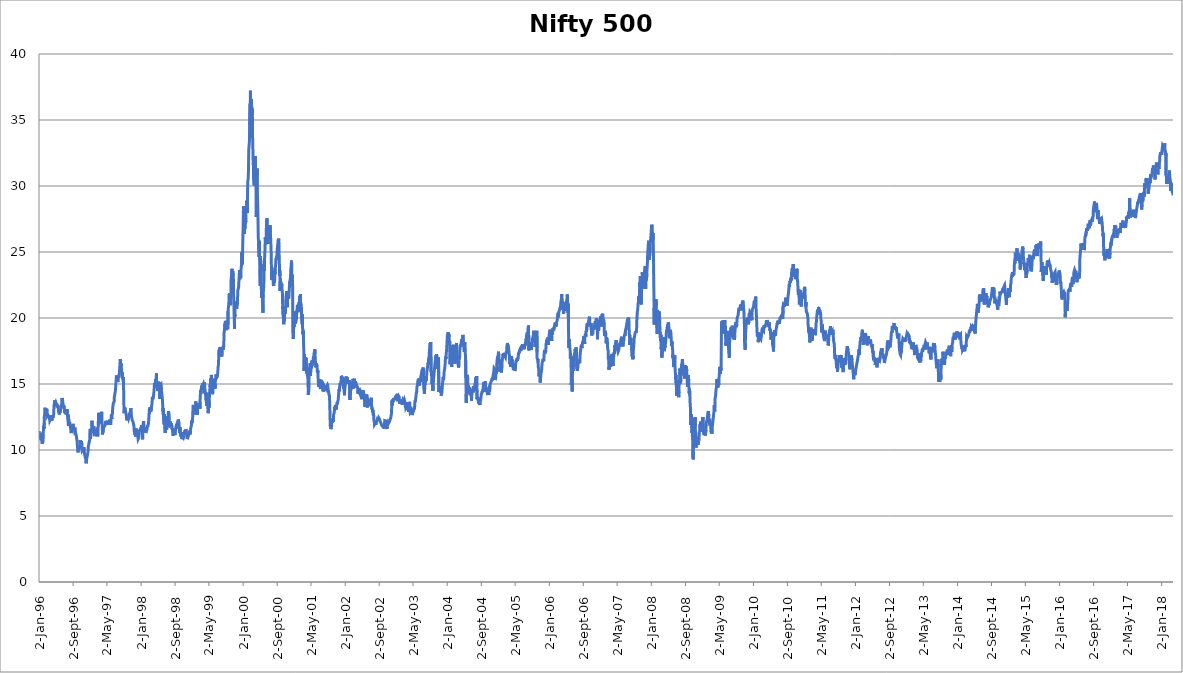
| Category | Nifty 500 P/E |
|---|---|
| 1996-01-02 | 11.43 |
| 1996-01-03 | 11.37 |
| 1996-01-04 | 11.3 |
| 1996-01-05 | 11.23 |
| 1996-01-08 | 11.07 |
| 1996-01-09 | 11.01 |
| 1996-01-10 | 10.98 |
| 1996-01-11 | 11.03 |
| 1996-01-12 | 11.05 |
| 1996-01-15 | 11.06 |
| 1996-01-16 | 11.03 |
| 1996-01-17 | 10.9 |
| 1996-01-18 | 10.81 |
| 1996-01-19 | 10.75 |
| 1996-01-22 | 10.74 |
| 1996-01-23 | 10.64 |
| 1996-01-24 | 10.47 |
| 1996-01-25 | 10.45 |
| 1996-01-29 | 10.54 |
| 1996-01-30 | 10.67 |
| 1996-01-31 | 10.7 |
| 1996-02-01 | 10.98 |
| 1996-02-02 | 11.52 |
| 1996-02-05 | 11.8 |
| 1996-02-06 | 11.61 |
| 1996-02-07 | 11.64 |
| 1996-02-08 | 12.07 |
| 1996-02-09 | 12.56 |
| 1996-02-12 | 12.76 |
| 1996-02-13 | 12.92 |
| 1996-02-14 | 13.2 |
| 1996-02-15 | 13.13 |
| 1996-02-16 | 12.93 |
| 1996-02-19 | 12.97 |
| 1996-02-20 | 12.84 |
| 1996-02-22 | 12.99 |
| 1996-02-23 | 12.97 |
| 1996-02-26 | 13.13 |
| 1996-02-27 | 13.08 |
| 1996-02-28 | 12.86 |
| 1996-02-29 | 12.61 |
| 1996-03-01 | 12.63 |
| 1996-03-04 | 12.69 |
| 1996-03-06 | 12.74 |
| 1996-03-07 | 12.68 |
| 1996-03-08 | 12.6 |
| 1996-03-11 | 12.41 |
| 1996-03-12 | 12.36 |
| 1996-03-13 | 12.53 |
| 1996-03-14 | 12.56 |
| 1996-03-15 | 12.47 |
| 1996-03-18 | 12.33 |
| 1996-03-19 | 12.22 |
| 1996-03-21 | 12.29 |
| 1996-03-22 | 12.22 |
| 1996-03-25 | 12.22 |
| 1996-03-26 | 12.22 |
| 1996-03-27 | 12.39 |
| 1996-03-29 | 12.64 |
| 1996-04-02 | 12.24 |
| 1996-04-03 | 12.3 |
| 1996-04-04 | 12.27 |
| 1996-04-05 | 12.39 |
| 1996-04-08 | 12.53 |
| 1996-04-09 | 12.51 |
| 1996-04-10 | 12.44 |
| 1996-04-11 | 12.4 |
| 1996-04-12 | 12.47 |
| 1996-04-15 | 12.66 |
| 1996-04-16 | 12.77 |
| 1996-04-17 | 13.11 |
| 1996-04-18 | 13.34 |
| 1996-04-22 | 13.3 |
| 1996-04-23 | 13.3 |
| 1996-04-24 | 13.78 |
| 1996-04-25 | 13.75 |
| 1996-04-26 | 13.54 |
| 1996-04-30 | 13.63 |
| 1996-05-02 | 13.67 |
| 1996-05-03 | 13.54 |
| 1996-05-06 | 13.34 |
| 1996-05-08 | 13.51 |
| 1996-05-09 | 13.32 |
| 1996-05-10 | 13.23 |
| 1996-05-13 | 13.35 |
| 1996-05-14 | 13.26 |
| 1996-05-15 | 13.25 |
| 1996-05-16 | 13.37 |
| 1996-05-17 | 13.23 |
| 1996-05-20 | 12.98 |
| 1996-05-21 | 12.86 |
| 1996-05-22 | 12.87 |
| 1996-05-23 | 12.83 |
| 1996-05-24 | 12.88 |
| 1996-05-27 | 12.69 |
| 1996-05-28 | 12.62 |
| 1996-05-29 | 12.94 |
| 1996-05-30 | 12.83 |
| 1996-05-31 | 12.79 |
| 1996-06-03 | 12.99 |
| 1996-06-04 | 12.96 |
| 1996-06-05 | 13 |
| 1996-06-06 | 13.11 |
| 1996-06-07 | 13.24 |
| 1996-06-10 | 13.36 |
| 1996-06-11 | 13.39 |
| 1996-06-12 | 13.52 |
| 1996-06-13 | 13.68 |
| 1996-06-14 | 13.94 |
| 1996-06-17 | 14 |
| 1996-06-18 | 13.98 |
| 1996-06-19 | 13.73 |
| 1996-06-20 | 13.72 |
| 1996-06-21 | 13.5 |
| 1996-06-24 | 13.54 |
| 1996-06-25 | 13.36 |
| 1996-06-26 | 13.24 |
| 1996-06-27 | 13.36 |
| 1996-06-28 | 13.3 |
| 1996-07-01 | 13.12 |
| 1996-07-02 | 13.05 |
| 1996-07-03 | 12.82 |
| 1996-07-04 | 12.88 |
| 1996-07-05 | 12.93 |
| 1996-07-08 | 12.99 |
| 1996-07-09 | 12.73 |
| 1996-07-10 | 12.78 |
| 1996-07-11 | 12.87 |
| 1996-07-12 | 12.79 |
| 1996-07-15 | 12.82 |
| 1996-07-16 | 12.7 |
| 1996-07-17 | 12.87 |
| 1996-07-18 | 12.94 |
| 1996-07-19 | 12.92 |
| 1996-07-22 | 13.09 |
| 1996-07-23 | 12.69 |
| 1996-07-24 | 12.49 |
| 1996-07-25 | 12.43 |
| 1996-07-26 | 12.3 |
| 1996-07-29 | 12.03 |
| 1996-07-30 | 11.83 |
| 1996-07-31 | 12.67 |
| 1996-08-01 | 12.14 |
| 1996-08-02 | 12.07 |
| 1996-08-05 | 12.02 |
| 1996-08-06 | 11.99 |
| 1996-08-07 | 12.12 |
| 1996-08-08 | 12.05 |
| 1996-08-09 | 12.02 |
| 1996-08-12 | 11.9 |
| 1996-08-13 | 11.83 |
| 1996-08-14 | 11.72 |
| 1996-08-16 | 11.57 |
| 1996-08-19 | 11.28 |
| 1996-08-20 | 11.28 |
| 1996-08-21 | 11.5 |
| 1996-08-22 | 11.55 |
| 1996-08-23 | 11.67 |
| 1996-08-26 | 11.67 |
| 1996-08-27 | 11.69 |
| 1996-08-29 | 11.87 |
| 1996-08-30 | 11.87 |
| 1996-09-02 | 11.98 |
| 1996-09-03 | 11.82 |
| 1996-09-04 | 11.86 |
| 1996-09-06 | 11.87 |
| 1996-09-09 | 11.75 |
| 1996-09-10 | 11.63 |
| 1996-09-11 | 11.49 |
| 1996-09-12 | 11.48 |
| 1996-09-13 | 11.36 |
| 1996-09-18 | 11.44 |
| 1996-09-19 | 11.29 |
| 1996-09-20 | 11.26 |
| 1996-09-23 | 11.17 |
| 1996-09-24 | 11.15 |
| 1996-09-25 | 11.14 |
| 1996-09-26 | 11.01 |
| 1996-09-27 | 10.85 |
| 1996-09-30 | 10.73 |
| 1996-10-01 | 10.47 |
| 1996-10-03 | 10.41 |
| 1996-10-04 | 10.16 |
| 1996-10-07 | 9.82 |
| 1996-10-08 | 9.84 |
| 1996-10-09 | 9.89 |
| 1996-10-10 | 10.2 |
| 1996-10-11 | 10.34 |
| 1996-10-14 | 10.15 |
| 1996-10-15 | 10.15 |
| 1996-10-16 | 10.12 |
| 1996-10-17 | 10.12 |
| 1996-10-18 | 10.22 |
| 1996-10-22 | 10.22 |
| 1996-10-23 | 10.75 |
| 1996-10-24 | 10.53 |
| 1996-10-25 | 10.51 |
| 1996-10-28 | 10.53 |
| 1996-10-29 | 10.44 |
| 1996-10-30 | 10.28 |
| 1996-10-31 | 10.22 |
| 1996-11-01 | 10.68 |
| 1996-11-04 | 10.02 |
| 1996-11-05 | 9.93 |
| 1996-11-06 | 9.93 |
| 1996-11-07 | 9.98 |
| 1996-11-10 | 9.96 |
| 1996-11-13 | 10.04 |
| 1996-11-14 | 10.03 |
| 1996-11-15 | 10.08 |
| 1996-11-18 | 10.2 |
| 1996-11-19 | 10.14 |
| 1996-11-20 | 9.97 |
| 1996-11-21 | 9.9 |
| 1996-11-22 | 9.71 |
| 1996-11-25 | 9.74 |
| 1996-11-26 | 9.66 |
| 1996-11-27 | 9.47 |
| 1996-11-28 | 9.44 |
| 1996-11-29 | 9.4 |
| 1996-12-02 | 9.27 |
| 1996-12-03 | 9.12 |
| 1996-12-04 | 8.99 |
| 1996-12-05 | 9.16 |
| 1996-12-06 | 9.23 |
| 1996-12-09 | 9.21 |
| 1996-12-10 | 9.19 |
| 1996-12-11 | 9.11 |
| 1996-12-12 | 9.57 |
| 1996-12-13 | 9.59 |
| 1996-12-16 | 9.59 |
| 1996-12-17 | 9.85 |
| 1996-12-18 | 9.94 |
| 1996-12-19 | 10.03 |
| 1996-12-20 | 10.3 |
| 1996-12-23 | 10.31 |
| 1996-12-24 | 10.31 |
| 1997-01-01 | 10.91 |
| 1997-01-02 | 11.6 |
| 1997-01-03 | 10.87 |
| 1997-01-06 | 10.97 |
| 1997-01-07 | 10.98 |
| 1997-01-08 | 11.22 |
| 1997-01-09 | 11.25 |
| 1997-01-10 | 11.46 |
| 1997-01-13 | 11.61 |
| 1997-01-14 | 11.72 |
| 1997-01-15 | 12.22 |
| 1997-01-16 | 11.71 |
| 1997-01-17 | 11.49 |
| 1997-01-20 | 11.37 |
| 1997-01-21 | 11.29 |
| 1997-01-22 | 11.4 |
| 1997-01-24 | 11.39 |
| 1997-01-27 | 11.72 |
| 1997-01-28 | 11.8 |
| 1997-01-29 | 11.64 |
| 1997-01-30 | 11.56 |
| 1997-01-31 | 11.2 |
| 1997-02-03 | 11.05 |
| 1997-02-04 | 11.01 |
| 1997-02-05 | 11.12 |
| 1997-02-06 | 11.21 |
| 1997-02-07 | 11.22 |
| 1997-02-10 | 11.25 |
| 1997-02-11 | 11.48 |
| 1997-02-12 | 11.45 |
| 1997-02-13 | 11.49 |
| 1997-02-14 | 11.52 |
| 1997-02-17 | 11.56 |
| 1997-02-18 | 11.54 |
| 1997-02-19 | 11.51 |
| 1997-02-20 | 11.44 |
| 1997-02-21 | 11.26 |
| 1997-02-24 | 11.03 |
| 1997-02-25 | 11.01 |
| 1997-02-26 | 11.04 |
| 1997-02-27 | 11.24 |
| 1997-02-28 | 11.88 |
| 1997-03-01 | 12.03 |
| 1997-03-03 | 12.67 |
| 1997-03-04 | 12.82 |
| 1997-03-05 | 12.84 |
| 1997-03-06 | 12.65 |
| 1997-03-10 | 12.35 |
| 1997-03-11 | 12.19 |
| 1997-03-12 | 12.3 |
| 1997-03-13 | 12.27 |
| 1997-03-14 | 12.19 |
| 1997-03-17 | 12.27 |
| 1997-03-18 | 12.25 |
| 1997-03-19 | 12.08 |
| 1997-03-20 | 12.16 |
| 1997-03-21 | 12.18 |
| 1997-03-25 | 12.89 |
| 1997-03-26 | 12.22 |
| 1997-03-27 | 12.23 |
| 1997-03-28 | 12.07 |
| 1997-03-31 | 11.18 |
| 1997-04-01 | 11.35 |
| 1997-04-02 | 11.72 |
| 1997-04-03 | 11.79 |
| 1997-04-04 | 11.73 |
| 1997-04-07 | 11.62 |
| 1997-04-09 | 11.85 |
| 1997-04-10 | 11.73 |
| 1997-04-11 | 11.79 |
| 1997-04-12 | 11.67 |
| 1997-04-15 | 11.71 |
| 1997-04-17 | 11.84 |
| 1997-04-21 | 12.11 |
| 1997-04-22 | 12.11 |
| 1997-04-23 | 12.08 |
| 1997-04-24 | 12.01 |
| 1997-04-25 | 12.21 |
| 1997-04-28 | 12.09 |
| 1997-04-29 | 12.05 |
| 1997-04-30 | 12.15 |
| 1997-05-02 | 12.01 |
| 1997-05-05 | 11.9 |
| 1997-05-06 | 12.01 |
| 1997-05-07 | 11.97 |
| 1997-05-09 | 12.01 |
| 1997-05-12 | 12.04 |
| 1997-05-13 | 11.98 |
| 1997-05-14 | 12.11 |
| 1997-05-15 | 12.14 |
| 1997-05-16 | 12.04 |
| 1997-05-19 | 12.21 |
| 1997-05-20 | 12.19 |
| 1997-05-21 | 12.3 |
| 1997-05-22 | 12.11 |
| 1997-05-23 | 12.04 |
| 1997-05-26 | 11.99 |
| 1997-05-27 | 11.93 |
| 1997-05-28 | 11.91 |
| 1997-05-29 | 11.99 |
| 1997-05-30 | 12.11 |
| 1997-06-02 | 12.04 |
| 1997-06-03 | 12.71 |
| 1997-06-04 | 12.78 |
| 1997-06-05 | 12.35 |
| 1997-06-06 | 12.65 |
| 1997-06-09 | 12.66 |
| 1997-06-10 | 12.74 |
| 1997-06-11 | 12.94 |
| 1997-06-12 | 13.19 |
| 1997-06-13 | 13.27 |
| 1997-06-16 | 13.31 |
| 1997-06-17 | 13.55 |
| 1997-06-18 | 13.57 |
| 1997-06-19 | 13.57 |
| 1997-06-20 | 13.58 |
| 1997-06-23 | 13.67 |
| 1997-06-24 | 14.02 |
| 1997-06-25 | 13.98 |
| 1997-06-26 | 14.01 |
| 1997-06-27 | 14 |
| 1997-06-30 | 14.4 |
| 1997-07-01 | 14.48 |
| 1997-07-02 | 14.6 |
| 1997-07-03 | 14.55 |
| 1997-07-04 | 14.55 |
| 1997-07-07 | 14.59 |
| 1997-07-08 | 14.67 |
| 1997-07-09 | 15.65 |
| 1997-07-10 | 15.65 |
| 1997-07-11 | 15.72 |
| 1997-07-14 | 15.46 |
| 1997-07-15 | 15.45 |
| 1997-07-16 | 15.38 |
| 1997-07-17 | 15.4 |
| 1997-07-18 | 15.16 |
| 1997-07-21 | 15.26 |
| 1997-07-22 | 15.42 |
| 1997-07-23 | 15.67 |
| 1997-07-24 | 15.63 |
| 1997-07-25 | 15.48 |
| 1997-07-28 | 15.54 |
| 1997-07-29 | 15.71 |
| 1997-07-30 | 15.78 |
| 1997-07-31 | 16 |
| 1997-08-01 | 16.14 |
| 1997-08-04 | 16.6 |
| 1997-08-05 | 16.88 |
| 1997-08-06 | 16.77 |
| 1997-08-07 | 16.5 |
| 1997-08-08 | 16.29 |
| 1997-08-11 | 16.55 |
| 1997-08-12 | 16.47 |
| 1997-08-13 | 16.28 |
| 1997-08-14 | 16.1 |
| 1997-08-19 | 15.68 |
| 1997-08-20 | 15.88 |
| 1997-08-21 | 15.7 |
| 1997-08-22 | 15.37 |
| 1997-08-26 | 15.53 |
| 1997-08-27 | 15.53 |
| 1997-08-28 | 15.07 |
| 1997-08-29 | 14.71 |
| 1997-09-01 | 12.79 |
| 1997-09-02 | 12.8 |
| 1997-09-03 | 12.85 |
| 1997-09-04 | 12.95 |
| 1997-09-05 | 13 |
| 1997-09-08 | 13.21 |
| 1997-09-09 | 13.08 |
| 1997-09-10 | 13.1 |
| 1997-09-11 | 13 |
| 1997-09-12 | 12.92 |
| 1997-09-15 | 12.96 |
| 1997-09-16 | 12.92 |
| 1997-09-17 | 12.69 |
| 1997-09-18 | 12.56 |
| 1997-09-19 | 12.38 |
| 1997-09-22 | 12.25 |
| 1997-09-23 | 12.36 |
| 1997-09-24 | 12.5 |
| 1997-09-25 | 12.37 |
| 1997-09-26 | 12.59 |
| 1997-09-29 | 12.61 |
| 1997-09-30 | 12.52 |
| 1997-10-01 | 12.53 |
| 1997-10-03 | 12.36 |
| 1997-10-06 | 12.39 |
| 1997-10-07 | 12.51 |
| 1997-10-08 | 12.56 |
| 1997-10-09 | 12.69 |
| 1997-10-10 | 12.81 |
| 1997-10-13 | 12.86 |
| 1997-10-14 | 12.71 |
| 1997-10-15 | 12.77 |
| 1997-10-16 | 12.89 |
| 1997-10-17 | 12.99 |
| 1997-10-20 | 13.17 |
| 1997-10-21 | 13.05 |
| 1997-10-22 | 12.96 |
| 1997-10-23 | 12.77 |
| 1997-10-24 | 12.58 |
| 1997-10-27 | 12.54 |
| 1997-10-30 | 12.26 |
| 1997-11-03 | 12.18 |
| 1997-11-04 | 12.18 |
| 1997-11-05 | 12.1 |
| 1997-11-06 | 12.04 |
| 1997-11-07 | 11.98 |
| 1997-11-10 | 11.9 |
| 1997-11-11 | 11.88 |
| 1997-11-12 | 11.66 |
| 1997-11-13 | 11.4 |
| 1997-11-14 | 11.39 |
| 1997-11-17 | 11.43 |
| 1997-11-18 | 11.27 |
| 1997-11-19 | 11.12 |
| 1997-11-20 | 11.16 |
| 1997-11-21 | 11.31 |
| 1997-11-24 | 11.02 |
| 1997-11-25 | 11.2 |
| 1997-11-26 | 11.38 |
| 1997-11-27 | 11.63 |
| 1997-11-28 | 11.42 |
| 1997-12-01 | 11.55 |
| 1997-12-02 | 11.51 |
| 1997-12-03 | 11.53 |
| 1997-12-04 | 11.41 |
| 1997-12-05 | 11.23 |
| 1997-12-08 | 11.21 |
| 1997-12-09 | 11.02 |
| 1997-12-10 | 10.91 |
| 1997-12-11 | 10.82 |
| 1997-12-12 | 10.81 |
| 1997-12-15 | 10.91 |
| 1997-12-16 | 11.06 |
| 1997-12-17 | 11.24 |
| 1997-12-18 | 11.21 |
| 1997-12-19 | 11.36 |
| 1997-12-22 | 11.39 |
| 1997-12-23 | 11.44 |
| 1997-12-24 | 11.38 |
| 1997-12-26 | 11.44 |
| 1997-12-29 | 11.65 |
| 1997-12-30 | 11.49 |
| 1997-12-31 | 11.53 |
| 1998-01-01 | 11.68 |
| 1998-01-02 | 11.78 |
| 1998-01-05 | 11.88 |
| 1998-01-06 | 11.79 |
| 1998-01-07 | 11.7 |
| 1998-01-08 | 11.44 |
| 1998-01-09 | 11.15 |
| 1998-01-12 | 10.81 |
| 1998-01-13 | 10.91 |
| 1998-01-14 | 10.85 |
| 1998-01-15 | 11.89 |
| 1998-01-16 | 11.94 |
| 1998-01-19 | 12.18 |
| 1998-01-20 | 12.08 |
| 1998-01-21 | 11.98 |
| 1998-01-22 | 11.84 |
| 1998-01-23 | 11.73 |
| 1998-01-27 | 11.49 |
| 1998-01-28 | 11.31 |
| 1998-01-29 | 11.29 |
| 1998-02-02 | 11.72 |
| 1998-02-03 | 11.68 |
| 1998-02-04 | 11.57 |
| 1998-02-05 | 11.64 |
| 1998-02-06 | 11.62 |
| 1998-02-09 | 11.56 |
| 1998-02-10 | 11.47 |
| 1998-02-11 | 11.41 |
| 1998-02-12 | 11.42 |
| 1998-02-13 | 11.58 |
| 1998-02-16 | 11.87 |
| 1998-02-17 | 11.75 |
| 1998-02-18 | 11.73 |
| 1998-02-19 | 11.84 |
| 1998-02-20 | 11.8 |
| 1998-02-23 | 12.01 |
| 1998-02-24 | 12.03 |
| 1998-02-26 | 12.46 |
| 1998-02-27 | 12.66 |
| 1998-03-02 | 13.2 |
| 1998-03-03 | 12.75 |
| 1998-03-04 | 13.08 |
| 1998-03-05 | 12.97 |
| 1998-03-06 | 12.94 |
| 1998-03-09 | 13.25 |
| 1998-03-10 | 13.19 |
| 1998-03-11 | 13.03 |
| 1998-03-12 | 12.92 |
| 1998-03-16 | 13.2 |
| 1998-03-17 | 13.21 |
| 1998-03-18 | 13.37 |
| 1998-03-19 | 13.38 |
| 1998-03-20 | 13.46 |
| 1998-03-23 | 14 |
| 1998-03-24 | 13.93 |
| 1998-03-25 | 14.07 |
| 1998-03-26 | 13.85 |
| 1998-03-27 | 13.91 |
| 1998-03-30 | 13.91 |
| 1998-03-31 | 13.85 |
| 1998-04-01 | 14.18 |
| 1998-04-02 | 14.23 |
| 1998-04-03 | 14.4 |
| 1998-04-06 | 14.82 |
| 1998-04-07 | 14.98 |
| 1998-04-08 | 15.02 |
| 1998-04-10 | 15.08 |
| 1998-04-13 | 14.84 |
| 1998-04-15 | 15.38 |
| 1998-04-16 | 15.13 |
| 1998-04-17 | 15.27 |
| 1998-04-20 | 15.48 |
| 1998-04-21 | 15.81 |
| 1998-04-22 | 15.37 |
| 1998-04-23 | 15.02 |
| 1998-04-24 | 14.76 |
| 1998-04-27 | 14.87 |
| 1998-04-29 | 14.47 |
| 1998-04-30 | 14.65 |
| 1998-05-04 | 15.18 |
| 1998-05-05 | 15.25 |
| 1998-05-06 | 14.93 |
| 1998-05-08 | 14.75 |
| 1998-05-12 | 14.49 |
| 1998-05-13 | 13.87 |
| 1998-05-14 | 14.32 |
| 1998-05-15 | 14.15 |
| 1998-05-18 | 14.75 |
| 1998-05-19 | 14.87 |
| 1998-05-20 | 15.11 |
| 1998-05-21 | 14.83 |
| 1998-05-22 | 14.79 |
| 1998-05-25 | 14.91 |
| 1998-05-26 | 14.83 |
| 1998-05-27 | 14.62 |
| 1998-05-28 | 14.44 |
| 1998-05-29 | 14.32 |
| 1998-06-01 | 14.32 |
| 1998-06-02 | 13.94 |
| 1998-06-03 | 13.93 |
| 1998-06-04 | 13.76 |
| 1998-06-05 | 13.15 |
| 1998-06-08 | 12.93 |
| 1998-06-09 | 13.14 |
| 1998-06-10 | 12.56 |
| 1998-06-11 | 12.65 |
| 1998-06-12 | 12.71 |
| 1998-06-15 | 12.02 |
| 1998-06-16 | 11.93 |
| 1998-06-17 | 12.71 |
| 1998-06-18 | 12.37 |
| 1998-06-19 | 11.83 |
| 1998-06-22 | 11.42 |
| 1998-06-23 | 11.29 |
| 1998-06-24 | 11.74 |
| 1998-06-25 | 11.95 |
| 1998-06-26 | 11.87 |
| 1998-06-29 | 12.33 |
| 1998-06-30 | 12.2 |
| 1998-07-01 | 12.04 |
| 1998-07-02 | 11.89 |
| 1998-07-03 | 11.55 |
| 1998-07-06 | 11.88 |
| 1998-07-07 | 12.01 |
| 1998-07-08 | 12.16 |
| 1998-07-09 | 12.37 |
| 1998-07-10 | 12.56 |
| 1998-07-13 | 12.4 |
| 1998-07-14 | 12.55 |
| 1998-07-15 | 12.58 |
| 1998-07-16 | 12.95 |
| 1998-07-17 | 12.88 |
| 1998-07-20 | 12.64 |
| 1998-07-21 | 12.53 |
| 1998-07-22 | 12.49 |
| 1998-07-23 | 12.1 |
| 1998-07-24 | 11.92 |
| 1998-07-27 | 11.71 |
| 1998-07-28 | 11.99 |
| 1998-07-29 | 12.16 |
| 1998-07-30 | 12.16 |
| 1998-07-31 | 12.15 |
| 1998-08-03 | 11.92 |
| 1998-08-04 | 11.91 |
| 1998-08-05 | 12.02 |
| 1998-08-06 | 11.95 |
| 1998-08-07 | 11.93 |
| 1998-08-10 | 11.81 |
| 1998-08-11 | 11.66 |
| 1998-08-12 | 11.55 |
| 1998-08-13 | 11.66 |
| 1998-08-14 | 11.44 |
| 1998-08-17 | 11.31 |
| 1998-08-18 | 11.09 |
| 1998-08-19 | 11.21 |
| 1998-08-20 | 11.54 |
| 1998-08-21 | 11.4 |
| 1998-08-24 | 11.46 |
| 1998-08-25 | 11.62 |
| 1998-08-27 | 11.65 |
| 1998-08-28 | 11.38 |
| 1998-08-31 | 11.42 |
| 1998-09-01 | 11.13 |
| 1998-09-02 | 11.25 |
| 1998-09-03 | 11.3 |
| 1998-09-04 | 11.44 |
| 1998-09-07 | 11.68 |
| 1998-09-08 | 11.79 |
| 1998-09-09 | 11.85 |
| 1998-09-10 | 11.84 |
| 1998-09-11 | 11.72 |
| 1998-09-14 | 11.96 |
| 1998-09-15 | 11.99 |
| 1998-09-16 | 11.96 |
| 1998-09-17 | 11.94 |
| 1998-09-18 | 11.87 |
| 1998-09-21 | 11.86 |
| 1998-09-22 | 11.86 |
| 1998-09-23 | 12.06 |
| 1998-09-24 | 12.31 |
| 1998-09-25 | 12.32 |
| 1998-09-28 | 12.3 |
| 1998-09-29 | 12.05 |
| 1998-09-30 | 12.07 |
| 1998-10-05 | 11.28 |
| 1998-10-06 | 11.35 |
| 1998-10-07 | 11.73 |
| 1998-10-08 | 11.39 |
| 1998-10-09 | 11.44 |
| 1998-10-12 | 11.24 |
| 1998-10-13 | 11.01 |
| 1998-10-14 | 11.28 |
| 1998-10-15 | 11.21 |
| 1998-10-16 | 11.22 |
| 1998-10-19 | 11.11 |
| 1998-10-20 | 10.82 |
| 1998-10-22 | 10.9 |
| 1998-10-23 | 10.93 |
| 1998-10-26 | 11.36 |
| 1998-10-27 | 11.33 |
| 1998-10-28 | 11.19 |
| 1998-10-29 | 11.2 |
| 1998-10-30 | 11.07 |
| 1998-10-31 | 11.04 |
| 1998-11-02 | 10.99 |
| 1998-11-03 | 10.94 |
| 1998-11-05 | 11.04 |
| 1998-11-06 | 11.14 |
| 1998-11-09 | 11.4 |
| 1998-11-10 | 11.47 |
| 1998-11-11 | 11.44 |
| 1998-11-12 | 11.5 |
| 1998-11-13 | 11.42 |
| 1998-11-16 | 11.3 |
| 1998-11-17 | 11.38 |
| 1998-11-18 | 11.59 |
| 1998-11-19 | 11.48 |
| 1998-11-20 | 11.4 |
| 1998-11-21 | 11.4 |
| 1998-11-23 | 11.26 |
| 1998-11-24 | 11.19 |
| 1998-11-26 | 10.97 |
| 1998-11-27 | 10.83 |
| 1998-11-28 | 10.81 |
| 1998-11-30 | 10.9 |
| 1998-12-01 | 10.88 |
| 1998-12-02 | 10.95 |
| 1998-12-03 | 10.91 |
| 1998-12-04 | 11.02 |
| 1998-12-07 | 11.22 |
| 1998-12-08 | 11.29 |
| 1998-12-09 | 11.32 |
| 1998-12-10 | 11.38 |
| 1998-12-11 | 11.45 |
| 1998-12-14 | 11.36 |
| 1998-12-15 | 11.36 |
| 1998-12-16 | 11.44 |
| 1998-12-17 | 11.19 |
| 1998-12-18 | 11.26 |
| 1998-12-21 | 11.58 |
| 1998-12-22 | 11.53 |
| 1998-12-23 | 11.57 |
| 1998-12-24 | 11.6 |
| 1998-12-28 | 11.88 |
| 1998-12-29 | 11.84 |
| 1998-12-30 | 12.23 |
| 1998-12-31 | 12.04 |
| 1999-01-01 | 12.14 |
| 1999-01-04 | 12.26 |
| 1999-01-05 | 12.4 |
| 1999-01-06 | 12.69 |
| 1999-01-07 | 12.95 |
| 1999-01-08 | 13.33 |
| 1999-01-11 | 13.41 |
| 1999-01-12 | 13.15 |
| 1999-01-13 | 13.2 |
| 1999-01-14 | 13.14 |
| 1999-01-15 | 12.88 |
| 1999-01-18 | 12.97 |
| 1999-01-19 | 12.7 |
| 1999-01-21 | 13.4 |
| 1999-01-22 | 13.33 |
| 1999-01-25 | 13.27 |
| 1999-01-27 | 13.67 |
| 1999-01-28 | 13.4 |
| 1999-01-29 | 13.47 |
| 1999-02-01 | 13.1 |
| 1999-02-02 | 12.9 |
| 1999-02-03 | 13.13 |
| 1999-02-04 | 12.95 |
| 1999-02-05 | 12.89 |
| 1999-02-08 | 12.66 |
| 1999-02-09 | 12.74 |
| 1999-02-10 | 13.19 |
| 1999-02-11 | 13.24 |
| 1999-02-12 | 13.39 |
| 1999-02-15 | 13.2 |
| 1999-02-16 | 13.31 |
| 1999-02-17 | 13.53 |
| 1999-02-18 | 13.56 |
| 1999-02-19 | 13.57 |
| 1999-02-22 | 13.22 |
| 1999-02-23 | 13.12 |
| 1999-02-24 | 13.31 |
| 1999-02-25 | 13.29 |
| 1999-02-26 | 13.13 |
| 1999-02-27 | 13.66 |
| 1999-03-01 | 14.07 |
| 1999-03-03 | 14.51 |
| 1999-03-04 | 14.3 |
| 1999-03-05 | 14.47 |
| 1999-03-08 | 14.61 |
| 1999-03-09 | 14.68 |
| 1999-03-10 | 14.87 |
| 1999-03-11 | 14.56 |
| 1999-03-12 | 14.77 |
| 1999-03-15 | 14.85 |
| 1999-03-16 | 14.65 |
| 1999-03-17 | 14.77 |
| 1999-03-18 | 15.05 |
| 1999-03-19 | 14.88 |
| 1999-03-20 | 14.89 |
| 1999-03-22 | 14.94 |
| 1999-03-23 | 14.99 |
| 1999-03-24 | 14.95 |
| 1999-03-25 | 14.87 |
| 1999-03-26 | 14.6 |
| 1999-03-30 | 14.68 |
| 1999-03-31 | 15.11 |
| 1999-04-01 | 15 |
| 1999-04-05 | 14.25 |
| 1999-04-06 | 14.29 |
| 1999-04-07 | 14.4 |
| 1999-04-08 | 14.25 |
| 1999-04-09 | 13.84 |
| 1999-04-12 | 13.84 |
| 1999-04-13 | 13.73 |
| 1999-04-15 | 13.33 |
| 1999-04-16 | 14.34 |
| 1999-04-17 | 13.33 |
| 1999-04-19 | 13.67 |
| 1999-04-20 | 13.7 |
| 1999-04-21 | 13.81 |
| 1999-04-22 | 13.58 |
| 1999-04-23 | 13.55 |
| 1999-04-26 | 12.79 |
| 1999-04-28 | 12.95 |
| 1999-04-29 | 13.29 |
| 1999-04-30 | 13.55 |
| 1999-05-03 | 13.21 |
| 1999-05-04 | 13.74 |
| 1999-05-05 | 13.96 |
| 1999-05-06 | 14.22 |
| 1999-05-07 | 14.41 |
| 1999-05-10 | 14.77 |
| 1999-05-11 | 14.99 |
| 1999-05-12 | 14.79 |
| 1999-05-13 | 15.22 |
| 1999-05-14 | 15.41 |
| 1999-05-17 | 15.19 |
| 1999-05-18 | 15.31 |
| 1999-05-19 | 15.69 |
| 1999-05-20 | 15.59 |
| 1999-05-21 | 15.29 |
| 1999-05-24 | 15.31 |
| 1999-05-25 | 15.41 |
| 1999-05-26 | 14.92 |
| 1999-05-27 | 14.46 |
| 1999-05-28 | 14.23 |
| 1999-05-31 | 14.85 |
| 1999-06-01 | 14.71 |
| 1999-06-02 | 14.79 |
| 1999-06-03 | 14.95 |
| 1999-06-04 | 15.14 |
| 1999-06-07 | 15.15 |
| 1999-06-08 | 15.39 |
| 1999-06-09 | 15.27 |
| 1999-06-10 | 15.31 |
| 1999-06-11 | 15.06 |
| 1999-06-14 | 14.81 |
| 1999-06-15 | 14.65 |
| 1999-06-16 | 14.98 |
| 1999-06-17 | 15.25 |
| 1999-06-18 | 15.21 |
| 1999-06-21 | 15.55 |
| 1999-06-22 | 15.72 |
| 1999-06-23 | 15.51 |
| 1999-06-24 | 15.38 |
| 1999-06-25 | 15.37 |
| 1999-06-28 | 15.55 |
| 1999-06-29 | 15.55 |
| 1999-06-30 | 15.52 |
| 1999-07-01 | 15.48 |
| 1999-07-02 | 15.63 |
| 1999-07-05 | 16.04 |
| 1999-07-06 | 16.22 |
| 1999-07-07 | 16.28 |
| 1999-07-08 | 16.27 |
| 1999-07-09 | 16.48 |
| 1999-07-12 | 17.29 |
| 1999-07-13 | 17.32 |
| 1999-07-14 | 17.6 |
| 1999-07-15 | 17.26 |
| 1999-07-16 | 17.4 |
| 1999-07-19 | 17.74 |
| 1999-07-20 | 17.33 |
| 1999-07-21 | 17.67 |
| 1999-07-22 | 17.81 |
| 1999-07-23 | 17.66 |
| 1999-07-26 | 17.52 |
| 1999-07-27 | 17.37 |
| 1999-07-28 | 17.55 |
| 1999-07-29 | 17.53 |
| 1999-07-30 | 17.39 |
| 1999-08-02 | 17.08 |
| 1999-08-03 | 17.14 |
| 1999-08-04 | 17.66 |
| 1999-08-05 | 17.59 |
| 1999-08-06 | 17.59 |
| 1999-08-09 | 17.8 |
| 1999-08-10 | 17.63 |
| 1999-08-11 | 17.75 |
| 1999-08-12 | 17.78 |
| 1999-08-13 | 17.62 |
| 1999-08-16 | 17.93 |
| 1999-08-17 | 18.32 |
| 1999-08-18 | 18.87 |
| 1999-08-19 | 18.89 |
| 1999-08-20 | 19.01 |
| 1999-08-23 | 19.3 |
| 1999-08-24 | 19.5 |
| 1999-08-25 | 19.29 |
| 1999-08-26 | 19.66 |
| 1999-08-27 | 19.79 |
| 1999-08-30 | 19.76 |
| 1999-08-31 | 19.63 |
| 1999-09-01 | 19.52 |
| 1999-09-02 | 19.08 |
| 1999-09-03 | 19.09 |
| 1999-09-06 | 19.31 |
| 1999-09-07 | 19.21 |
| 1999-09-08 | 19.36 |
| 1999-09-09 | 19.32 |
| 1999-09-10 | 19.3 |
| 1999-09-14 | 19.15 |
| 1999-09-15 | 19.16 |
| 1999-09-16 | 20.51 |
| 1999-09-17 | 20.68 |
| 1999-09-20 | 20.69 |
| 1999-09-21 | 20.65 |
| 1999-09-22 | 21.22 |
| 1999-09-23 | 21.57 |
| 1999-09-24 | 21.81 |
| 1999-09-27 | 21.52 |
| 1999-09-28 | 21.35 |
| 1999-09-29 | 21.89 |
| 1999-09-30 | 21.76 |
| 1999-10-01 | 21.56 |
| 1999-10-04 | 20.97 |
| 1999-10-05 | 21.24 |
| 1999-10-06 | 21.54 |
| 1999-10-07 | 22.68 |
| 1999-10-08 | 22.98 |
| 1999-10-11 | 23 |
| 1999-10-12 | 23.23 |
| 1999-10-13 | 23.55 |
| 1999-10-14 | 23.73 |
| 1999-10-15 | 22.83 |
| 1999-10-18 | 22.99 |
| 1999-10-20 | 23.56 |
| 1999-10-21 | 23.02 |
| 1999-10-22 | 22.75 |
| 1999-10-23 | 22.97 |
| 1999-10-25 | 21.85 |
| 1999-10-26 | 21.92 |
| 1999-10-27 | 21.84 |
| 1999-10-28 | 21.03 |
| 1999-10-29 | 20.28 |
| 1999-11-01 | 19.18 |
| 1999-11-02 | 20.24 |
| 1999-11-03 | 20.14 |
| 1999-11-04 | 20.3 |
| 1999-11-05 | 20.74 |
| 1999-11-07 | 20.82 |
| 1999-11-09 | 20.94 |
| 1999-11-10 | 21.29 |
| 1999-11-11 | 21.04 |
| 1999-11-12 | 20.98 |
| 1999-11-15 | 20.8 |
| 1999-11-16 | 20.79 |
| 1999-11-17 | 20.71 |
| 1999-11-18 | 20.79 |
| 1999-11-19 | 20.85 |
| 1999-11-22 | 21.08 |
| 1999-11-24 | 21.96 |
| 1999-11-25 | 22.1 |
| 1999-11-26 | 22.1 |
| 1999-11-29 | 22.16 |
| 1999-11-30 | 22.14 |
| 1999-12-01 | 22.36 |
| 1999-12-02 | 22.71 |
| 1999-12-03 | 22.9 |
| 1999-12-06 | 23.43 |
| 1999-12-07 | 23.63 |
| 1999-12-08 | 22.93 |
| 1999-12-09 | 23.17 |
| 1999-12-10 | 23.28 |
| 1999-12-13 | 23.31 |
| 1999-12-14 | 23.13 |
| 1999-12-15 | 23.03 |
| 1999-12-16 | 23.52 |
| 1999-12-17 | 23.62 |
| 1999-12-20 | 23.88 |
| 1999-12-21 | 23.93 |
| 1999-12-22 | 24.91 |
| 1999-12-23 | 25.01 |
| 1999-12-24 | 24.6 |
| 1999-12-27 | 24.05 |
| 1999-12-28 | 24.37 |
| 1999-12-29 | 24.89 |
| 1999-12-30 | 25.68 |
| 2000-01-03 | 27.52 |
| 2000-01-04 | 28.46 |
| 2000-01-05 | 27.78 |
| 2000-01-06 | 27.84 |
| 2000-01-07 | 27.2 |
| 2000-01-10 | 27.35 |
| 2000-01-11 | 26.36 |
| 2000-01-12 | 27.07 |
| 2000-01-13 | 26.76 |
| 2000-01-14 | 26.75 |
| 2000-01-17 | 26.9 |
| 2000-01-18 | 26.85 |
| 2000-01-19 | 27.45 |
| 2000-01-20 | 27.26 |
| 2000-01-21 | 27.83 |
| 2000-01-24 | 27.86 |
| 2000-01-25 | 27.88 |
| 2000-01-27 | 28.41 |
| 2000-01-28 | 28.89 |
| 2000-01-31 | 27.96 |
| 2000-02-01 | 28.36 |
| 2000-02-02 | 29.24 |
| 2000-02-03 | 29.91 |
| 2000-02-04 | 30.35 |
| 2000-02-07 | 30.56 |
| 2000-02-08 | 30.55 |
| 2000-02-09 | 31.19 |
| 2000-02-10 | 32.05 |
| 2000-02-11 | 32.76 |
| 2000-02-14 | 32.8 |
| 2000-02-15 | 32.75 |
| 2000-02-16 | 33.45 |
| 2000-02-17 | 34.67 |
| 2000-02-18 | 35.11 |
| 2000-02-21 | 36.24 |
| 2000-02-22 | 34.66 |
| 2000-02-23 | 37.21 |
| 2000-02-24 | 37.26 |
| 2000-02-25 | 35.93 |
| 2000-02-28 | 35.97 |
| 2000-02-29 | 34.31 |
| 2000-03-01 | 36.12 |
| 2000-03-02 | 36.58 |
| 2000-03-03 | 35.38 |
| 2000-03-06 | 35.86 |
| 2000-03-07 | 35.35 |
| 2000-03-08 | 35.21 |
| 2000-03-09 | 34 |
| 2000-03-10 | 33.41 |
| 2000-03-13 | 32.08 |
| 2000-03-14 | 31.61 |
| 2000-03-15 | 31.69 |
| 2000-03-16 | 30.65 |
| 2000-03-21 | 30.04 |
| 2000-03-22 | 30.84 |
| 2000-03-23 | 30.79 |
| 2000-03-24 | 31.48 |
| 2000-03-27 | 31.7 |
| 2000-03-28 | 32.02 |
| 2000-03-29 | 32.26 |
| 2000-03-30 | 31.39 |
| 2000-03-31 | 30.57 |
| 2000-04-03 | 29.76 |
| 2000-04-04 | 27.66 |
| 2000-04-05 | 27.61 |
| 2000-04-06 | 27.85 |
| 2000-04-07 | 29.69 |
| 2000-04-10 | 31.06 |
| 2000-04-11 | 31.32 |
| 2000-04-12 | 30.84 |
| 2000-04-13 | 29.47 |
| 2000-04-17 | 27.65 |
| 2000-04-18 | 26.76 |
| 2000-04-19 | 26.06 |
| 2000-04-20 | 25.95 |
| 2000-04-24 | 24.98 |
| 2000-04-25 | 24.63 |
| 2000-04-26 | 25.86 |
| 2000-04-27 | 25.13 |
| 2000-04-28 | 24.71 |
| 2000-05-02 | 23.03 |
| 2000-05-03 | 22.44 |
| 2000-05-04 | 23.66 |
| 2000-05-05 | 24.67 |
| 2000-05-08 | 23.58 |
| 2000-05-09 | 24.08 |
| 2000-05-10 | 23.59 |
| 2000-05-11 | 22.39 |
| 2000-05-12 | 21.54 |
| 2000-05-15 | 21.76 |
| 2000-05-16 | 21.83 |
| 2000-05-17 | 21.98 |
| 2000-05-18 | 21.75 |
| 2000-05-19 | 21.26 |
| 2000-05-22 | 20.4 |
| 2000-05-23 | 20.44 |
| 2000-05-24 | 21.74 |
| 2000-05-25 | 21.95 |
| 2000-05-26 | 22.04 |
| 2000-05-29 | 22.54 |
| 2000-05-30 | 23.35 |
| 2000-05-31 | 24.03 |
| 2000-06-01 | 23.57 |
| 2000-06-02 | 24.31 |
| 2000-06-05 | 24.86 |
| 2000-06-06 | 25.34 |
| 2000-06-07 | 25.52 |
| 2000-06-08 | 26.11 |
| 2000-06-09 | 25.99 |
| 2000-06-12 | 25.57 |
| 2000-06-13 | 25.52 |
| 2000-06-14 | 25.82 |
| 2000-06-15 | 26.07 |
| 2000-06-16 | 26.81 |
| 2000-06-19 | 27.24 |
| 2000-06-20 | 27.55 |
| 2000-06-21 | 26.75 |
| 2000-06-22 | 26.35 |
| 2000-06-23 | 25.81 |
| 2000-06-26 | 25.7 |
| 2000-06-27 | 25.62 |
| 2000-06-28 | 25.98 |
| 2000-06-29 | 26.14 |
| 2000-06-30 | 25.99 |
| 2000-07-03 | 26.53 |
| 2000-07-04 | 26.74 |
| 2000-07-05 | 26.87 |
| 2000-07-06 | 26.67 |
| 2000-07-07 | 26.57 |
| 2000-07-10 | 26.42 |
| 2000-07-11 | 26.31 |
| 2000-07-12 | 27.03 |
| 2000-07-13 | 26.59 |
| 2000-07-14 | 26.44 |
| 2000-07-17 | 25.97 |
| 2000-07-18 | 25.7 |
| 2000-07-19 | 25.23 |
| 2000-07-20 | 25.02 |
| 2000-07-21 | 24.51 |
| 2000-07-24 | 22.89 |
| 2000-07-25 | 23.83 |
| 2000-07-26 | 23.1 |
| 2000-07-27 | 23.57 |
| 2000-07-28 | 23.5 |
| 2000-07-31 | 23.36 |
| 2000-08-01 | 23.17 |
| 2000-08-02 | 23.26 |
| 2000-08-03 | 22.95 |
| 2000-08-04 | 22.52 |
| 2000-08-07 | 22.43 |
| 2000-08-08 | 23.09 |
| 2000-08-09 | 23.3 |
| 2000-08-10 | 22.89 |
| 2000-08-11 | 22.67 |
| 2000-08-14 | 22.8 |
| 2000-08-16 | 23.48 |
| 2000-08-17 | 23.31 |
| 2000-08-18 | 23.67 |
| 2000-08-21 | 23.99 |
| 2000-08-22 | 24.18 |
| 2000-08-23 | 24.16 |
| 2000-08-24 | 24.53 |
| 2000-08-25 | 24.57 |
| 2000-08-28 | 24.39 |
| 2000-08-29 | 24.44 |
| 2000-08-30 | 24.67 |
| 2000-08-31 | 24.99 |
| 2000-09-04 | 25.42 |
| 2000-09-05 | 25.43 |
| 2000-09-06 | 25.63 |
| 2000-09-07 | 25.71 |
| 2000-09-08 | 25.9 |
| 2000-09-11 | 25.87 |
| 2000-09-12 | 26.01 |
| 2000-09-13 | 25.83 |
| 2000-09-14 | 25.66 |
| 2000-09-15 | 24.88 |
| 2000-09-18 | 23.75 |
| 2000-09-19 | 23.2 |
| 2000-09-20 | 23.62 |
| 2000-09-21 | 23.2 |
| 2000-09-22 | 22.07 |
| 2000-09-25 | 22.97 |
| 2000-09-26 | 22.43 |
| 2000-09-27 | 22.75 |
| 2000-09-28 | 22.28 |
| 2000-09-29 | 22.34 |
| 2000-10-03 | 22.38 |
| 2000-10-04 | 22.6 |
| 2000-10-05 | 22.32 |
| 2000-10-06 | 22.27 |
| 2000-10-09 | 21.85 |
| 2000-10-10 | 21.25 |
| 2000-10-11 | 20.7 |
| 2000-10-12 | 20.87 |
| 2000-10-13 | 20.28 |
| 2000-10-16 | 20.34 |
| 2000-10-17 | 19.91 |
| 2000-10-18 | 19.52 |
| 2000-10-19 | 20.3 |
| 2000-10-20 | 20.38 |
| 2000-10-23 | 19.76 |
| 2000-10-24 | 19.92 |
| 2000-10-25 | 20.54 |
| 2000-10-26 | 20.63 |
| 2000-10-27 | 20.61 |
| 2000-10-30 | 20.33 |
| 2000-10-31 | 20.54 |
| 2000-11-01 | 20.91 |
| 2000-11-02 | 21.22 |
| 2000-11-03 | 21.53 |
| 2000-11-06 | 21.48 |
| 2000-11-07 | 21.6 |
| 2000-11-08 | 22.04 |
| 2000-11-09 | 22 |
| 2000-11-10 | 21.53 |
| 2000-11-13 | 20.82 |
| 2000-11-14 | 21.49 |
| 2000-11-15 | 21.63 |
| 2000-11-16 | 21.52 |
| 2000-11-17 | 21.56 |
| 2000-11-20 | 21.71 |
| 2000-11-21 | 21.73 |
| 2000-11-22 | 21.45 |
| 2000-11-23 | 21.46 |
| 2000-11-24 | 21.61 |
| 2000-11-27 | 22.19 |
| 2000-11-28 | 22.35 |
| 2000-11-29 | 22.5 |
| 2000-11-30 | 22.4 |
| 2000-12-01 | 22.78 |
| 2000-12-04 | 22.72 |
| 2000-12-05 | 23.04 |
| 2000-12-06 | 23.23 |
| 2000-12-07 | 23.35 |
| 2000-12-08 | 23.69 |
| 2000-12-11 | 24.02 |
| 2000-12-12 | 24.03 |
| 2000-12-13 | 24.35 |
| 2000-12-14 | 24.07 |
| 2000-12-15 | 23.22 |
| 2000-12-18 | 23.3 |
| 2000-12-19 | 23 |
| 2000-12-20 | 22.75 |
| 2000-12-21 | 22.44 |
| 2000-12-22 | 18.96 |
| 2000-12-26 | 18.42 |
| 2000-12-27 | 18.87 |
| 2000-12-28 | 19.14 |
| 2000-12-29 | 19.43 |
| 2001-01-01 | 19.32 |
| 2001-01-02 | 19.63 |
| 2001-01-03 | 19.78 |
| 2001-01-04 | 20.16 |
| 2001-01-05 | 20.5 |
| 2001-01-08 | 20.02 |
| 2001-01-09 | 20.11 |
| 2001-01-10 | 19.85 |
| 2001-01-11 | 19.58 |
| 2001-01-12 | 19.69 |
| 2001-01-15 | 19.66 |
| 2001-01-16 | 19.7 |
| 2001-01-17 | 19.76 |
| 2001-01-18 | 19.97 |
| 2001-01-19 | 20.51 |
| 2001-01-22 | 20.68 |
| 2001-01-23 | 20.73 |
| 2001-01-24 | 20.97 |
| 2001-01-25 | 20.98 |
| 2001-01-29 | 20.44 |
| 2001-01-30 | 21.02 |
| 2001-01-31 | 20.89 |
| 2001-02-01 | 20.57 |
| 2001-02-02 | 20.97 |
| 2001-02-05 | 21.1 |
| 2001-02-06 | 21.22 |
| 2001-02-07 | 21.08 |
| 2001-02-08 | 21.49 |
| 2001-02-09 | 21.66 |
| 2001-02-12 | 21.72 |
| 2001-02-13 | 21.48 |
| 2001-02-14 | 21.54 |
| 2001-02-15 | 21.82 |
| 2001-02-16 | 21.2 |
| 2001-02-19 | 21.27 |
| 2001-02-20 | 21.21 |
| 2001-02-21 | 20.97 |
| 2001-02-22 | 20.67 |
| 2001-02-23 | 20 |
| 2001-02-26 | 19.94 |
| 2001-02-27 | 19.52 |
| 2001-02-28 | 20.3 |
| 2001-03-01 | 20.29 |
| 2001-03-02 | 19.33 |
| 2001-03-05 | 18.77 |
| 2001-03-07 | 19.05 |
| 2001-03-08 | 18.98 |
| 2001-03-09 | 18.22 |
| 2001-03-12 | 17.15 |
| 2001-03-13 | 16 |
| 2001-03-14 | 16.72 |
| 2001-03-15 | 17.26 |
| 2001-03-16 | 16.91 |
| 2001-03-19 | 16.85 |
| 2001-03-20 | 16.61 |
| 2001-03-21 | 17.04 |
| 2001-03-22 | 16.66 |
| 2001-03-23 | 16.29 |
| 2001-03-26 | 16.29 |
| 2001-03-27 | 16.54 |
| 2001-03-28 | 16.98 |
| 2001-03-29 | 16.74 |
| 2001-03-30 | 16.12 |
| 2001-04-02 | 15.8 |
| 2001-04-03 | 15.97 |
| 2001-04-04 | 15.8 |
| 2001-04-06 | 15.71 |
| 2001-04-09 | 15.67 |
| 2001-04-10 | 15.31 |
| 2001-04-11 | 14.69 |
| 2001-04-12 | 14.18 |
| 2001-04-16 | 14.58 |
| 2001-04-17 | 14.95 |
| 2001-04-18 | 15.64 |
| 2001-04-19 | 16 |
| 2001-04-20 | 16.13 |
| 2001-04-23 | 16.14 |
| 2001-04-24 | 16.34 |
| 2001-04-25 | 16.55 |
| 2001-04-26 | 16.34 |
| 2001-04-27 | 15.61 |
| 2001-04-30 | 16.08 |
| 2001-05-02 | 16.23 |
| 2001-05-03 | 16.17 |
| 2001-05-04 | 16.34 |
| 2001-05-07 | 16.53 |
| 2001-05-08 | 16.78 |
| 2001-05-09 | 16.52 |
| 2001-05-10 | 16.5 |
| 2001-05-11 | 16.44 |
| 2001-05-14 | 16.43 |
| 2001-05-15 | 16.47 |
| 2001-05-16 | 16.58 |
| 2001-05-17 | 16.97 |
| 2001-05-18 | 16.95 |
| 2001-05-21 | 16.99 |
| 2001-05-22 | 17.11 |
| 2001-05-23 | 17.3 |
| 2001-05-24 | 17.3 |
| 2001-05-25 | 17.27 |
| 2001-05-28 | 17.53 |
| 2001-05-29 | 17.63 |
| 2001-05-30 | 17.23 |
| 2001-05-31 | 17.11 |
| 2001-06-01 | 16.87 |
| 2001-06-04 | 16.44 |
| 2001-06-05 | 16.26 |
| 2001-06-06 | 16.37 |
| 2001-06-07 | 16.34 |
| 2001-06-08 | 16.56 |
| 2001-06-11 | 16.56 |
| 2001-06-12 | 16.55 |
| 2001-06-13 | 16.6 |
| 2001-06-14 | 16.33 |
| 2001-06-15 | 15.97 |
| 2001-06-18 | 15.85 |
| 2001-06-19 | 16.03 |
| 2001-06-20 | 15.93 |
| 2001-06-21 | 15.53 |
| 2001-06-22 | 15.31 |
| 2001-06-25 | 14.8 |
| 2001-06-26 | 15.18 |
| 2001-06-27 | 15.23 |
| 2001-06-28 | 15.19 |
| 2001-06-29 | 15.36 |
| 2001-07-02 | 15.23 |
| 2001-07-03 | 14.84 |
| 2001-07-04 | 14.86 |
| 2001-07-05 | 14.8 |
| 2001-07-06 | 14.74 |
| 2001-07-09 | 14.63 |
| 2001-07-10 | 14.78 |
| 2001-07-11 | 14.96 |
| 2001-07-12 | 15.32 |
| 2001-07-13 | 15.22 |
| 2001-07-16 | 15.23 |
| 2001-07-17 | 15.19 |
| 2001-07-18 | 15.17 |
| 2001-07-19 | 15.05 |
| 2001-07-20 | 14.93 |
| 2001-07-23 | 14.84 |
| 2001-07-24 | 14.73 |
| 2001-07-25 | 14.56 |
| 2001-07-26 | 14.43 |
| 2001-07-27 | 14.43 |
| 2001-07-30 | 14.55 |
| 2001-07-31 | 14.76 |
| 2001-08-01 | 14.68 |
| 2001-08-02 | 14.77 |
| 2001-08-03 | 14.86 |
| 2001-08-06 | 14.87 |
| 2001-08-07 | 14.79 |
| 2001-08-08 | 14.74 |
| 2001-08-09 | 14.71 |
| 2001-08-10 | 14.75 |
| 2001-08-13 | 14.66 |
| 2001-08-14 | 14.84 |
| 2001-08-16 | 14.9 |
| 2001-08-17 | 14.76 |
| 2001-08-20 | 14.73 |
| 2001-08-21 | 14.73 |
| 2001-08-23 | 14.76 |
| 2001-08-24 | 14.82 |
| 2001-08-27 | 14.95 |
| 2001-08-28 | 14.92 |
| 2001-08-29 | 14.88 |
| 2001-08-30 | 14.87 |
| 2001-08-31 | 14.53 |
| 2001-09-03 | 14.43 |
| 2001-09-04 | 14.51 |
| 2001-09-05 | 14.35 |
| 2001-09-06 | 14.23 |
| 2001-09-07 | 14.25 |
| 2001-09-10 | 14.18 |
| 2001-09-11 | 14.14 |
| 2001-09-12 | 13.64 |
| 2001-09-13 | 13.46 |
| 2001-09-14 | 12.68 |
| 2001-09-17 | 11.8 |
| 2001-09-18 | 12.18 |
| 2001-09-19 | 12.23 |
| 2001-09-20 | 12.1 |
| 2001-09-21 | 11.58 |
| 2001-09-24 | 11.9 |
| 2001-09-25 | 11.75 |
| 2001-09-26 | 12 |
| 2001-09-27 | 12.06 |
| 2001-09-28 | 12.39 |
| 2001-10-01 | 12.3 |
| 2001-10-03 | 12.07 |
| 2001-10-04 | 12.28 |
| 2001-10-05 | 12.32 |
| 2001-10-08 | 12.13 |
| 2001-10-09 | 12.26 |
| 2001-10-10 | 12.6 |
| 2001-10-11 | 12.74 |
| 2001-10-12 | 12.81 |
| 2001-10-15 | 12.83 |
| 2001-10-16 | 13 |
| 2001-10-17 | 13.25 |
| 2001-10-18 | 13.02 |
| 2001-10-19 | 13.13 |
| 2001-10-22 | 13.2 |
| 2001-10-23 | 13.41 |
| 2001-10-24 | 13.39 |
| 2001-10-25 | 13.31 |
| 2001-10-29 | 13.29 |
| 2001-10-30 | 13.08 |
| 2001-10-31 | 13.18 |
| 2001-11-01 | 13.41 |
| 2001-11-02 | 13.41 |
| 2001-11-05 | 13.42 |
| 2001-11-06 | 13.63 |
| 2001-11-07 | 13.47 |
| 2001-11-08 | 13.61 |
| 2001-11-09 | 13.69 |
| 2001-11-12 | 13.79 |
| 2001-11-13 | 13.73 |
| 2001-11-14 | 13.86 |
| 2001-11-15 | 14.19 |
| 2001-11-19 | 14.62 |
| 2001-11-20 | 14.45 |
| 2001-11-21 | 14.61 |
| 2001-11-22 | 14.73 |
| 2001-11-23 | 14.67 |
| 2001-11-26 | 15.07 |
| 2001-11-27 | 15.04 |
| 2001-11-28 | 14.92 |
| 2001-11-29 | 14.9 |
| 2001-12-03 | 14.94 |
| 2001-12-04 | 15.23 |
| 2001-12-05 | 15.63 |
| 2001-12-06 | 15.62 |
| 2001-12-07 | 15.7 |
| 2001-12-10 | 15.69 |
| 2001-12-11 | 15.59 |
| 2001-12-12 | 15.63 |
| 2001-12-13 | 15.42 |
| 2001-12-14 | 15.3 |
| 2001-12-18 | 15.12 |
| 2001-12-19 | 14.82 |
| 2001-12-20 | 14.88 |
| 2001-12-21 | 14.65 |
| 2001-12-24 | 14.74 |
| 2001-12-26 | 14.42 |
| 2001-12-27 | 14.15 |
| 2001-12-28 | 14.44 |
| 2001-12-31 | 14.82 |
| 2002-01-01 | 14.78 |
| 2002-01-02 | 14.9 |
| 2002-01-03 | 15.08 |
| 2002-01-04 | 15.39 |
| 2002-01-07 | 15.47 |
| 2002-01-08 | 15.57 |
| 2002-01-09 | 15.34 |
| 2002-01-10 | 15.19 |
| 2002-01-11 | 15.02 |
| 2002-01-14 | 15.38 |
| 2002-01-15 | 15.25 |
| 2002-01-16 | 15.29 |
| 2002-01-17 | 15.49 |
| 2002-01-18 | 15.28 |
| 2002-01-21 | 15.33 |
| 2002-01-22 | 15.31 |
| 2002-01-23 | 15.28 |
| 2002-01-24 | 15.21 |
| 2002-01-25 | 15.16 |
| 2002-01-28 | 15.05 |
| 2002-01-29 | 15.11 |
| 2002-01-30 | 15.03 |
| 2002-01-31 | 15.18 |
| 2002-02-01 | 15.28 |
| 2002-02-04 | 13.79 |
| 2002-02-05 | 13.75 |
| 2002-02-06 | 14.31 |
| 2002-02-07 | 14.18 |
| 2002-02-08 | 14.41 |
| 2002-02-11 | 14.54 |
| 2002-02-12 | 14.56 |
| 2002-02-13 | 14.62 |
| 2002-02-14 | 14.84 |
| 2002-02-15 | 14.98 |
| 2002-02-18 | 15.15 |
| 2002-02-19 | 14.95 |
| 2002-02-20 | 14.79 |
| 2002-02-21 | 14.88 |
| 2002-02-22 | 15.04 |
| 2002-02-25 | 15.08 |
| 2002-02-26 | 15.39 |
| 2002-02-27 | 15.3 |
| 2002-02-28 | 14.65 |
| 2002-03-01 | 15.08 |
| 2002-03-04 | 15.21 |
| 2002-03-05 | 15.23 |
| 2002-03-06 | 15.17 |
| 2002-03-07 | 15.4 |
| 2002-03-08 | 15.34 |
| 2002-03-11 | 15.12 |
| 2002-03-12 | 14.89 |
| 2002-03-13 | 14.99 |
| 2002-03-14 | 15.04 |
| 2002-03-15 | 15.2 |
| 2002-03-18 | 15.25 |
| 2002-03-19 | 15.01 |
| 2002-03-20 | 15.04 |
| 2002-03-21 | 14.93 |
| 2002-03-22 | 14.86 |
| 2002-03-26 | 14.71 |
| 2002-03-27 | 14.72 |
| 2002-03-28 | 14.82 |
| 2002-04-01 | 14.73 |
| 2002-04-02 | 14.69 |
| 2002-04-03 | 14.27 |
| 2002-04-04 | 14.52 |
| 2002-04-05 | 14.55 |
| 2002-04-08 | 14.49 |
| 2002-04-09 | 14.42 |
| 2002-04-10 | 14.58 |
| 2002-04-11 | 14.69 |
| 2002-04-12 | 14.74 |
| 2002-04-15 | 14.57 |
| 2002-04-16 | 14.43 |
| 2002-04-17 | 14.5 |
| 2002-04-18 | 14.56 |
| 2002-04-19 | 14.22 |
| 2002-04-22 | 14.24 |
| 2002-04-23 | 14.14 |
| 2002-04-24 | 14.21 |
| 2002-04-25 | 14.04 |
| 2002-04-26 | 14.04 |
| 2002-04-29 | 13.85 |
| 2002-04-30 | 14.03 |
| 2002-05-02 | 14.15 |
| 2002-05-03 | 14.16 |
| 2002-05-06 | 14.26 |
| 2002-05-07 | 14.35 |
| 2002-05-08 | 14.42 |
| 2002-05-09 | 14.54 |
| 2002-05-10 | 14.39 |
| 2002-05-13 | 14.44 |
| 2002-05-14 | 14.43 |
| 2002-05-15 | 14.27 |
| 2002-05-16 | 14.11 |
| 2002-05-17 | 14.03 |
| 2002-05-20 | 13.79 |
| 2002-05-21 | 13.39 |
| 2002-05-22 | 13.43 |
| 2002-05-23 | 13.28 |
| 2002-05-24 | 13.87 |
| 2002-05-27 | 13.9 |
| 2002-05-28 | 13.52 |
| 2002-05-29 | 13.62 |
| 2002-05-30 | 13.51 |
| 2002-05-31 | 13.62 |
| 2002-06-03 | 13.83 |
| 2002-06-04 | 13.97 |
| 2002-06-05 | 14.2 |
| 2002-06-06 | 13.46 |
| 2002-06-07 | 13.22 |
| 2002-06-10 | 13.5 |
| 2002-06-11 | 13.89 |
| 2002-06-12 | 13.89 |
| 2002-06-13 | 13.82 |
| 2002-06-14 | 13.86 |
| 2002-06-17 | 13.93 |
| 2002-06-18 | 13.77 |
| 2002-06-19 | 13.59 |
| 2002-06-20 | 13.66 |
| 2002-06-21 | 13.57 |
| 2002-06-24 | 13.55 |
| 2002-06-25 | 13.5 |
| 2002-06-26 | 13.32 |
| 2002-06-27 | 13.43 |
| 2002-06-28 | 13.54 |
| 2002-07-01 | 13.73 |
| 2002-07-02 | 13.71 |
| 2002-07-03 | 13.75 |
| 2002-07-04 | 13.82 |
| 2002-07-05 | 13.86 |
| 2002-07-08 | 13.96 |
| 2002-07-09 | 13.42 |
| 2002-07-10 | 13.29 |
| 2002-07-11 | 13.13 |
| 2002-07-12 | 13.21 |
| 2002-07-15 | 13.17 |
| 2002-07-16 | 12.98 |
| 2002-07-17 | 12.85 |
| 2002-07-18 | 13.04 |
| 2002-07-19 | 12.97 |
| 2002-07-22 | 12.63 |
| 2002-07-23 | 12.79 |
| 2002-07-24 | 12.57 |
| 2002-07-25 | 12.55 |
| 2002-07-26 | 12.22 |
| 2002-07-29 | 12.1 |
| 2002-07-30 | 11.93 |
| 2002-07-31 | 11.92 |
| 2002-08-01 | 11.92 |
| 2002-08-02 | 11.94 |
| 2002-08-05 | 12.04 |
| 2002-08-06 | 12.09 |
| 2002-08-07 | 12.12 |
| 2002-08-08 | 11.91 |
| 2002-08-09 | 12 |
| 2002-08-12 | 12.1 |
| 2002-08-13 | 12.17 |
| 2002-08-14 | 12.15 |
| 2002-08-16 | 12.25 |
| 2002-08-19 | 12.28 |
| 2002-08-20 | 12.38 |
| 2002-08-21 | 12.4 |
| 2002-08-22 | 12.32 |
| 2002-08-23 | 12.39 |
| 2002-08-26 | 12.45 |
| 2002-08-27 | 12.32 |
| 2002-08-28 | 12.31 |
| 2002-08-29 | 12.24 |
| 2002-08-30 | 12.43 |
| 2002-09-02 | 12.47 |
| 2002-09-03 | 12.4 |
| 2002-09-04 | 12.45 |
| 2002-09-05 | 12.46 |
| 2002-09-06 | 12.31 |
| 2002-09-09 | 12.15 |
| 2002-09-11 | 12.12 |
| 2002-09-12 | 12.17 |
| 2002-09-13 | 12.07 |
| 2002-09-16 | 11.96 |
| 2002-09-17 | 12.02 |
| 2002-09-18 | 11.91 |
| 2002-09-19 | 11.89 |
| 2002-09-20 | 11.86 |
| 2002-09-23 | 11.85 |
| 2002-09-24 | 11.79 |
| 2002-09-25 | 11.84 |
| 2002-09-26 | 11.85 |
| 2002-09-27 | 11.91 |
| 2002-09-30 | 11.73 |
| 2002-10-01 | 11.63 |
| 2002-10-03 | 11.6 |
| 2002-10-04 | 11.6 |
| 2002-10-07 | 11.78 |
| 2002-10-08 | 11.84 |
| 2002-10-09 | 11.77 |
| 2002-10-10 | 12.02 |
| 2002-10-11 | 12.23 |
| 2002-10-14 | 12.21 |
| 2002-10-16 | 12.18 |
| 2002-10-17 | 12.18 |
| 2002-10-18 | 12.24 |
| 2002-10-21 | 12.19 |
| 2002-10-22 | 12 |
| 2002-10-23 | 11.94 |
| 2002-10-24 | 11.84 |
| 2002-10-25 | 11.68 |
| 2002-10-28 | 11.6 |
| 2002-10-29 | 11.77 |
| 2002-10-30 | 11.82 |
| 2002-10-31 | 11.96 |
| 2002-11-01 | 12.01 |
| 2002-11-04 | 12.11 |
| 2002-11-05 | 12.07 |
| 2002-11-07 | 12.05 |
| 2002-11-08 | 12.03 |
| 2002-11-11 | 11.97 |
| 2002-11-12 | 12.02 |
| 2002-11-13 | 12.05 |
| 2002-11-14 | 12.04 |
| 2002-11-15 | 12.18 |
| 2002-11-18 | 12.28 |
| 2002-11-20 | 12.26 |
| 2002-11-21 | 12.29 |
| 2002-11-22 | 12.41 |
| 2002-11-25 | 12.52 |
| 2002-11-26 | 12.62 |
| 2002-11-27 | 12.58 |
| 2002-11-28 | 12.73 |
| 2002-11-29 | 12.8 |
| 2002-12-02 | 13.75 |
| 2002-12-03 | 13.56 |
| 2002-12-04 | 13.37 |
| 2002-12-05 | 13.49 |
| 2002-12-06 | 13.83 |
| 2002-12-09 | 13.64 |
| 2002-12-10 | 13.68 |
| 2002-12-11 | 13.74 |
| 2002-12-12 | 13.81 |
| 2002-12-13 | 13.94 |
| 2002-12-16 | 13.86 |
| 2002-12-17 | 13.78 |
| 2002-12-18 | 13.84 |
| 2002-12-19 | 13.81 |
| 2002-12-20 | 13.86 |
| 2002-12-23 | 13.83 |
| 2002-12-24 | 13.91 |
| 2002-12-26 | 14.01 |
| 2002-12-27 | 14.05 |
| 2002-12-30 | 13.99 |
| 2002-12-31 | 14.02 |
| 2003-01-01 | 14.1 |
| 2003-01-02 | 14.08 |
| 2003-01-03 | 14.04 |
| 2003-01-06 | 13.99 |
| 2003-01-07 | 13.99 |
| 2003-01-08 | 14.06 |
| 2003-01-09 | 14.22 |
| 2003-01-10 | 14.02 |
| 2003-01-13 | 13.96 |
| 2003-01-14 | 14.01 |
| 2003-01-15 | 14.08 |
| 2003-01-16 | 14.14 |
| 2003-01-17 | 14.16 |
| 2003-01-20 | 14.07 |
| 2003-01-21 | 14.1 |
| 2003-01-22 | 14.12 |
| 2003-01-23 | 14.01 |
| 2003-01-24 | 13.79 |
| 2003-01-27 | 13.51 |
| 2003-01-28 | 13.63 |
| 2003-01-29 | 13.6 |
| 2003-01-30 | 13.56 |
| 2003-01-31 | 13.58 |
| 2003-02-03 | 13.72 |
| 2003-02-04 | 13.73 |
| 2003-02-05 | 13.66 |
| 2003-02-06 | 13.83 |
| 2003-02-07 | 13.77 |
| 2003-02-10 | 13.63 |
| 2003-02-11 | 13.61 |
| 2003-02-12 | 13.55 |
| 2003-02-14 | 13.43 |
| 2003-02-17 | 13.72 |
| 2003-02-18 | 13.75 |
| 2003-02-19 | 13.82 |
| 2003-02-20 | 13.83 |
| 2003-02-21 | 13.84 |
| 2003-02-24 | 13.89 |
| 2003-02-25 | 13.73 |
| 2003-02-26 | 13.66 |
| 2003-02-27 | 13.75 |
| 2003-02-28 | 13.82 |
| 2003-03-03 | 13.82 |
| 2003-03-04 | 13.66 |
| 2003-03-05 | 13.67 |
| 2003-03-06 | 13.55 |
| 2003-03-07 | 13.34 |
| 2003-03-10 | 13.2 |
| 2003-03-11 | 13.28 |
| 2003-03-12 | 13.16 |
| 2003-03-13 | 13.13 |
| 2003-03-17 | 13.25 |
| 2003-03-19 | 13.33 |
| 2003-03-20 | 13.53 |
| 2003-03-21 | 13.62 |
| 2003-03-22 | 13.68 |
| 2003-03-24 | 13.43 |
| 2003-03-25 | 13.4 |
| 2003-03-26 | 13.41 |
| 2003-03-27 | 13.19 |
| 2003-03-28 | 13.16 |
| 2003-03-31 | 12.89 |
| 2003-04-01 | 12.91 |
| 2003-04-02 | 13.11 |
| 2003-04-03 | 13.26 |
| 2003-04-04 | 13.38 |
| 2003-04-07 | 13.65 |
| 2003-04-08 | 13.54 |
| 2003-04-09 | 13.4 |
| 2003-04-10 | 12.95 |
| 2003-04-11 | 12.86 |
| 2003-04-15 | 12.88 |
| 2003-04-16 | 12.95 |
| 2003-04-17 | 12.77 |
| 2003-04-21 | 12.88 |
| 2003-04-22 | 12.85 |
| 2003-04-23 | 12.75 |
| 2003-04-24 | 12.71 |
| 2003-04-25 | 12.65 |
| 2003-04-28 | 12.75 |
| 2003-04-29 | 12.75 |
| 2003-04-30 | 12.8 |
| 2003-05-02 | 12.9 |
| 2003-05-05 | 13.07 |
| 2003-05-06 | 13.16 |
| 2003-05-07 | 13.16 |
| 2003-05-08 | 13.05 |
| 2003-05-09 | 13.04 |
| 2003-05-12 | 13.14 |
| 2003-05-13 | 13.26 |
| 2003-05-14 | 13.4 |
| 2003-05-15 | 13.58 |
| 2003-05-16 | 13.77 |
| 2003-05-19 | 13.68 |
| 2003-05-20 | 13.84 |
| 2003-05-21 | 13.91 |
| 2003-05-22 | 13.97 |
| 2003-05-23 | 14.12 |
| 2003-05-26 | 14.4 |
| 2003-05-27 | 14.3 |
| 2003-05-28 | 14.44 |
| 2003-05-29 | 14.6 |
| 2003-05-30 | 14.82 |
| 2003-06-02 | 14.89 |
| 2003-06-03 | 14.91 |
| 2003-06-04 | 15.13 |
| 2003-06-05 | 15.16 |
| 2003-06-06 | 15.26 |
| 2003-06-09 | 15.34 |
| 2003-06-10 | 15.07 |
| 2003-06-11 | 15.2 |
| 2003-06-12 | 15.35 |
| 2003-06-13 | 15.43 |
| 2003-06-16 | 14.89 |
| 2003-06-17 | 15.04 |
| 2003-06-18 | 15.14 |
| 2003-06-19 | 15.23 |
| 2003-06-20 | 15.33 |
| 2003-06-23 | 15.14 |
| 2003-06-24 | 15.16 |
| 2003-06-25 | 15.4 |
| 2003-06-26 | 15.46 |
| 2003-06-27 | 15.6 |
| 2003-06-30 | 15.71 |
| 2003-07-01 | 15.7 |
| 2003-07-02 | 15.78 |
| 2003-07-03 | 15.94 |
| 2003-07-04 | 15.97 |
| 2003-07-07 | 16.09 |
| 2003-07-08 | 16.04 |
| 2003-07-09 | 15.9 |
| 2003-07-10 | 16.08 |
| 2003-07-11 | 16.09 |
| 2003-07-14 | 16.25 |
| 2003-07-15 | 16.08 |
| 2003-07-16 | 15.02 |
| 2003-07-17 | 14.82 |
| 2003-07-18 | 14.66 |
| 2003-07-21 | 14.39 |
| 2003-07-22 | 14.27 |
| 2003-07-23 | 14.37 |
| 2003-07-24 | 14.62 |
| 2003-07-25 | 14.9 |
| 2003-07-28 | 14.99 |
| 2003-07-29 | 15.03 |
| 2003-07-30 | 15.22 |
| 2003-07-31 | 15.23 |
| 2003-08-01 | 15.34 |
| 2003-08-04 | 15.53 |
| 2003-08-05 | 15.31 |
| 2003-08-06 | 15.22 |
| 2003-08-07 | 15.59 |
| 2003-08-08 | 15.93 |
| 2003-08-11 | 16.1 |
| 2003-08-12 | 16.06 |
| 2003-08-13 | 16.26 |
| 2003-08-14 | 16.24 |
| 2003-08-18 | 16.61 |
| 2003-08-19 | 16.5 |
| 2003-08-20 | 16.61 |
| 2003-08-21 | 16.8 |
| 2003-08-22 | 16.98 |
| 2003-08-25 | 16.45 |
| 2003-08-26 | 17.12 |
| 2003-08-27 | 17.5 |
| 2003-08-28 | 17.51 |
| 2003-08-29 | 17.74 |
| 2003-09-01 | 18.09 |
| 2003-09-02 | 18.13 |
| 2003-09-03 | 17.77 |
| 2003-09-04 | 17.9 |
| 2003-09-05 | 18.18 |
| 2003-09-08 | 15.97 |
| 2003-09-09 | 15.88 |
| 2003-09-10 | 15.97 |
| 2003-09-11 | 15.95 |
| 2003-09-12 | 15.6 |
| 2003-09-15 | 15.01 |
| 2003-09-16 | 15.33 |
| 2003-09-17 | 15.05 |
| 2003-09-18 | 14.55 |
| 2003-09-19 | 14.67 |
| 2003-09-22 | 14.49 |
| 2003-09-23 | 14.81 |
| 2003-09-24 | 15.26 |
| 2003-09-25 | 15.17 |
| 2003-09-26 | 15.46 |
| 2003-09-29 | 15.73 |
| 2003-09-30 | 15.9 |
| 2003-10-01 | 15.95 |
| 2003-10-03 | 16.21 |
| 2003-10-06 | 16.59 |
| 2003-10-07 | 16.53 |
| 2003-10-08 | 16.57 |
| 2003-10-09 | 16.81 |
| 2003-10-10 | 16.87 |
| 2003-10-13 | 17.19 |
| 2003-10-14 | 16.84 |
| 2003-10-15 | 16.97 |
| 2003-10-16 | 17.14 |
| 2003-10-17 | 17.26 |
| 2003-10-20 | 16.92 |
| 2003-10-21 | 16.53 |
| 2003-10-22 | 16.34 |
| 2003-10-23 | 16.15 |
| 2003-10-24 | 16.5 |
| 2003-10-25 | 16.75 |
| 2003-10-27 | 16.4 |
| 2003-10-28 | 16.31 |
| 2003-10-29 | 16.42 |
| 2003-10-30 | 16.57 |
| 2003-10-31 | 17.03 |
| 2003-11-03 | 14.4 |
| 2003-11-04 | 14.57 |
| 2003-11-05 | 14.59 |
| 2003-11-06 | 14.69 |
| 2003-11-07 | 14.6 |
| 2003-11-10 | 14.72 |
| 2003-11-11 | 14.85 |
| 2003-11-12 | 14.91 |
| 2003-11-13 | 14.63 |
| 2003-11-14 | 14.33 |
| 2003-11-15 | 14.46 |
| 2003-11-17 | 14.63 |
| 2003-11-18 | 14.52 |
| 2003-11-19 | 14.32 |
| 2003-11-20 | 14.12 |
| 2003-11-21 | 14.2 |
| 2003-11-24 | 14.29 |
| 2003-11-25 | 14.52 |
| 2003-11-27 | 14.74 |
| 2003-11-28 | 14.92 |
| 2003-12-01 | 15.24 |
| 2003-12-02 | 15.27 |
| 2003-12-03 | 15.43 |
| 2003-12-04 | 15.53 |
| 2003-12-05 | 15.32 |
| 2003-12-08 | 15.42 |
| 2003-12-09 | 15.76 |
| 2003-12-10 | 15.87 |
| 2003-12-11 | 15.98 |
| 2003-12-12 | 16.03 |
| 2003-12-15 | 16.21 |
| 2003-12-16 | 16.24 |
| 2003-12-17 | 16.25 |
| 2003-12-18 | 16.57 |
| 2003-12-19 | 16.83 |
| 2003-12-22 | 17.02 |
| 2003-12-23 | 16.91 |
| 2003-12-24 | 17.12 |
| 2003-12-26 | 17.37 |
| 2003-12-29 | 17.71 |
| 2003-12-30 | 17.7 |
| 2003-12-31 | 17.78 |
| 2004-01-02 | 18.63 |
| 2004-01-05 | 18.71 |
| 2004-01-06 | 18.38 |
| 2004-01-07 | 18.29 |
| 2004-01-08 | 18.91 |
| 2004-01-09 | 18.88 |
| 2004-01-12 | 18.59 |
| 2004-01-13 | 18.63 |
| 2004-01-14 | 18.77 |
| 2004-01-15 | 18.5 |
| 2004-01-16 | 18.01 |
| 2004-01-19 | 18.26 |
| 2004-01-20 | 17.91 |
| 2004-01-21 | 16.98 |
| 2004-01-22 | 16.49 |
| 2004-01-23 | 17.31 |
| 2004-01-27 | 17.93 |
| 2004-01-28 | 17.52 |
| 2004-01-29 | 17.37 |
| 2004-01-30 | 16.95 |
| 2004-02-03 | 16.31 |
| 2004-02-04 | 16.79 |
| 2004-02-05 | 16.7 |
| 2004-02-06 | 17.04 |
| 2004-02-09 | 17.45 |
| 2004-02-10 | 17.45 |
| 2004-02-11 | 17.58 |
| 2004-02-12 | 17.57 |
| 2004-02-13 | 17.82 |
| 2004-02-16 | 17.87 |
| 2004-02-17 | 17.89 |
| 2004-02-18 | 17.97 |
| 2004-02-19 | 17.48 |
| 2004-02-20 | 17.4 |
| 2004-02-23 | 16.96 |
| 2004-02-24 | 17.01 |
| 2004-02-25 | 16.66 |
| 2004-02-26 | 16.53 |
| 2004-02-27 | 16.8 |
| 2004-03-01 | 17.5 |
| 2004-03-03 | 17.54 |
| 2004-03-04 | 17.45 |
| 2004-03-05 | 17.77 |
| 2004-03-08 | 18.11 |
| 2004-03-09 | 17.91 |
| 2004-03-10 | 17.74 |
| 2004-03-11 | 17.41 |
| 2004-03-12 | 17.4 |
| 2004-03-15 | 16.86 |
| 2004-03-16 | 16.79 |
| 2004-03-17 | 16.88 |
| 2004-03-18 | 16.62 |
| 2004-03-19 | 16.67 |
| 2004-03-22 | 16.25 |
| 2004-03-23 | 16.25 |
| 2004-03-24 | 16.26 |
| 2004-03-25 | 16.4 |
| 2004-03-26 | 16.78 |
| 2004-03-29 | 16.95 |
| 2004-03-30 | 16.93 |
| 2004-03-31 | 17.12 |
| 2004-04-01 | 17.53 |
| 2004-04-02 | 17.79 |
| 2004-04-05 | 17.91 |
| 2004-04-06 | 17.83 |
| 2004-04-07 | 17.82 |
| 2004-04-08 | 18 |
| 2004-04-12 | 17.93 |
| 2004-04-13 | 18.29 |
| 2004-04-15 | 18.26 |
| 2004-04-16 | 18.36 |
| 2004-04-17 | 18.41 |
| 2004-04-19 | 18.13 |
| 2004-04-20 | 18.11 |
| 2004-04-21 | 18.41 |
| 2004-04-22 | 18.63 |
| 2004-04-23 | 18.72 |
| 2004-04-27 | 17.92 |
| 2004-04-28 | 17.89 |
| 2004-04-29 | 17.88 |
| 2004-04-30 | 17.75 |
| 2004-05-03 | 17.43 |
| 2004-05-04 | 17.75 |
| 2004-05-05 | 17.91 |
| 2004-05-06 | 18.18 |
| 2004-05-07 | 17.93 |
| 2004-05-10 | 17.59 |
| 2004-05-11 | 16.81 |
| 2004-05-12 | 16.94 |
| 2004-05-13 | 16.92 |
| 2004-05-14 | 15.43 |
| 2004-05-17 | 13.57 |
| 2004-05-18 | 14.65 |
| 2004-05-19 | 15.4 |
| 2004-05-21 | 15.34 |
| 2004-05-24 | 15.69 |
| 2004-05-25 | 15.67 |
| 2004-05-26 | 15.67 |
| 2004-05-27 | 15.52 |
| 2004-05-28 | 14.76 |
| 2004-05-31 | 14.4 |
| 2004-06-01 | 14.65 |
| 2004-06-02 | 14.91 |
| 2004-06-03 | 14.28 |
| 2004-06-04 | 14.48 |
| 2004-06-07 | 14.67 |
| 2004-06-08 | 14.75 |
| 2004-06-09 | 14.79 |
| 2004-06-10 | 14.78 |
| 2004-06-11 | 14.46 |
| 2004-06-14 | 14.15 |
| 2004-06-15 | 14.33 |
| 2004-06-16 | 14.28 |
| 2004-06-17 | 14.4 |
| 2004-06-18 | 14.24 |
| 2004-06-21 | 14.13 |
| 2004-06-22 | 14.04 |
| 2004-06-23 | 13.73 |
| 2004-06-24 | 13.9 |
| 2004-06-25 | 14.11 |
| 2004-06-28 | 14.4 |
| 2004-06-29 | 14.46 |
| 2004-06-30 | 14.37 |
| 2004-07-01 | 14.64 |
| 2004-07-02 | 14.64 |
| 2004-07-05 | 14.52 |
| 2004-07-06 | 14.76 |
| 2004-07-07 | 14.84 |
| 2004-07-08 | 14.37 |
| 2004-07-09 | 14.67 |
| 2004-07-12 | 14.74 |
| 2004-07-13 | 14.6 |
| 2004-07-14 | 14.49 |
| 2004-07-15 | 14.67 |
| 2004-07-16 | 14.9 |
| 2004-07-19 | 15.03 |
| 2004-07-20 | 14.97 |
| 2004-07-21 | 15.12 |
| 2004-07-22 | 15.28 |
| 2004-07-23 | 15.32 |
| 2004-07-26 | 15.5 |
| 2004-07-27 | 15.32 |
| 2004-07-28 | 15.25 |
| 2004-07-29 | 15.48 |
| 2004-07-30 | 15.6 |
| 2004-08-02 | 13.85 |
| 2004-08-03 | 13.79 |
| 2004-08-04 | 13.78 |
| 2004-08-05 | 14.02 |
| 2004-08-06 | 13.85 |
| 2004-08-09 | 13.91 |
| 2004-08-10 | 13.98 |
| 2004-08-11 | 13.73 |
| 2004-08-12 | 13.61 |
| 2004-08-13 | 13.58 |
| 2004-08-16 | 13.57 |
| 2004-08-17 | 13.63 |
| 2004-08-18 | 13.48 |
| 2004-08-19 | 13.67 |
| 2004-08-20 | 13.54 |
| 2004-08-23 | 13.41 |
| 2004-08-24 | 13.53 |
| 2004-08-25 | 13.58 |
| 2004-08-26 | 13.74 |
| 2004-08-27 | 13.7 |
| 2004-08-30 | 13.93 |
| 2004-08-31 | 13.97 |
| 2004-09-01 | 14.21 |
| 2004-09-02 | 14.16 |
| 2004-09-03 | 14.22 |
| 2004-09-06 | 14.33 |
| 2004-09-07 | 14.39 |
| 2004-09-08 | 14.46 |
| 2004-09-09 | 14.37 |
| 2004-09-10 | 14.51 |
| 2004-09-13 | 14.57 |
| 2004-09-14 | 14.63 |
| 2004-09-15 | 14.6 |
| 2004-09-16 | 14.8 |
| 2004-09-17 | 15 |
| 2004-09-20 | 14.97 |
| 2004-09-21 | 15.14 |
| 2004-09-22 | 15.21 |
| 2004-09-23 | 15 |
| 2004-09-24 | 15.01 |
| 2004-09-27 | 15 |
| 2004-09-28 | 14.86 |
| 2004-09-29 | 15.07 |
| 2004-09-30 | 15.2 |
| 2004-10-01 | 14.42 |
| 2004-10-04 | 14.59 |
| 2004-10-05 | 14.68 |
| 2004-10-06 | 14.57 |
| 2004-10-07 | 14.69 |
| 2004-10-08 | 14.73 |
| 2004-10-09 | 14.76 |
| 2004-10-11 | 14.65 |
| 2004-10-12 | 14.43 |
| 2004-10-14 | 14.48 |
| 2004-10-15 | 14.48 |
| 2004-10-18 | 14.42 |
| 2004-10-19 | 14.58 |
| 2004-10-20 | 14.45 |
| 2004-10-21 | 14.38 |
| 2004-10-25 | 14.16 |
| 2004-10-26 | 14.32 |
| 2004-10-27 | 14.39 |
| 2004-10-28 | 14.51 |
| 2004-10-29 | 14.42 |
| 2004-11-01 | 14.51 |
| 2004-11-02 | 14.66 |
| 2004-11-03 | 14.86 |
| 2004-11-04 | 14.87 |
| 2004-11-05 | 15.01 |
| 2004-11-08 | 15.07 |
| 2004-11-09 | 15.02 |
| 2004-11-10 | 15.17 |
| 2004-11-11 | 15.12 |
| 2004-11-12 | 15.17 |
| 2004-11-16 | 15.22 |
| 2004-11-17 | 15.34 |
| 2004-11-18 | 15.43 |
| 2004-11-19 | 15.27 |
| 2004-11-22 | 15.3 |
| 2004-11-23 | 15.49 |
| 2004-11-24 | 15.59 |
| 2004-11-25 | 15.58 |
| 2004-11-29 | 15.87 |
| 2004-11-30 | 15.93 |
| 2004-12-01 | 15.87 |
| 2004-12-02 | 16.2 |
| 2004-12-03 | 16.19 |
| 2004-12-06 | 16.18 |
| 2004-12-07 | 16.19 |
| 2004-12-08 | 16.11 |
| 2004-12-09 | 16.21 |
| 2004-12-10 | 15.3 |
| 2004-12-13 | 15.42 |
| 2004-12-14 | 15.61 |
| 2004-12-15 | 15.74 |
| 2004-12-16 | 15.8 |
| 2004-12-17 | 15.7 |
| 2004-12-20 | 15.85 |
| 2004-12-21 | 16 |
| 2004-12-22 | 16.63 |
| 2004-12-23 | 16.74 |
| 2004-12-24 | 16.88 |
| 2004-12-27 | 16.92 |
| 2004-12-28 | 17.07 |
| 2004-12-29 | 17.03 |
| 2004-12-30 | 16.94 |
| 2004-12-31 | 17.17 |
| 2005-01-03 | 17.45 |
| 2005-01-04 | 17.42 |
| 2005-01-05 | 16.88 |
| 2005-01-06 | 16.61 |
| 2005-01-07 | 16.86 |
| 2005-01-10 | 16.67 |
| 2005-01-11 | 16.37 |
| 2005-01-12 | 15.95 |
| 2005-01-13 | 16.32 |
| 2005-01-14 | 16.16 |
| 2005-01-17 | 16.12 |
| 2005-01-18 | 16.16 |
| 2005-01-19 | 16.09 |
| 2005-01-20 | 16.01 |
| 2005-01-24 | 15.87 |
| 2005-01-25 | 16.05 |
| 2005-01-27 | 16.25 |
| 2005-01-28 | 16.63 |
| 2005-01-31 | 16.97 |
| 2005-02-01 | 17.04 |
| 2005-02-02 | 17.05 |
| 2005-02-03 | 17.28 |
| 2005-02-04 | 17.27 |
| 2005-02-07 | 17.16 |
| 2005-02-08 | 17.18 |
| 2005-02-09 | 17.34 |
| 2005-02-10 | 17.12 |
| 2005-02-11 | 17.26 |
| 2005-02-14 | 17.36 |
| 2005-02-15 | 17.27 |
| 2005-02-16 | 17.13 |
| 2005-02-17 | 17.07 |
| 2005-02-18 | 17.08 |
| 2005-02-21 | 17.03 |
| 2005-02-22 | 17.14 |
| 2005-02-23 | 17.16 |
| 2005-02-24 | 17.16 |
| 2005-02-25 | 17.18 |
| 2005-02-28 | 17.47 |
| 2005-03-01 | 17.33 |
| 2005-03-02 | 17.46 |
| 2005-03-03 | 17.74 |
| 2005-03-04 | 17.91 |
| 2005-03-07 | 18.02 |
| 2005-03-08 | 18.11 |
| 2005-03-09 | 18 |
| 2005-03-10 | 18.07 |
| 2005-03-11 | 17.99 |
| 2005-03-14 | 17.91 |
| 2005-03-15 | 17.79 |
| 2005-03-16 | 17.78 |
| 2005-03-17 | 17.56 |
| 2005-03-18 | 17.58 |
| 2005-03-21 | 17.49 |
| 2005-03-22 | 17.15 |
| 2005-03-23 | 16.82 |
| 2005-03-24 | 16.51 |
| 2005-03-28 | 16.68 |
| 2005-03-29 | 16.32 |
| 2005-03-30 | 16.45 |
| 2005-03-31 | 16.79 |
| 2005-04-01 | 17.1 |
| 2005-04-04 | 17.09 |
| 2005-04-05 | 16.97 |
| 2005-04-06 | 17.11 |
| 2005-04-07 | 17.02 |
| 2005-04-08 | 16.89 |
| 2005-04-11 | 16.71 |
| 2005-04-12 | 16.84 |
| 2005-04-13 | 16.86 |
| 2005-04-15 | 16.36 |
| 2005-04-18 | 16.17 |
| 2005-04-19 | 16.05 |
| 2005-04-20 | 16.19 |
| 2005-04-21 | 16.38 |
| 2005-04-22 | 16.52 |
| 2005-04-25 | 16.56 |
| 2005-04-26 | 16.49 |
| 2005-04-27 | 16.32 |
| 2005-04-28 | 16.28 |
| 2005-04-29 | 16 |
| 2005-05-02 | 16.07 |
| 2005-05-03 | 16.1 |
| 2005-05-04 | 16.28 |
| 2005-05-05 | 16.47 |
| 2005-05-06 | 16.58 |
| 2005-05-09 | 16.79 |
| 2005-05-10 | 16.76 |
| 2005-05-11 | 16.71 |
| 2005-05-12 | 16.79 |
| 2005-05-13 | 16.78 |
| 2005-05-16 | 16.96 |
| 2005-05-17 | 16.78 |
| 2005-05-18 | 16.73 |
| 2005-05-19 | 16.82 |
| 2005-05-20 | 16.84 |
| 2005-05-23 | 17 |
| 2005-05-24 | 17.09 |
| 2005-05-25 | 17.19 |
| 2005-05-26 | 17.32 |
| 2005-05-27 | 17.34 |
| 2005-05-30 | 17.3 |
| 2005-05-31 | 17.45 |
| 2005-06-01 | 17.48 |
| 2005-06-02 | 17.34 |
| 2005-06-03 | 17.54 |
| 2005-06-04 | 17.56 |
| 2005-06-06 | 17.48 |
| 2005-06-07 | 17.55 |
| 2005-06-08 | 17.65 |
| 2005-06-09 | 17.6 |
| 2005-06-10 | 17.51 |
| 2005-06-13 | 17.58 |
| 2005-06-14 | 17.63 |
| 2005-06-15 | 17.74 |
| 2005-06-16 | 17.62 |
| 2005-06-17 | 17.55 |
| 2005-06-20 | 17.61 |
| 2005-06-21 | 17.79 |
| 2005-06-22 | 17.89 |
| 2005-06-23 | 17.91 |
| 2005-06-24 | 18.01 |
| 2005-06-27 | 18.03 |
| 2005-06-28 | 17.77 |
| 2005-06-29 | 17.9 |
| 2005-06-30 | 18.02 |
| 2005-07-01 | 17.72 |
| 2005-07-04 | 17.92 |
| 2005-07-05 | 17.78 |
| 2005-07-06 | 17.97 |
| 2005-07-07 | 17.64 |
| 2005-07-08 | 17.84 |
| 2005-07-11 | 18.03 |
| 2005-07-12 | 18.06 |
| 2005-07-13 | 18.01 |
| 2005-07-14 | 17.92 |
| 2005-07-15 | 18.12 |
| 2005-07-18 | 18.32 |
| 2005-07-19 | 18.38 |
| 2005-07-20 | 18.45 |
| 2005-07-21 | 18.35 |
| 2005-07-22 | 18.61 |
| 2005-07-25 | 18.81 |
| 2005-07-26 | 18.82 |
| 2005-07-27 | 18.91 |
| 2005-07-29 | 18.81 |
| 2005-08-01 | 18.92 |
| 2005-08-02 | 19.24 |
| 2005-08-03 | 19.23 |
| 2005-08-04 | 19.33 |
| 2005-08-05 | 19.43 |
| 2005-08-08 | 17.55 |
| 2005-08-09 | 17.51 |
| 2005-08-10 | 17.81 |
| 2005-08-11 | 17.95 |
| 2005-08-12 | 17.87 |
| 2005-08-16 | 17.96 |
| 2005-08-17 | 18.18 |
| 2005-08-18 | 18.09 |
| 2005-08-19 | 18.07 |
| 2005-08-22 | 17.97 |
| 2005-08-23 | 17.65 |
| 2005-08-24 | 17.57 |
| 2005-08-25 | 17.77 |
| 2005-08-26 | 17.9 |
| 2005-08-29 | 17.8 |
| 2005-08-30 | 18.03 |
| 2005-08-31 | 18.17 |
| 2005-09-01 | 18.32 |
| 2005-09-02 | 18.42 |
| 2005-09-05 | 18.48 |
| 2005-09-06 | 18.52 |
| 2005-09-08 | 18.68 |
| 2005-09-09 | 18.68 |
| 2005-09-12 | 18.91 |
| 2005-09-13 | 19.04 |
| 2005-09-14 | 18.17 |
| 2005-09-15 | 18.38 |
| 2005-09-16 | 18.55 |
| 2005-09-19 | 18.69 |
| 2005-09-20 | 18.73 |
| 2005-09-21 | 18.58 |
| 2005-09-22 | 17.81 |
| 2005-09-23 | 17.87 |
| 2005-09-26 | 18.36 |
| 2005-09-27 | 18.47 |
| 2005-09-28 | 18.65 |
| 2005-09-29 | 18.66 |
| 2005-09-30 | 18.6 |
| 2005-10-03 | 18.81 |
| 2005-10-04 | 19.04 |
| 2005-10-05 | 17.38 |
| 2005-10-06 | 16.95 |
| 2005-10-07 | 16.91 |
| 2005-10-10 | 16.83 |
| 2005-10-11 | 16.91 |
| 2005-10-13 | 16.63 |
| 2005-10-14 | 16.29 |
| 2005-10-17 | 16.23 |
| 2005-10-18 | 16.12 |
| 2005-10-19 | 15.73 |
| 2005-10-20 | 15.58 |
| 2005-10-21 | 15.84 |
| 2005-10-24 | 15.63 |
| 2005-10-25 | 15.76 |
| 2005-10-26 | 15.68 |
| 2005-10-27 | 15.33 |
| 2005-10-28 | 15.11 |
| 2005-10-31 | 15.45 |
| 2005-11-01 | 15.58 |
| 2005-11-02 | 15.75 |
| 2005-11-07 | 16.01 |
| 2005-11-08 | 16.25 |
| 2005-11-09 | 16.2 |
| 2005-11-10 | 16.28 |
| 2005-11-11 | 16.6 |
| 2005-11-14 | 16.66 |
| 2005-11-16 | 16.79 |
| 2005-11-17 | 16.9 |
| 2005-11-18 | 16.97 |
| 2005-11-21 | 16.89 |
| 2005-11-22 | 16.73 |
| 2005-11-23 | 16.89 |
| 2005-11-24 | 17.04 |
| 2005-11-25 | 17.24 |
| 2005-11-26 | 17.4 |
| 2005-11-28 | 17.58 |
| 2005-11-29 | 17.51 |
| 2005-11-30 | 17.28 |
| 2005-12-01 | 17.55 |
| 2005-12-02 | 17.57 |
| 2005-12-05 | 17.38 |
| 2005-12-06 | 17.38 |
| 2005-12-07 | 17.54 |
| 2005-12-08 | 17.76 |
| 2005-12-09 | 18.03 |
| 2005-12-12 | 18.15 |
| 2005-12-13 | 18.35 |
| 2005-12-14 | 18.25 |
| 2005-12-15 | 18.07 |
| 2005-12-16 | 18.25 |
| 2005-12-19 | 18.52 |
| 2005-12-20 | 18.48 |
| 2005-12-21 | 18.47 |
| 2005-12-22 | 18.54 |
| 2005-12-23 | 18.33 |
| 2005-12-26 | 17.96 |
| 2005-12-27 | 18.32 |
| 2005-12-28 | 18.3 |
| 2005-12-29 | 18.44 |
| 2005-12-30 | 18.58 |
| 2006-01-02 | 18.62 |
| 2006-01-03 | 18.91 |
| 2006-01-04 | 18.99 |
| 2006-01-05 | 19.02 |
| 2006-01-06 | 19.12 |
| 2006-01-09 | 19.15 |
| 2006-01-10 | 18.93 |
| 2006-01-12 | 18.86 |
| 2006-01-13 | 18.87 |
| 2006-01-16 | 18.74 |
| 2006-01-17 | 18.65 |
| 2006-01-18 | 18.26 |
| 2006-01-19 | 18.64 |
| 2006-01-20 | 18.81 |
| 2006-01-23 | 18.73 |
| 2006-01-24 | 18.84 |
| 2006-01-25 | 18.96 |
| 2006-01-27 | 19.25 |
| 2006-01-30 | 19.13 |
| 2006-01-31 | 19.25 |
| 2006-02-01 | 19.06 |
| 2006-02-02 | 19.05 |
| 2006-02-03 | 19 |
| 2006-02-06 | 19.31 |
| 2006-02-07 | 19.43 |
| 2006-02-08 | 19.42 |
| 2006-02-10 | 19.55 |
| 2006-02-13 | 19.65 |
| 2006-02-14 | 19.53 |
| 2006-02-15 | 19.58 |
| 2006-02-16 | 19.62 |
| 2006-02-17 | 19.35 |
| 2006-02-20 | 19.39 |
| 2006-02-21 | 19.56 |
| 2006-02-22 | 19.67 |
| 2006-02-23 | 19.7 |
| 2006-02-24 | 19.73 |
| 2006-02-27 | 19.85 |
| 2006-02-28 | 19.84 |
| 2006-03-01 | 20.14 |
| 2006-03-02 | 20.11 |
| 2006-03-03 | 20.13 |
| 2006-03-06 | 20.4 |
| 2006-03-07 | 20.45 |
| 2006-03-08 | 20.06 |
| 2006-03-09 | 20.16 |
| 2006-03-10 | 20.45 |
| 2006-03-13 | 20.55 |
| 2006-03-14 | 20.48 |
| 2006-03-16 | 20.62 |
| 2006-03-17 | 20.64 |
| 2006-03-20 | 20.81 |
| 2006-03-21 | 20.78 |
| 2006-03-22 | 20.64 |
| 2006-03-23 | 20.94 |
| 2006-03-24 | 21.13 |
| 2006-03-27 | 21.35 |
| 2006-03-28 | 21.3 |
| 2006-03-29 | 21.45 |
| 2006-03-30 | 21.73 |
| 2006-03-31 | 21.81 |
| 2006-04-03 | 20.91 |
| 2006-04-04 | 21.04 |
| 2006-04-05 | 21.25 |
| 2006-04-07 | 20.93 |
| 2006-04-10 | 21.08 |
| 2006-04-12 | 20.58 |
| 2006-04-13 | 20.31 |
| 2006-04-17 | 20.67 |
| 2006-04-18 | 21.05 |
| 2006-04-19 | 21.1 |
| 2006-04-20 | 21.22 |
| 2006-04-21 | 21.2 |
| 2006-04-24 | 21.01 |
| 2006-04-25 | 20.56 |
| 2006-04-26 | 21.18 |
| 2006-04-27 | 20.89 |
| 2006-04-28 | 20.56 |
| 2006-04-29 | 20.83 |
| 2006-05-02 | 20.99 |
| 2006-05-03 | 21.15 |
| 2006-05-04 | 21.23 |
| 2006-05-05 | 21.3 |
| 2006-05-08 | 21.47 |
| 2006-05-09 | 21.58 |
| 2006-05-10 | 21.78 |
| 2006-05-11 | 21.51 |
| 2006-05-12 | 21.27 |
| 2006-05-15 | 20.41 |
| 2006-05-16 | 20.47 |
| 2006-05-17 | 21.08 |
| 2006-05-18 | 19.62 |
| 2006-05-19 | 18.82 |
| 2006-05-22 | 17.72 |
| 2006-05-23 | 18.39 |
| 2006-05-24 | 18.06 |
| 2006-05-25 | 18.39 |
| 2006-05-26 | 18.07 |
| 2006-05-29 | 18.11 |
| 2006-05-30 | 18.01 |
| 2006-05-31 | 17.44 |
| 2006-06-01 | 16.91 |
| 2006-06-02 | 17.32 |
| 2006-06-05 | 17 |
| 2006-06-06 | 16.51 |
| 2006-06-07 | 15.83 |
| 2006-06-08 | 14.92 |
| 2006-06-09 | 15.77 |
| 2006-06-12 | 15.41 |
| 2006-06-13 | 14.67 |
| 2006-06-14 | 14.43 |
| 2006-06-15 | 15.37 |
| 2006-06-16 | 15.95 |
| 2006-06-19 | 16.16 |
| 2006-06-20 | 15.98 |
| 2006-06-21 | 16.35 |
| 2006-06-22 | 16.73 |
| 2006-06-23 | 16.91 |
| 2006-06-25 | 17.08 |
| 2006-06-26 | 16.32 |
| 2006-06-27 | 16.42 |
| 2006-06-28 | 16.51 |
| 2006-06-29 | 16.58 |
| 2006-06-30 | 17.25 |
| 2006-07-03 | 17.37 |
| 2006-07-04 | 17.35 |
| 2006-07-05 | 17.64 |
| 2006-07-06 | 17.48 |
| 2006-07-07 | 17.08 |
| 2006-07-10 | 17.57 |
| 2006-07-11 | 17.48 |
| 2006-07-12 | 17.76 |
| 2006-07-13 | 17.65 |
| 2006-07-14 | 17.42 |
| 2006-07-17 | 16.79 |
| 2006-07-18 | 16.63 |
| 2006-07-19 | 16.13 |
| 2006-07-20 | 16.47 |
| 2006-07-21 | 16 |
| 2006-07-24 | 16.05 |
| 2006-07-25 | 16.42 |
| 2006-07-26 | 16.6 |
| 2006-07-27 | 16.81 |
| 2006-07-28 | 16.73 |
| 2006-07-31 | 16.54 |
| 2006-08-01 | 16.5 |
| 2006-08-02 | 16.72 |
| 2006-08-03 | 16.76 |
| 2006-08-04 | 16.68 |
| 2006-08-07 | 16.59 |
| 2006-08-08 | 16.88 |
| 2006-08-09 | 17.11 |
| 2006-08-10 | 17.23 |
| 2006-08-11 | 17.36 |
| 2006-08-14 | 17.6 |
| 2006-08-16 | 17.84 |
| 2006-08-17 | 17.79 |
| 2006-08-18 | 17.84 |
| 2006-08-21 | 17.92 |
| 2006-08-22 | 17.89 |
| 2006-08-23 | 17.72 |
| 2006-08-24 | 17.89 |
| 2006-08-25 | 18 |
| 2006-08-28 | 18.09 |
| 2006-08-29 | 18.22 |
| 2006-08-30 | 18.21 |
| 2006-08-31 | 18.11 |
| 2006-09-01 | 18.25 |
| 2006-09-04 | 18.49 |
| 2006-09-05 | 18.53 |
| 2006-09-06 | 18.6 |
| 2006-09-07 | 18.49 |
| 2006-09-08 | 18.61 |
| 2006-09-11 | 18.03 |
| 2006-09-12 | 18.2 |
| 2006-09-13 | 18.59 |
| 2006-09-14 | 18.69 |
| 2006-09-15 | 18.73 |
| 2006-09-18 | 18.8 |
| 2006-09-19 | 18.59 |
| 2006-09-20 | 18.8 |
| 2006-09-21 | 19.03 |
| 2006-09-22 | 19.03 |
| 2006-09-25 | 18.94 |
| 2006-09-26 | 19.33 |
| 2006-09-27 | 19.42 |
| 2006-09-28 | 19.44 |
| 2006-09-29 | 19.59 |
| 2006-10-03 | 19.56 |
| 2006-10-04 | 19.32 |
| 2006-10-05 | 19.6 |
| 2006-10-06 | 19.66 |
| 2006-10-09 | 19.67 |
| 2006-10-10 | 19.7 |
| 2006-10-11 | 19.52 |
| 2006-10-12 | 19.81 |
| 2006-10-13 | 20.01 |
| 2006-10-16 | 20.1 |
| 2006-10-17 | 19.89 |
| 2006-10-18 | 19.78 |
| 2006-10-19 | 19.53 |
| 2006-10-20 | 19.46 |
| 2006-10-21 | 19.53 |
| 2006-10-23 | 19.38 |
| 2006-10-26 | 19.38 |
| 2006-10-27 | 19.62 |
| 2006-10-30 | 18.98 |
| 2006-10-31 | 18.84 |
| 2006-11-01 | 18.67 |
| 2006-11-02 | 18.79 |
| 2006-11-03 | 18.85 |
| 2006-11-06 | 18.9 |
| 2006-11-07 | 18.86 |
| 2006-11-08 | 18.78 |
| 2006-11-09 | 18.87 |
| 2006-11-10 | 19.05 |
| 2006-11-13 | 19.22 |
| 2006-11-14 | 19.23 |
| 2006-11-15 | 19.3 |
| 2006-11-16 | 19.3 |
| 2006-11-17 | 19.14 |
| 2006-11-20 | 19.08 |
| 2006-11-21 | 19.4 |
| 2006-11-22 | 19.57 |
| 2006-11-23 | 19.59 |
| 2006-11-24 | 19.67 |
| 2006-11-27 | 19.76 |
| 2006-11-28 | 19.52 |
| 2006-11-29 | 19.56 |
| 2006-11-30 | 19.6 |
| 2006-12-01 | 19.89 |
| 2006-12-04 | 19.99 |
| 2006-12-05 | 20.03 |
| 2006-12-06 | 19.96 |
| 2006-12-07 | 19.98 |
| 2006-12-08 | 19.79 |
| 2006-12-11 | 19.13 |
| 2006-12-12 | 18.39 |
| 2006-12-13 | 18.73 |
| 2006-12-14 | 19.18 |
| 2006-12-15 | 19.46 |
| 2006-12-18 | 19.56 |
| 2006-12-19 | 19.12 |
| 2006-12-20 | 19.04 |
| 2006-12-21 | 19.11 |
| 2006-12-22 | 19.3 |
| 2006-12-26 | 19.64 |
| 2006-12-27 | 19.8 |
| 2006-12-28 | 19.8 |
| 2006-12-29 | 19.84 |
| 2007-01-02 | 20.01 |
| 2007-01-03 | 20.13 |
| 2007-01-04 | 20.05 |
| 2007-01-05 | 20.03 |
| 2007-01-08 | 19.8 |
| 2007-01-09 | 19.65 |
| 2007-01-10 | 19.36 |
| 2007-01-11 | 19.73 |
| 2007-01-12 | 20.18 |
| 2007-01-15 | 20.3 |
| 2007-01-16 | 20.22 |
| 2007-01-17 | 20.25 |
| 2007-01-18 | 20.32 |
| 2007-01-19 | 20.08 |
| 2007-01-22 | 20 |
| 2007-01-23 | 19.6 |
| 2007-01-24 | 19.68 |
| 2007-01-25 | 19.87 |
| 2007-01-29 | 19.48 |
| 2007-01-31 | 18.63 |
| 2007-02-01 | 18.71 |
| 2007-02-02 | 18.85 |
| 2007-02-05 | 18.94 |
| 2007-02-06 | 18.92 |
| 2007-02-07 | 19.02 |
| 2007-02-08 | 19.01 |
| 2007-02-09 | 18.78 |
| 2007-02-12 | 18.16 |
| 2007-02-13 | 18.08 |
| 2007-02-14 | 18.07 |
| 2007-02-15 | 18.51 |
| 2007-02-19 | 18.56 |
| 2007-02-20 | 18.33 |
| 2007-02-21 | 18.29 |
| 2007-02-22 | 18.06 |
| 2007-02-23 | 17.62 |
| 2007-02-26 | 17.64 |
| 2007-02-27 | 17.52 |
| 2007-02-28 | 16.9 |
| 2007-03-01 | 17.11 |
| 2007-03-02 | 16.81 |
| 2007-03-05 | 16.08 |
| 2007-03-06 | 16.33 |
| 2007-03-07 | 16.14 |
| 2007-03-08 | 16.71 |
| 2007-03-09 | 16.58 |
| 2007-03-12 | 16.68 |
| 2007-03-13 | 16.88 |
| 2007-03-14 | 16.37 |
| 2007-03-15 | 16.43 |
| 2007-03-16 | 16.29 |
| 2007-03-19 | 16.56 |
| 2007-03-20 | 16.67 |
| 2007-03-21 | 16.89 |
| 2007-03-22 | 17.28 |
| 2007-03-23 | 17.25 |
| 2007-03-26 | 17.1 |
| 2007-03-28 | 16.85 |
| 2007-03-29 | 16.96 |
| 2007-03-30 | 17.11 |
| 2007-04-02 | 16.37 |
| 2007-04-03 | 16.58 |
| 2007-04-04 | 16.79 |
| 2007-04-05 | 16.89 |
| 2007-04-09 | 17.29 |
| 2007-04-10 | 17.34 |
| 2007-04-11 | 17.41 |
| 2007-04-12 | 17.28 |
| 2007-04-13 | 17.56 |
| 2007-04-16 | 17.93 |
| 2007-04-17 | 17.78 |
| 2007-04-18 | 17.89 |
| 2007-04-19 | 17.82 |
| 2007-04-20 | 18.06 |
| 2007-04-23 | 18 |
| 2007-04-24 | 18.22 |
| 2007-04-25 | 18.33 |
| 2007-04-26 | 18.33 |
| 2007-04-27 | 17.59 |
| 2007-04-30 | 17.6 |
| 2007-05-03 | 17.72 |
| 2007-05-04 | 17.61 |
| 2007-05-07 | 17.55 |
| 2007-05-08 | 17.44 |
| 2007-05-09 | 17.47 |
| 2007-05-10 | 17.43 |
| 2007-05-11 | 17.48 |
| 2007-05-14 | 17.62 |
| 2007-05-15 | 17.6 |
| 2007-05-16 | 17.82 |
| 2007-05-17 | 18.05 |
| 2007-05-18 | 17.97 |
| 2007-05-21 | 18.02 |
| 2007-05-22 | 18.09 |
| 2007-05-23 | 17.96 |
| 2007-05-24 | 17.83 |
| 2007-05-25 | 18.04 |
| 2007-05-28 | 18.35 |
| 2007-05-29 | 18.42 |
| 2007-05-30 | 18.35 |
| 2007-05-31 | 18.47 |
| 2007-06-01 | 18.53 |
| 2007-06-04 | 18.5 |
| 2007-06-05 | 18.58 |
| 2007-06-06 | 18.22 |
| 2007-06-07 | 18.14 |
| 2007-06-08 | 17.99 |
| 2007-06-11 | 17.99 |
| 2007-06-12 | 17.97 |
| 2007-06-13 | 17.85 |
| 2007-06-14 | 18.12 |
| 2007-06-15 | 18.15 |
| 2007-06-18 | 18.05 |
| 2007-06-19 | 18.32 |
| 2007-06-20 | 18.49 |
| 2007-06-21 | 18.61 |
| 2007-06-22 | 18.59 |
| 2007-06-25 | 18.64 |
| 2007-06-26 | 18.76 |
| 2007-06-27 | 18.67 |
| 2007-06-28 | 18.72 |
| 2007-06-29 | 18.93 |
| 2007-07-02 | 18.99 |
| 2007-07-03 | 19.18 |
| 2007-07-04 | 19.19 |
| 2007-07-05 | 19.1 |
| 2007-07-06 | 19.29 |
| 2007-07-09 | 19.46 |
| 2007-07-10 | 19.39 |
| 2007-07-11 | 19.36 |
| 2007-07-12 | 19.63 |
| 2007-07-13 | 19.82 |
| 2007-07-16 | 19.91 |
| 2007-07-17 | 19.8 |
| 2007-07-18 | 19.78 |
| 2007-07-19 | 19.94 |
| 2007-07-20 | 19.86 |
| 2007-07-23 | 20.03 |
| 2007-07-24 | 19.95 |
| 2007-07-25 | 19.73 |
| 2007-07-26 | 19.7 |
| 2007-07-27 | 18.96 |
| 2007-07-30 | 18.58 |
| 2007-07-31 | 18.72 |
| 2007-08-01 | 17.95 |
| 2007-08-02 | 18.03 |
| 2007-08-03 | 18.25 |
| 2007-08-06 | 18.02 |
| 2007-08-07 | 18.11 |
| 2007-08-08 | 18.5 |
| 2007-08-09 | 18.23 |
| 2007-08-10 | 17.97 |
| 2007-08-13 | 18.12 |
| 2007-08-14 | 18.12 |
| 2007-08-16 | 17.35 |
| 2007-08-17 | 17.08 |
| 2007-08-20 | 17.44 |
| 2007-08-21 | 16.87 |
| 2007-08-22 | 17.1 |
| 2007-08-23 | 16.95 |
| 2007-08-24 | 17.24 |
| 2007-08-27 | 17.72 |
| 2007-08-28 | 17.84 |
| 2007-08-29 | 17.97 |
| 2007-08-30 | 18.13 |
| 2007-08-31 | 18.4 |
| 2007-09-03 | 18.57 |
| 2007-09-04 | 18.61 |
| 2007-09-05 | 18.61 |
| 2007-09-06 | 18.79 |
| 2007-09-07 | 18.75 |
| 2007-09-10 | 18.84 |
| 2007-09-11 | 18.84 |
| 2007-09-12 | 18.84 |
| 2007-09-13 | 19.01 |
| 2007-09-14 | 18.9 |
| 2007-09-17 | 18.86 |
| 2007-09-18 | 19.07 |
| 2007-09-19 | 19.71 |
| 2007-09-20 | 19.83 |
| 2007-09-21 | 20.07 |
| 2007-09-24 | 20.56 |
| 2007-09-25 | 20.59 |
| 2007-09-26 | 20.65 |
| 2007-09-27 | 20.79 |
| 2007-09-28 | 20.99 |
| 2007-10-01 | 21.23 |
| 2007-10-03 | 21.69 |
| 2007-10-04 | 21.73 |
| 2007-10-05 | 21.61 |
| 2007-10-08 | 21.07 |
| 2007-10-09 | 21.95 |
| 2007-10-10 | 22.38 |
| 2007-10-11 | 22.71 |
| 2007-10-12 | 22.33 |
| 2007-10-15 | 23.15 |
| 2007-10-16 | 23.19 |
| 2007-10-17 | 22.66 |
| 2007-10-18 | 21.91 |
| 2007-10-19 | 21.16 |
| 2007-10-22 | 21.03 |
| 2007-10-23 | 22.11 |
| 2007-10-24 | 22.24 |
| 2007-10-25 | 22.44 |
| 2007-10-26 | 22.9 |
| 2007-10-29 | 23.46 |
| 2007-10-30 | 23.15 |
| 2007-10-31 | 23.04 |
| 2007-11-01 | 22.78 |
| 2007-11-02 | 23.04 |
| 2007-11-05 | 22.87 |
| 2007-11-06 | 22.77 |
| 2007-11-07 | 22.74 |
| 2007-11-08 | 22.46 |
| 2007-11-09 | 22.39 |
| 2007-11-12 | 22.23 |
| 2007-11-13 | 22.61 |
| 2007-11-14 | 23.5 |
| 2007-11-15 | 23.61 |
| 2007-11-16 | 23.7 |
| 2007-11-19 | 23.94 |
| 2007-11-20 | 23.46 |
| 2007-11-21 | 22.43 |
| 2007-11-22 | 22.22 |
| 2007-11-23 | 22.61 |
| 2007-11-26 | 23.14 |
| 2007-11-27 | 23.09 |
| 2007-11-28 | 22.85 |
| 2007-11-29 | 22.8 |
| 2007-11-30 | 23.42 |
| 2007-12-03 | 23.9 |
| 2007-12-04 | 24.07 |
| 2007-12-05 | 24.45 |
| 2007-12-06 | 24.45 |
| 2007-12-07 | 25.02 |
| 2007-12-10 | 25.08 |
| 2007-12-11 | 25.5 |
| 2007-12-12 | 25.85 |
| 2007-12-13 | 25.62 |
| 2007-12-14 | 25.68 |
| 2007-12-17 | 24.49 |
| 2007-12-18 | 24.41 |
| 2007-12-19 | 24.43 |
| 2007-12-20 | 24.44 |
| 2007-12-24 | 25.21 |
| 2007-12-26 | 25.76 |
| 2007-12-27 | 25.81 |
| 2007-12-28 | 26.05 |
| 2007-12-31 | 26.4 |
| 2008-01-02 | 26.75 |
| 2008-01-03 | 26.77 |
| 2008-01-04 | 27.07 |
| 2008-01-07 | 27.06 |
| 2008-01-08 | 26.87 |
| 2008-01-09 | 26.81 |
| 2008-01-10 | 26.16 |
| 2008-01-11 | 26.28 |
| 2008-01-14 | 26.44 |
| 2008-01-15 | 25.93 |
| 2008-01-16 | 25.32 |
| 2008-01-17 | 24.59 |
| 2008-01-18 | 23.41 |
| 2008-01-21 | 20.99 |
| 2008-01-22 | 19.51 |
| 2008-01-23 | 20.76 |
| 2008-01-24 | 20.09 |
| 2008-01-25 | 21.43 |
| 2008-01-28 | 21.2 |
| 2008-01-29 | 21.13 |
| 2008-01-30 | 20.44 |
| 2008-01-31 | 20.19 |
| 2008-02-01 | 20.62 |
| 2008-02-04 | 21.26 |
| 2008-02-05 | 21.4 |
| 2008-02-06 | 20.87 |
| 2008-02-07 | 20.18 |
| 2008-02-08 | 19.99 |
| 2008-02-11 | 18.94 |
| 2008-02-12 | 18.8 |
| 2008-02-13 | 19.06 |
| 2008-02-14 | 20.14 |
| 2008-02-15 | 20.61 |
| 2008-02-18 | 20.55 |
| 2008-02-19 | 20.58 |
| 2008-02-20 | 20.11 |
| 2008-02-21 | 20.27 |
| 2008-02-22 | 19.97 |
| 2008-02-25 | 20.21 |
| 2008-02-26 | 20.49 |
| 2008-02-27 | 20.49 |
| 2008-02-28 | 20.48 |
| 2008-02-29 | 20.29 |
| 2008-03-03 | 19.26 |
| 2008-03-04 | 18.82 |
| 2008-03-05 | 18.92 |
| 2008-03-07 | 18.25 |
| 2008-03-10 | 18.28 |
| 2008-03-11 | 18.73 |
| 2008-03-12 | 18.68 |
| 2008-03-13 | 17.63 |
| 2008-03-14 | 18.06 |
| 2008-03-17 | 17.01 |
| 2008-03-18 | 17.01 |
| 2008-03-19 | 17.08 |
| 2008-03-24 | 17.08 |
| 2008-03-25 | 18.12 |
| 2008-03-26 | 18.06 |
| 2008-03-27 | 18.04 |
| 2008-03-28 | 18.55 |
| 2008-03-31 | 17.86 |
| 2008-04-01 | 17.82 |
| 2008-04-02 | 17.9 |
| 2008-04-03 | 17.93 |
| 2008-04-04 | 17.49 |
| 2008-04-07 | 17.88 |
| 2008-04-08 | 17.77 |
| 2008-04-09 | 17.94 |
| 2008-04-10 | 17.88 |
| 2008-04-11 | 18.03 |
| 2008-04-15 | 18.38 |
| 2008-04-16 | 18.48 |
| 2008-04-17 | 18.8 |
| 2008-04-21 | 19.11 |
| 2008-04-22 | 19.11 |
| 2008-04-23 | 19.01 |
| 2008-04-24 | 19.03 |
| 2008-04-25 | 19.3 |
| 2008-04-28 | 19.23 |
| 2008-04-29 | 19.51 |
| 2008-04-30 | 19.41 |
| 2008-05-02 | 19.66 |
| 2008-05-05 | 19.56 |
| 2008-05-06 | 19.33 |
| 2008-05-07 | 19.21 |
| 2008-05-08 | 19 |
| 2008-05-09 | 18.59 |
| 2008-05-12 | 18.6 |
| 2008-05-13 | 18.47 |
| 2008-05-14 | 18.66 |
| 2008-05-15 | 18.98 |
| 2008-05-16 | 19.1 |
| 2008-05-20 | 18.93 |
| 2008-05-21 | 18.94 |
| 2008-05-22 | 18.6 |
| 2008-05-23 | 18.31 |
| 2008-05-26 | 17.97 |
| 2008-05-27 | 17.89 |
| 2008-05-28 | 18.22 |
| 2008-05-29 | 18.02 |
| 2008-05-30 | 18.09 |
| 2008-06-02 | 17.58 |
| 2008-06-03 | 17.48 |
| 2008-06-04 | 16.96 |
| 2008-06-05 | 17.22 |
| 2008-06-06 | 17.02 |
| 2008-06-09 | 16.47 |
| 2008-06-10 | 16.28 |
| 2008-06-11 | 16.57 |
| 2008-06-12 | 16.64 |
| 2008-06-13 | 16.58 |
| 2008-06-16 | 16.79 |
| 2008-06-17 | 17.17 |
| 2008-06-18 | 16.93 |
| 2008-06-19 | 16.62 |
| 2008-06-20 | 16.06 |
| 2008-06-23 | 15.64 |
| 2008-06-24 | 15.36 |
| 2008-06-25 | 15.54 |
| 2008-06-26 | 15.68 |
| 2008-06-27 | 15.05 |
| 2008-06-30 | 14.65 |
| 2008-07-01 | 14.1 |
| 2008-07-02 | 14.79 |
| 2008-07-03 | 14.22 |
| 2008-07-04 | 14.61 |
| 2008-07-07 | 14.75 |
| 2008-07-08 | 14.65 |
| 2008-07-09 | 15.26 |
| 2008-07-10 | 15.27 |
| 2008-07-11 | 14.84 |
| 2008-07-14 | 14.79 |
| 2008-07-15 | 14.15 |
| 2008-07-16 | 14 |
| 2008-07-17 | 14.44 |
| 2008-07-18 | 14.88 |
| 2008-07-21 | 15.04 |
| 2008-07-22 | 15.32 |
| 2008-07-23 | 16.17 |
| 2008-07-24 | 16.04 |
| 2008-07-25 | 15.62 |
| 2008-07-28 | 15.63 |
| 2008-07-29 | 15.03 |
| 2008-07-30 | 15.63 |
| 2008-07-31 | 15.69 |
| 2008-08-01 | 16.02 |
| 2008-08-04 | 16.08 |
| 2008-08-05 | 16.47 |
| 2008-08-06 | 16.49 |
| 2008-08-07 | 16.52 |
| 2008-08-08 | 16.56 |
| 2008-08-11 | 16.89 |
| 2008-08-12 | 16.66 |
| 2008-08-13 | 16.57 |
| 2008-08-14 | 16.18 |
| 2008-08-18 | 16.04 |
| 2008-08-19 | 15.95 |
| 2008-08-20 | 16.11 |
| 2008-08-21 | 15.65 |
| 2008-08-22 | 15.76 |
| 2008-08-25 | 15.8 |
| 2008-08-26 | 15.81 |
| 2008-08-27 | 15.65 |
| 2008-08-28 | 15.41 |
| 2008-08-29 | 15.92 |
| 2008-09-01 | 15.89 |
| 2008-09-02 | 16.43 |
| 2008-09-04 | 16.26 |
| 2008-09-05 | 15.92 |
| 2008-09-08 | 16.32 |
| 2008-09-09 | 16.26 |
| 2008-09-10 | 16.35 |
| 2008-09-11 | 16 |
| 2008-09-12 | 15.74 |
| 2008-09-15 | 15.13 |
| 2008-09-16 | 15.06 |
| 2008-09-17 | 14.79 |
| 2008-09-18 | 14.79 |
| 2008-09-19 | 15.46 |
| 2008-09-22 | 15.67 |
| 2008-09-23 | 15.35 |
| 2008-09-24 | 15.45 |
| 2008-09-25 | 15.29 |
| 2008-09-26 | 14.82 |
| 2008-09-29 | 14.27 |
| 2008-09-30 | 14.51 |
| 2008-10-01 | 14.63 |
| 2008-10-03 | 14.16 |
| 2008-10-06 | 13.33 |
| 2008-10-07 | 13.25 |
| 2008-10-08 | 12.79 |
| 2008-10-10 | 11.89 |
| 2008-10-13 | 12.57 |
| 2008-10-14 | 12.72 |
| 2008-10-15 | 12.1 |
| 2008-10-16 | 11.91 |
| 2008-10-17 | 11.29 |
| 2008-10-20 | 11.46 |
| 2008-10-21 | 11.85 |
| 2008-10-22 | 11.3 |
| 2008-10-23 | 10.85 |
| 2008-10-24 | 9.58 |
| 2008-10-27 | 9.29 |
| 2008-10-28 | 9.86 |
| 2008-10-29 | 9.89 |
| 2008-10-31 | 11.15 |
| 2008-11-03 | 12 |
| 2008-11-04 | 12.42 |
| 2008-11-05 | 11.94 |
| 2008-11-06 | 11.57 |
| 2008-11-07 | 11.85 |
| 2008-11-10 | 12.49 |
| 2008-11-11 | 11.8 |
| 2008-11-12 | 11.48 |
| 2008-11-14 | 11.29 |
| 2008-11-17 | 11.16 |
| 2008-11-18 | 10.74 |
| 2008-11-19 | 10.54 |
| 2008-11-20 | 10.19 |
| 2008-11-21 | 10.6 |
| 2008-11-24 | 10.64 |
| 2008-11-25 | 10.46 |
| 2008-11-26 | 10.72 |
| 2008-11-28 | 10.73 |
| 2008-12-01 | 10.49 |
| 2008-12-02 | 10.4 |
| 2008-12-03 | 10.46 |
| 2008-12-04 | 10.94 |
| 2008-12-05 | 10.68 |
| 2008-12-08 | 10.88 |
| 2008-12-10 | 11.36 |
| 2008-12-11 | 11.4 |
| 2008-12-12 | 11.44 |
| 2008-12-15 | 11.71 |
| 2008-12-16 | 11.98 |
| 2008-12-17 | 11.63 |
| 2008-12-18 | 12.04 |
| 2008-12-19 | 12.16 |
| 2008-12-22 | 12.03 |
| 2008-12-23 | 11.73 |
| 2008-12-24 | 11.57 |
| 2008-12-26 | 11.36 |
| 2008-12-29 | 11.6 |
| 2008-12-30 | 11.85 |
| 2008-12-31 | 11.8 |
| 2009-01-01 | 12.13 |
| 2009-01-02 | 12.23 |
| 2009-01-05 | 12.5 |
| 2009-01-06 | 12.49 |
| 2009-01-07 | 11.67 |
| 2009-01-09 | 11.42 |
| 2009-01-12 | 11.32 |
| 2009-01-13 | 11.18 |
| 2009-01-14 | 11.51 |
| 2009-01-15 | 11.15 |
| 2009-01-16 | 11.46 |
| 2009-01-19 | 11.55 |
| 2009-01-20 | 11.42 |
| 2009-01-21 | 11.09 |
| 2009-01-22 | 11.06 |
| 2009-01-23 | 11.11 |
| 2009-01-27 | 11.52 |
| 2009-01-28 | 11.89 |
| 2009-01-29 | 11.98 |
| 2009-01-30 | 12.15 |
| 2009-02-02 | 12.22 |
| 2009-02-03 | 12.25 |
| 2009-02-04 | 12.31 |
| 2009-02-05 | 12.22 |
| 2009-02-06 | 12.47 |
| 2009-02-09 | 12.8 |
| 2009-02-10 | 12.86 |
| 2009-02-11 | 12.84 |
| 2009-02-12 | 12.73 |
| 2009-02-13 | 12.95 |
| 2009-02-16 | 12.55 |
| 2009-02-17 | 12.22 |
| 2009-02-18 | 12.23 |
| 2009-02-19 | 12.27 |
| 2009-02-20 | 12.05 |
| 2009-02-24 | 12 |
| 2009-02-25 | 12.1 |
| 2009-02-26 | 12.13 |
| 2009-02-27 | 12.07 |
| 2009-03-02 | 11.73 |
| 2009-03-03 | 11.52 |
| 2009-03-04 | 11.58 |
| 2009-03-05 | 11.33 |
| 2009-03-06 | 11.45 |
| 2009-03-09 | 11.24 |
| 2009-03-12 | 11.4 |
| 2009-03-13 | 11.8 |
| 2009-03-16 | 12.1 |
| 2009-03-17 | 12.04 |
| 2009-03-18 | 12.22 |
| 2009-03-19 | 12.28 |
| 2009-03-20 | 12.25 |
| 2009-03-23 | 12.77 |
| 2009-03-24 | 12.73 |
| 2009-03-25 | 12.91 |
| 2009-03-26 | 13.25 |
| 2009-03-27 | 13.4 |
| 2009-03-30 | 12.93 |
| 2009-03-31 | 13.13 |
| 2009-04-01 | 13.3 |
| 2009-04-02 | 13.9 |
| 2009-04-06 | 14.15 |
| 2009-04-08 | 14.52 |
| 2009-04-09 | 14.57 |
| 2009-04-13 | 14.87 |
| 2009-04-15 | 15.38 |
| 2009-04-16 | 14.82 |
| 2009-04-17 | 14.92 |
| 2009-04-20 | 14.97 |
| 2009-04-21 | 14.9 |
| 2009-04-22 | 14.73 |
| 2009-04-23 | 15.12 |
| 2009-04-24 | 15.39 |
| 2009-04-27 | 15.4 |
| 2009-04-28 | 14.91 |
| 2009-04-29 | 15.28 |
| 2009-05-04 | 16.03 |
| 2009-05-05 | 16.14 |
| 2009-05-06 | 15.96 |
| 2009-05-07 | 16.3 |
| 2009-05-08 | 16.09 |
| 2009-05-11 | 15.76 |
| 2009-05-12 | 16.2 |
| 2009-05-13 | 16.05 |
| 2009-05-14 | 15.98 |
| 2009-05-15 | 16.25 |
| 2009-05-18 | 19.73 |
| 2009-05-19 | 18.92 |
| 2009-05-20 | 19.11 |
| 2009-05-21 | 18.98 |
| 2009-05-22 | 19.06 |
| 2009-05-25 | 19.37 |
| 2009-05-26 | 18.82 |
| 2009-05-27 | 19.53 |
| 2009-05-28 | 19.82 |
| 2009-05-29 | 19.73 |
| 2009-06-01 | 19.8 |
| 2009-06-02 | 19.33 |
| 2009-06-03 | 19.41 |
| 2009-06-04 | 19.7 |
| 2009-06-05 | 19.72 |
| 2009-06-08 | 18.95 |
| 2009-06-09 | 19.47 |
| 2009-06-10 | 19.85 |
| 2009-06-11 | 19.73 |
| 2009-06-12 | 19.5 |
| 2009-06-15 | 19.15 |
| 2009-06-16 | 19.38 |
| 2009-06-17 | 18.41 |
| 2009-06-18 | 17.92 |
| 2009-06-19 | 18.16 |
| 2009-06-22 | 17.92 |
| 2009-06-23 | 17.98 |
| 2009-06-24 | 18.24 |
| 2009-06-25 | 18.13 |
| 2009-06-26 | 18.54 |
| 2009-06-29 | 18.8 |
| 2009-06-30 | 18.45 |
| 2009-07-01 | 18.64 |
| 2009-07-02 | 18.76 |
| 2009-07-03 | 18.98 |
| 2009-07-06 | 17.95 |
| 2009-07-07 | 17.99 |
| 2009-07-08 | 17.52 |
| 2009-07-09 | 17.58 |
| 2009-07-10 | 17.23 |
| 2009-07-13 | 16.99 |
| 2009-07-14 | 17.59 |
| 2009-07-15 | 18.2 |
| 2009-07-16 | 18.14 |
| 2009-07-17 | 18.63 |
| 2009-07-20 | 19.06 |
| 2009-07-21 | 18.87 |
| 2009-07-22 | 18.57 |
| 2009-07-23 | 18.92 |
| 2009-07-24 | 19.3 |
| 2009-07-27 | 19.29 |
| 2009-07-28 | 19.17 |
| 2009-07-29 | 18.97 |
| 2009-07-30 | 18.75 |
| 2009-07-31 | 19 |
| 2009-08-03 | 19.42 |
| 2009-08-04 | 19.35 |
| 2009-08-05 | 19.46 |
| 2009-08-06 | 19.03 |
| 2009-08-07 | 18.64 |
| 2009-08-10 | 18.44 |
| 2009-08-11 | 18.56 |
| 2009-08-12 | 18.52 |
| 2009-08-13 | 19.12 |
| 2009-08-14 | 19.08 |
| 2009-08-17 | 18.36 |
| 2009-08-18 | 18.67 |
| 2009-08-19 | 18.37 |
| 2009-08-20 | 18.58 |
| 2009-08-21 | 18.83 |
| 2009-08-24 | 19.23 |
| 2009-08-25 | 19.3 |
| 2009-08-26 | 19.43 |
| 2009-08-27 | 19.49 |
| 2009-08-28 | 19.69 |
| 2009-08-31 | 19.56 |
| 2009-09-01 | 19.38 |
| 2009-09-02 | 19.3 |
| 2009-09-03 | 19.28 |
| 2009-09-04 | 19.55 |
| 2009-09-07 | 20 |
| 2009-09-08 | 20.03 |
| 2009-09-09 | 20.01 |
| 2009-09-10 | 19.99 |
| 2009-09-11 | 19.95 |
| 2009-09-14 | 19.94 |
| 2009-09-15 | 20.27 |
| 2009-09-16 | 20.51 |
| 2009-09-17 | 20.53 |
| 2009-09-18 | 20.64 |
| 2009-09-22 | 20.77 |
| 2009-09-23 | 20.56 |
| 2009-09-24 | 20.62 |
| 2009-09-25 | 20.63 |
| 2009-09-29 | 20.78 |
| 2009-09-30 | 21.02 |
| 2009-10-01 | 21.02 |
| 2009-10-05 | 20.65 |
| 2009-10-06 | 20.68 |
| 2009-10-07 | 20.65 |
| 2009-10-08 | 20.75 |
| 2009-10-09 | 20.59 |
| 2009-10-12 | 20.94 |
| 2009-10-14 | 21.2 |
| 2009-10-15 | 21.23 |
| 2009-10-16 | 21.32 |
| 2009-10-17 | 21.38 |
| 2009-10-20 | 21.31 |
| 2009-10-21 | 21.11 |
| 2009-10-22 | 20.84 |
| 2009-10-23 | 20.71 |
| 2009-10-26 | 20.37 |
| 2009-10-27 | 19.84 |
| 2009-10-28 | 19.78 |
| 2009-10-29 | 19.45 |
| 2009-10-30 | 18.19 |
| 2009-11-03 | 17.6 |
| 2009-11-04 | 18.12 |
| 2009-11-05 | 18.42 |
| 2009-11-06 | 18.88 |
| 2009-11-09 | 19.25 |
| 2009-11-10 | 19.29 |
| 2009-11-11 | 19.82 |
| 2009-11-12 | 19.59 |
| 2009-11-13 | 19.74 |
| 2009-11-16 | 19.97 |
| 2009-11-17 | 19.96 |
| 2009-11-18 | 19.98 |
| 2009-11-19 | 19.71 |
| 2009-11-20 | 19.89 |
| 2009-11-23 | 20.05 |
| 2009-11-24 | 20.05 |
| 2009-11-25 | 20.08 |
| 2009-11-26 | 19.77 |
| 2009-11-27 | 19.52 |
| 2009-11-30 | 19.88 |
| 2009-12-01 | 20.23 |
| 2009-12-02 | 20.26 |
| 2009-12-03 | 20.37 |
| 2009-12-04 | 20.34 |
| 2009-12-07 | 20.15 |
| 2009-12-08 | 20.43 |
| 2009-12-09 | 20.36 |
| 2009-12-10 | 20.45 |
| 2009-12-11 | 20.38 |
| 2009-12-14 | 20.32 |
| 2009-12-15 | 20.04 |
| 2009-12-16 | 20.06 |
| 2009-12-17 | 20.12 |
| 2009-12-18 | 19.93 |
| 2009-12-21 | 19.83 |
| 2009-12-22 | 20 |
| 2009-12-23 | 20.51 |
| 2009-12-24 | 20.64 |
| 2009-12-29 | 20.68 |
| 2009-12-30 | 20.67 |
| 2009-12-31 | 20.78 |
| 2010-01-04 | 20.96 |
| 2010-01-05 | 21.21 |
| 2010-01-06 | 21.24 |
| 2010-01-07 | 21.19 |
| 2010-01-08 | 21.16 |
| 2010-01-11 | 21.29 |
| 2010-01-12 | 21.09 |
| 2010-01-13 | 21.21 |
| 2010-01-14 | 21.38 |
| 2010-01-15 | 21.47 |
| 2010-01-18 | 21.62 |
| 2010-01-19 | 21.47 |
| 2010-01-20 | 20.99 |
| 2010-01-21 | 20.47 |
| 2010-01-22 | 20.32 |
| 2010-01-25 | 19.65 |
| 2010-01-27 | 18.95 |
| 2010-01-28 | 19.01 |
| 2010-01-29 | 18.67 |
| 2010-02-01 | 18.85 |
| 2010-02-02 | 18.59 |
| 2010-02-03 | 18.93 |
| 2010-02-04 | 18.6 |
| 2010-02-05 | 18.17 |
| 2010-02-06 | 18.36 |
| 2010-02-08 | 18.37 |
| 2010-02-09 | 18.54 |
| 2010-02-10 | 18.43 |
| 2010-02-11 | 18.62 |
| 2010-02-15 | 18.5 |
| 2010-02-16 | 18.67 |
| 2010-02-17 | 18.84 |
| 2010-02-18 | 18.73 |
| 2010-02-19 | 18.53 |
| 2010-02-22 | 18.49 |
| 2010-02-23 | 18.47 |
| 2010-02-24 | 18.42 |
| 2010-02-25 | 18.39 |
| 2010-02-26 | 18.54 |
| 2010-03-02 | 18.83 |
| 2010-03-03 | 19.09 |
| 2010-03-04 | 19.15 |
| 2010-03-05 | 19.18 |
| 2010-03-08 | 19.26 |
| 2010-03-09 | 19.11 |
| 2010-03-10 | 19.11 |
| 2010-03-11 | 19.11 |
| 2010-03-12 | 19.11 |
| 2010-03-15 | 19.03 |
| 2010-03-16 | 19.21 |
| 2010-03-17 | 19.36 |
| 2010-03-18 | 19.37 |
| 2010-03-19 | 19.45 |
| 2010-03-22 | 19.25 |
| 2010-03-23 | 19.29 |
| 2010-03-25 | 19.32 |
| 2010-03-26 | 19.41 |
| 2010-03-29 | 19.44 |
| 2010-03-30 | 19.41 |
| 2010-03-31 | 19.41 |
| 2010-04-01 | 19.56 |
| 2010-04-05 | 19.83 |
| 2010-04-06 | 19.83 |
| 2010-04-07 | 19.9 |
| 2010-04-08 | 19.71 |
| 2010-04-09 | 19.84 |
| 2010-04-12 | 19.77 |
| 2010-04-13 | 19.72 |
| 2010-04-15 | 19.59 |
| 2010-04-16 | 19.51 |
| 2010-04-19 | 19.32 |
| 2010-04-20 | 19.47 |
| 2010-04-21 | 19.58 |
| 2010-04-22 | 19.63 |
| 2010-04-23 | 19.69 |
| 2010-04-26 | 19.75 |
| 2010-04-27 | 19.33 |
| 2010-04-28 | 19.05 |
| 2010-04-29 | 19.16 |
| 2010-04-30 | 19.17 |
| 2010-05-03 | 19.06 |
| 2010-05-04 | 18.78 |
| 2010-05-05 | 18.76 |
| 2010-05-06 | 18.69 |
| 2010-05-07 | 18.36 |
| 2010-05-10 | 18.89 |
| 2010-05-11 | 18.67 |
| 2010-05-12 | 18.73 |
| 2010-05-13 | 18.85 |
| 2010-05-14 | 18.49 |
| 2010-05-17 | 18.39 |
| 2010-05-18 | 18.41 |
| 2010-05-19 | 17.93 |
| 2010-05-20 | 18.04 |
| 2010-05-21 | 17.91 |
| 2010-05-24 | 17.95 |
| 2010-05-25 | 17.47 |
| 2010-05-26 | 17.83 |
| 2010-05-27 | 18.07 |
| 2010-05-28 | 18.79 |
| 2010-05-31 | 18.97 |
| 2010-06-01 | 18.63 |
| 2010-06-02 | 18.81 |
| 2010-06-03 | 19.09 |
| 2010-06-04 | 19.14 |
| 2010-06-07 | 18.83 |
| 2010-06-08 | 18.66 |
| 2010-06-09 | 18.75 |
| 2010-06-10 | 19 |
| 2010-06-11 | 18.98 |
| 2010-06-14 | 19.21 |
| 2010-06-15 | 19.28 |
| 2010-06-16 | 19.31 |
| 2010-06-17 | 19.42 |
| 2010-06-18 | 19.35 |
| 2010-06-21 | 19.61 |
| 2010-06-22 | 19.52 |
| 2010-06-23 | 19.57 |
| 2010-06-24 | 19.54 |
| 2010-06-25 | 19.51 |
| 2010-06-28 | 19.8 |
| 2010-06-29 | 19.59 |
| 2010-06-30 | 19.76 |
| 2010-07-01 | 19.6 |
| 2010-07-02 | 19.59 |
| 2010-07-05 | 19.58 |
| 2010-07-06 | 19.73 |
| 2010-07-07 | 19.6 |
| 2010-07-08 | 19.76 |
| 2010-07-09 | 19.93 |
| 2010-07-12 | 20 |
| 2010-07-13 | 20.07 |
| 2010-07-14 | 20.02 |
| 2010-07-15 | 19.97 |
| 2010-07-16 | 20.07 |
| 2010-07-19 | 20.08 |
| 2010-07-20 | 20.01 |
| 2010-07-21 | 20.12 |
| 2010-07-22 | 20.19 |
| 2010-07-23 | 20.17 |
| 2010-07-26 | 20.02 |
| 2010-07-27 | 20.07 |
| 2010-07-28 | 20 |
| 2010-07-29 | 19.98 |
| 2010-07-30 | 19.92 |
| 2010-08-02 | 20.9 |
| 2010-08-03 | 20.95 |
| 2010-08-04 | 21.03 |
| 2010-08-05 | 20.99 |
| 2010-08-06 | 20.97 |
| 2010-08-09 | 21.05 |
| 2010-08-10 | 20.95 |
| 2010-08-11 | 20.85 |
| 2010-08-12 | 20.89 |
| 2010-08-13 | 21.03 |
| 2010-08-16 | 21.07 |
| 2010-08-17 | 21.09 |
| 2010-08-18 | 21.29 |
| 2010-08-19 | 21.43 |
| 2010-08-20 | 21.42 |
| 2010-08-23 | 21.54 |
| 2010-08-24 | 21.4 |
| 2010-08-25 | 21.23 |
| 2010-08-26 | 21.28 |
| 2010-08-27 | 21.08 |
| 2010-08-30 | 21.1 |
| 2010-08-31 | 20.93 |
| 2010-09-01 | 21.24 |
| 2010-09-02 | 21.27 |
| 2010-09-03 | 21.33 |
| 2010-09-06 | 21.66 |
| 2010-09-07 | 21.74 |
| 2010-09-08 | 21.78 |
| 2010-09-09 | 21.87 |
| 2010-09-13 | 22.32 |
| 2010-09-14 | 22.39 |
| 2010-09-15 | 22.54 |
| 2010-09-16 | 22.37 |
| 2010-09-17 | 22.58 |
| 2010-09-20 | 22.82 |
| 2010-09-21 | 22.81 |
| 2010-09-22 | 22.73 |
| 2010-09-23 | 22.65 |
| 2010-09-24 | 22.88 |
| 2010-09-27 | 23 |
| 2010-09-28 | 23.01 |
| 2010-09-29 | 22.85 |
| 2010-09-30 | 22.84 |
| 2010-10-01 | 23.42 |
| 2010-10-04 | 23.51 |
| 2010-10-05 | 23.55 |
| 2010-10-06 | 23.75 |
| 2010-10-07 | 23.59 |
| 2010-10-08 | 23.5 |
| 2010-10-11 | 23.81 |
| 2010-10-12 | 23.63 |
| 2010-10-13 | 24.07 |
| 2010-10-14 | 23.9 |
| 2010-10-15 | 23.49 |
| 2010-10-18 | 23.37 |
| 2010-10-19 | 23.24 |
| 2010-10-20 | 23.11 |
| 2010-10-21 | 23.53 |
| 2010-10-22 | 23.45 |
| 2010-10-25 | 23.58 |
| 2010-10-26 | 23.26 |
| 2010-10-27 | 23.05 |
| 2010-10-28 | 22.94 |
| 2010-10-29 | 22.99 |
| 2010-11-01 | 23.36 |
| 2010-11-02 | 23.4 |
| 2010-11-03 | 23.54 |
| 2010-11-04 | 23.6 |
| 2010-11-05 | 23.72 |
| 2010-11-08 | 23.61 |
| 2010-11-09 | 23.72 |
| 2010-11-10 | 23.67 |
| 2010-11-11 | 23.36 |
| 2010-11-12 | 22.87 |
| 2010-11-15 | 22.64 |
| 2010-11-16 | 22.16 |
| 2010-11-18 | 22.17 |
| 2010-11-19 | 21.77 |
| 2010-11-22 | 22.19 |
| 2010-11-23 | 21.91 |
| 2010-11-24 | 21.65 |
| 2010-11-25 | 21.33 |
| 2010-11-26 | 21.03 |
| 2010-11-29 | 21.29 |
| 2010-11-30 | 21.5 |
| 2010-12-01 | 21.92 |
| 2010-12-02 | 22.1 |
| 2010-12-03 | 21.92 |
| 2010-12-06 | 21.9 |
| 2010-12-07 | 21.79 |
| 2010-12-08 | 21.48 |
| 2010-12-09 | 20.87 |
| 2010-12-10 | 21.2 |
| 2010-12-13 | 21.46 |
| 2010-12-14 | 21.65 |
| 2010-12-15 | 21.44 |
| 2010-12-16 | 21.59 |
| 2010-12-20 | 21.58 |
| 2010-12-21 | 21.77 |
| 2010-12-22 | 21.74 |
| 2010-12-23 | 21.71 |
| 2010-12-24 | 21.79 |
| 2010-12-27 | 21.73 |
| 2010-12-28 | 21.73 |
| 2010-12-29 | 21.94 |
| 2010-12-30 | 22.08 |
| 2010-12-31 | 22.24 |
| 2011-01-03 | 22.36 |
| 2011-01-04 | 22.31 |
| 2011-01-05 | 22.07 |
| 2011-01-06 | 21.9 |
| 2011-01-07 | 21.38 |
| 2011-01-10 | 20.87 |
| 2011-01-11 | 20.82 |
| 2011-01-12 | 21.21 |
| 2011-01-13 | 20.86 |
| 2011-01-14 | 20.51 |
| 2011-01-17 | 20.45 |
| 2011-01-18 | 20.56 |
| 2011-01-19 | 20.47 |
| 2011-01-20 | 20.53 |
| 2011-01-21 | 20.36 |
| 2011-01-24 | 20.33 |
| 2011-01-25 | 20.11 |
| 2011-01-27 | 19.81 |
| 2011-01-28 | 19.4 |
| 2011-01-31 | 19.22 |
| 2011-02-01 | 18.92 |
| 2011-02-02 | 18.97 |
| 2011-02-03 | 19.26 |
| 2011-02-04 | 18.87 |
| 2011-02-07 | 18.84 |
| 2011-02-08 | 18.48 |
| 2011-02-09 | 18.15 |
| 2011-02-10 | 18.09 |
| 2011-02-11 | 18.42 |
| 2011-02-14 | 18.93 |
| 2011-02-15 | 19.01 |
| 2011-02-16 | 19.06 |
| 2011-02-17 | 19.27 |
| 2011-02-18 | 18.96 |
| 2011-02-21 | 19.12 |
| 2011-02-22 | 18.95 |
| 2011-02-23 | 18.87 |
| 2011-02-24 | 18.27 |
| 2011-02-25 | 18.38 |
| 2011-02-28 | 18.47 |
| 2011-03-01 | 19.1 |
| 2011-03-03 | 19.14 |
| 2011-03-04 | 19.15 |
| 2011-03-07 | 18.9 |
| 2011-03-08 | 19.1 |
| 2011-03-09 | 19.15 |
| 2011-03-10 | 19.06 |
| 2011-03-11 | 18.89 |
| 2011-03-14 | 19.14 |
| 2011-03-15 | 18.85 |
| 2011-03-16 | 19.08 |
| 2011-03-17 | 18.91 |
| 2011-03-18 | 18.7 |
| 2011-03-21 | 18.66 |
| 2011-03-22 | 18.82 |
| 2011-03-23 | 19.02 |
| 2011-03-24 | 19.16 |
| 2011-03-25 | 19.59 |
| 2011-03-28 | 19.7 |
| 2011-03-29 | 19.84 |
| 2011-03-30 | 20.05 |
| 2011-03-31 | 20.17 |
| 2011-04-01 | 20.23 |
| 2011-04-04 | 20.53 |
| 2011-04-05 | 20.59 |
| 2011-04-06 | 20.57 |
| 2011-04-07 | 20.61 |
| 2011-04-08 | 20.43 |
| 2011-04-11 | 20.43 |
| 2011-04-13 | 20.81 |
| 2011-04-15 | 20.54 |
| 2011-04-18 | 20.26 |
| 2011-04-19 | 20.26 |
| 2011-04-20 | 20.58 |
| 2011-04-21 | 20.63 |
| 2011-04-25 | 20.49 |
| 2011-04-26 | 20.46 |
| 2011-04-27 | 20.34 |
| 2011-04-28 | 20.16 |
| 2011-04-29 | 19.93 |
| 2011-05-02 | 19.73 |
| 2011-05-03 | 19.25 |
| 2011-05-04 | 19.14 |
| 2011-05-05 | 18.91 |
| 2011-05-06 | 19.18 |
| 2011-05-09 | 19.2 |
| 2011-05-10 | 19.16 |
| 2011-05-11 | 19.26 |
| 2011-05-12 | 19.01 |
| 2011-05-13 | 19.1 |
| 2011-05-16 | 18.95 |
| 2011-05-17 | 18.7 |
| 2011-05-18 | 18.63 |
| 2011-05-19 | 18.61 |
| 2011-05-20 | 18.72 |
| 2011-05-23 | 18.38 |
| 2011-05-24 | 18.39 |
| 2011-05-25 | 18.25 |
| 2011-05-26 | 18.38 |
| 2011-05-27 | 18.66 |
| 2011-05-30 | 18.71 |
| 2011-05-31 | 18.93 |
| 2011-06-01 | 19.04 |
| 2011-06-02 | 18.89 |
| 2011-06-03 | 18.8 |
| 2011-06-06 | 18.77 |
| 2011-06-07 | 18.87 |
| 2011-06-08 | 18.8 |
| 2011-06-09 | 18.78 |
| 2011-06-10 | 18.68 |
| 2011-06-13 | 18.68 |
| 2011-06-14 | 18.75 |
| 2011-06-15 | 18.59 |
| 2011-06-16 | 18.43 |
| 2011-06-17 | 18.32 |
| 2011-06-20 | 17.92 |
| 2011-06-21 | 17.96 |
| 2011-06-22 | 17.91 |
| 2011-06-23 | 18 |
| 2011-06-24 | 18.47 |
| 2011-06-27 | 18.68 |
| 2011-06-28 | 18.75 |
| 2011-06-29 | 18.91 |
| 2011-06-30 | 19.04 |
| 2011-07-01 | 19.03 |
| 2011-07-04 | 19.15 |
| 2011-07-05 | 19.1 |
| 2011-07-06 | 19.09 |
| 2011-07-07 | 19.39 |
| 2011-07-08 | 19.17 |
| 2011-07-11 | 19.02 |
| 2011-07-12 | 18.72 |
| 2011-07-13 | 18.92 |
| 2011-07-14 | 18.99 |
| 2011-07-15 | 18.93 |
| 2011-07-18 | 18.91 |
| 2011-07-19 | 19.02 |
| 2011-07-20 | 18.83 |
| 2011-07-21 | 18.73 |
| 2011-07-22 | 18.99 |
| 2011-07-25 | 19.11 |
| 2011-07-26 | 18.77 |
| 2011-07-27 | 18.67 |
| 2011-07-28 | 18.42 |
| 2011-07-29 | 18.29 |
| 2011-08-01 | 18.25 |
| 2011-08-02 | 18.06 |
| 2011-08-03 | 17.92 |
| 2011-08-04 | 17.74 |
| 2011-08-05 | 17.36 |
| 2011-08-08 | 17.07 |
| 2011-08-09 | 16.89 |
| 2011-08-10 | 17.19 |
| 2011-08-11 | 17.12 |
| 2011-08-12 | 16.94 |
| 2011-08-16 | 16.78 |
| 2011-08-17 | 16.83 |
| 2011-08-18 | 16.48 |
| 2011-08-19 | 16.2 |
| 2011-08-22 | 16.39 |
| 2011-08-23 | 16.55 |
| 2011-08-24 | 16.39 |
| 2011-08-25 | 16.22 |
| 2011-08-26 | 15.91 |
| 2011-08-29 | 16.46 |
| 2011-08-30 | 16.71 |
| 2011-09-02 | 16.89 |
| 2011-09-05 | 16.86 |
| 2011-09-06 | 16.98 |
| 2011-09-07 | 17.2 |
| 2011-09-08 | 17.27 |
| 2011-09-09 | 17 |
| 2011-09-12 | 16.64 |
| 2011-09-13 | 16.63 |
| 2011-09-14 | 16.81 |
| 2011-09-15 | 17 |
| 2011-09-16 | 17.03 |
| 2011-09-19 | 16.9 |
| 2011-09-20 | 17.19 |
| 2011-09-21 | 17.23 |
| 2011-09-22 | 16.58 |
| 2011-09-23 | 16.41 |
| 2011-09-26 | 16.25 |
| 2011-09-27 | 16.65 |
| 2011-09-28 | 16.55 |
| 2011-09-29 | 16.74 |
| 2011-09-30 | 16.55 |
| 2011-10-03 | 16.23 |
| 2011-10-04 | 15.99 |
| 2011-10-05 | 15.9 |
| 2011-10-07 | 16.28 |
| 2011-10-10 | 16.49 |
| 2011-10-11 | 16.51 |
| 2011-10-12 | 16.85 |
| 2011-10-13 | 16.81 |
| 2011-10-14 | 16.95 |
| 2011-10-17 | 16.92 |
| 2011-10-18 | 16.54 |
| 2011-10-19 | 16.82 |
| 2011-10-20 | 16.62 |
| 2011-10-21 | 16.48 |
| 2011-10-24 | 16.57 |
| 2011-10-25 | 16.78 |
| 2011-10-26 | 16.85 |
| 2011-10-28 | 17.32 |
| 2011-10-31 | 17.26 |
| 2011-11-01 | 17.65 |
| 2011-11-02 | 17.66 |
| 2011-11-03 | 17.69 |
| 2011-11-04 | 17.86 |
| 2011-11-08 | 17.8 |
| 2011-11-09 | 17.56 |
| 2011-11-11 | 17.57 |
| 2011-11-14 | 17.53 |
| 2011-11-15 | 17.26 |
| 2011-11-16 | 17.12 |
| 2011-11-17 | 16.81 |
| 2011-11-18 | 16.7 |
| 2011-11-21 | 16.33 |
| 2011-11-22 | 16.47 |
| 2011-11-23 | 16.12 |
| 2011-11-24 | 16.33 |
| 2011-11-25 | 16.24 |
| 2011-11-28 | 16.66 |
| 2011-11-29 | 16.51 |
| 2011-11-30 | 16.54 |
| 2011-12-01 | 16.82 |
| 2011-12-02 | 17.18 |
| 2011-12-05 | 17.17 |
| 2011-12-07 | 17.21 |
| 2011-12-08 | 16.83 |
| 2011-12-09 | 16.6 |
| 2011-12-12 | 16.26 |
| 2011-12-13 | 16.33 |
| 2011-12-14 | 16.2 |
| 2011-12-15 | 16.12 |
| 2011-12-16 | 15.81 |
| 2011-12-19 | 15.62 |
| 2011-12-20 | 15.36 |
| 2011-12-21 | 15.78 |
| 2011-12-22 | 15.93 |
| 2011-12-23 | 15.87 |
| 2011-12-26 | 16.05 |
| 2011-12-27 | 15.98 |
| 2011-12-28 | 15.83 |
| 2011-12-29 | 15.67 |
| 2011-12-30 | 15.62 |
| 2012-01-02 | 15.65 |
| 2012-01-03 | 16.07 |
| 2012-01-04 | 16.05 |
| 2012-01-05 | 16.05 |
| 2012-01-06 | 16.05 |
| 2012-01-07 | 16.06 |
| 2012-01-09 | 16.08 |
| 2012-01-10 | 16.44 |
| 2012-01-11 | 16.53 |
| 2012-01-12 | 16.5 |
| 2012-01-13 | 16.55 |
| 2012-01-16 | 16.57 |
| 2012-01-17 | 16.84 |
| 2012-01-18 | 16.77 |
| 2012-01-19 | 16.98 |
| 2012-01-20 | 17.07 |
| 2012-01-23 | 17.07 |
| 2012-01-24 | 17.3 |
| 2012-01-25 | 17.47 |
| 2012-01-27 | 17.62 |
| 2012-01-30 | 17.23 |
| 2012-01-31 | 17.61 |
| 2012-02-01 | 17.76 |
| 2012-02-02 | 17.91 |
| 2012-02-03 | 18.1 |
| 2012-02-06 | 18.3 |
| 2012-02-07 | 18.21 |
| 2012-02-08 | 18.36 |
| 2012-02-09 | 18.53 |
| 2012-02-10 | 18.23 |
| 2012-02-13 | 18.25 |
| 2012-02-14 | 18.33 |
| 2012-02-15 | 18.72 |
| 2012-02-16 | 18.77 |
| 2012-02-17 | 18.96 |
| 2012-02-21 | 19.11 |
| 2012-02-22 | 18.67 |
| 2012-02-23 | 18.66 |
| 2012-02-24 | 18.5 |
| 2012-02-27 | 17.98 |
| 2012-02-28 | 18.51 |
| 2012-02-29 | 18.59 |
| 2012-03-01 | 18.45 |
| 2012-03-02 | 18.5 |
| 2012-03-03 | 18.51 |
| 2012-03-05 | 18.25 |
| 2012-03-06 | 18.06 |
| 2012-03-07 | 18.04 |
| 2012-03-09 | 18.45 |
| 2012-03-12 | 18.53 |
| 2012-03-13 | 18.76 |
| 2012-03-14 | 18.87 |
| 2012-03-15 | 18.57 |
| 2012-03-16 | 18.36 |
| 2012-03-19 | 18.15 |
| 2012-03-20 | 18.23 |
| 2012-03-21 | 18.55 |
| 2012-03-22 | 18.1 |
| 2012-03-23 | 18.26 |
| 2012-03-26 | 17.95 |
| 2012-03-27 | 18.11 |
| 2012-03-28 | 17.94 |
| 2012-03-29 | 17.92 |
| 2012-03-30 | 18.34 |
| 2012-04-02 | 18.45 |
| 2012-04-03 | 18.61 |
| 2012-04-04 | 18.52 |
| 2012-04-09 | 18.23 |
| 2012-04-10 | 18.24 |
| 2012-04-11 | 18.16 |
| 2012-04-12 | 18.32 |
| 2012-04-13 | 18.05 |
| 2012-04-16 | 18.16 |
| 2012-04-17 | 18.36 |
| 2012-04-18 | 18.39 |
| 2012-04-19 | 18.43 |
| 2012-04-20 | 18.28 |
| 2012-04-23 | 17.97 |
| 2012-04-24 | 18 |
| 2012-04-25 | 17.92 |
| 2012-04-26 | 17.86 |
| 2012-04-27 | 17.81 |
| 2012-04-28 | 17.88 |
| 2012-04-30 | 18.01 |
| 2012-05-02 | 17.91 |
| 2012-05-03 | 17.73 |
| 2012-05-04 | 17.37 |
| 2012-05-07 | 17.51 |
| 2012-05-08 | 17.12 |
| 2012-05-09 | 16.96 |
| 2012-05-10 | 16.94 |
| 2012-05-11 | 16.81 |
| 2012-05-14 | 16.92 |
| 2012-05-15 | 17.01 |
| 2012-05-16 | 16.73 |
| 2012-05-17 | 16.77 |
| 2012-05-18 | 16.81 |
| 2012-05-21 | 16.7 |
| 2012-05-22 | 16.55 |
| 2012-05-23 | 16.46 |
| 2012-05-24 | 16.73 |
| 2012-05-25 | 16.76 |
| 2012-05-28 | 16.97 |
| 2012-05-29 | 16.99 |
| 2012-05-30 | 16.84 |
| 2012-05-31 | 16.8 |
| 2012-06-01 | 16.55 |
| 2012-06-04 | 16.26 |
| 2012-06-05 | 16.32 |
| 2012-06-06 | 16.64 |
| 2012-06-07 | 16.79 |
| 2012-06-08 | 16.73 |
| 2012-06-11 | 16.68 |
| 2012-06-12 | 16.85 |
| 2012-06-13 | 16.87 |
| 2012-06-14 | 16.64 |
| 2012-06-15 | 16.87 |
| 2012-06-18 | 16.66 |
| 2012-06-19 | 16.76 |
| 2012-06-20 | 16.85 |
| 2012-06-21 | 17.01 |
| 2012-06-22 | 16.96 |
| 2012-06-25 | 16.89 |
| 2012-06-26 | 16.92 |
| 2012-06-27 | 16.99 |
| 2012-06-28 | 17.01 |
| 2012-06-29 | 17.41 |
| 2012-07-02 | 17.45 |
| 2012-07-03 | 17.52 |
| 2012-07-04 | 17.59 |
| 2012-07-05 | 17.69 |
| 2012-07-06 | 17.63 |
| 2012-07-09 | 17.47 |
| 2012-07-10 | 17.69 |
| 2012-07-11 | 17.58 |
| 2012-07-12 | 17.39 |
| 2012-07-13 | 17.25 |
| 2012-07-16 | 17.13 |
| 2012-07-17 | 17.08 |
| 2012-07-18 | 17.15 |
| 2012-07-19 | 17.2 |
| 2012-07-20 | 17.12 |
| 2012-07-23 | 16.91 |
| 2012-07-24 | 16.89 |
| 2012-07-25 | 16.82 |
| 2012-07-26 | 16.59 |
| 2012-07-27 | 16.53 |
| 2012-07-30 | 16.84 |
| 2012-07-31 | 16.94 |
| 2012-08-01 | 17 |
| 2012-08-02 | 16.97 |
| 2012-08-03 | 16.96 |
| 2012-08-06 | 17.16 |
| 2012-08-07 | 17.3 |
| 2012-08-08 | 17.28 |
| 2012-08-09 | 17.22 |
| 2012-08-10 | 17.2 |
| 2012-08-13 | 17.37 |
| 2012-08-14 | 17.66 |
| 2012-08-16 | 17.68 |
| 2012-08-17 | 18.1 |
| 2012-08-21 | 18.3 |
| 2012-08-22 | 18.28 |
| 2012-08-23 | 18.28 |
| 2012-08-24 | 18.19 |
| 2012-08-27 | 18.11 |
| 2012-08-28 | 18.07 |
| 2012-08-29 | 17.93 |
| 2012-08-30 | 18.01 |
| 2012-08-31 | 17.85 |
| 2012-09-03 | 17.84 |
| 2012-09-04 | 17.93 |
| 2012-09-05 | 17.78 |
| 2012-09-06 | 17.83 |
| 2012-09-07 | 18.13 |
| 2012-09-08 | 18.2 |
| 2012-09-10 | 18.23 |
| 2012-09-11 | 18.33 |
| 2012-09-12 | 18.44 |
| 2012-09-13 | 18.45 |
| 2012-09-14 | 18.84 |
| 2012-09-17 | 18.99 |
| 2012-09-18 | 19.03 |
| 2012-09-20 | 18.89 |
| 2012-09-21 | 19.31 |
| 2012-09-24 | 19.29 |
| 2012-09-25 | 19.33 |
| 2012-09-26 | 19.32 |
| 2012-09-27 | 19.32 |
| 2012-09-28 | 19.3 |
| 2012-10-01 | 19.38 |
| 2012-10-03 | 19.45 |
| 2012-10-04 | 19.62 |
| 2012-10-05 | 19.49 |
| 2012-10-08 | 19.28 |
| 2012-10-09 | 19.38 |
| 2012-10-10 | 19.19 |
| 2012-10-11 | 19.38 |
| 2012-10-12 | 19.25 |
| 2012-10-15 | 19.27 |
| 2012-10-16 | 19.09 |
| 2012-10-17 | 19.1 |
| 2012-10-18 | 19.3 |
| 2012-10-19 | 19.15 |
| 2012-10-22 | 19.11 |
| 2012-10-23 | 18.98 |
| 2012-10-25 | 19 |
| 2012-10-26 | 18.75 |
| 2012-10-29 | 18.69 |
| 2012-10-30 | 18.45 |
| 2012-10-31 | 18.49 |
| 2012-11-01 | 18.56 |
| 2012-11-02 | 18.66 |
| 2012-11-05 | 18.67 |
| 2012-11-06 | 18.73 |
| 2012-11-07 | 18.82 |
| 2012-11-08 | 18.68 |
| 2012-11-09 | 18.11 |
| 2012-11-12 | 17.54 |
| 2012-11-13 | 17.53 |
| 2012-11-15 | 17.46 |
| 2012-11-16 | 17.28 |
| 2012-11-19 | 17.23 |
| 2012-11-20 | 17.19 |
| 2012-11-21 | 17.31 |
| 2012-11-22 | 17.36 |
| 2012-11-23 | 17.37 |
| 2012-11-26 | 17.43 |
| 2012-11-27 | 17.7 |
| 2012-11-29 | 17.97 |
| 2012-11-30 | 18.16 |
| 2012-12-03 | 18.22 |
| 2012-12-04 | 18.28 |
| 2012-12-05 | 18.32 |
| 2012-12-06 | 18.43 |
| 2012-12-07 | 18.37 |
| 2012-12-10 | 18.41 |
| 2012-12-11 | 18.35 |
| 2012-12-12 | 18.32 |
| 2012-12-13 | 18.18 |
| 2012-12-14 | 18.28 |
| 2012-12-17 | 18.27 |
| 2012-12-18 | 18.4 |
| 2012-12-19 | 18.51 |
| 2012-12-20 | 18.47 |
| 2012-12-21 | 18.24 |
| 2012-12-24 | 18.23 |
| 2012-12-26 | 18.37 |
| 2012-12-27 | 18.27 |
| 2012-12-28 | 18.4 |
| 2012-12-31 | 18.43 |
| 2013-01-01 | 18.6 |
| 2013-01-02 | 18.72 |
| 2013-01-03 | 18.79 |
| 2013-01-04 | 18.82 |
| 2013-01-07 | 18.77 |
| 2013-01-08 | 18.8 |
| 2013-01-09 | 18.71 |
| 2013-01-10 | 18.68 |
| 2013-01-11 | 18.56 |
| 2013-01-14 | 18.79 |
| 2013-01-15 | 18.85 |
| 2013-01-16 | 18.59 |
| 2013-01-17 | 18.68 |
| 2013-01-18 | 18.63 |
| 2013-01-21 | 18.6 |
| 2013-01-22 | 18.39 |
| 2013-01-23 | 18.36 |
| 2013-01-24 | 18.09 |
| 2013-01-25 | 18.29 |
| 2013-01-28 | 18.24 |
| 2013-01-29 | 18.15 |
| 2013-01-30 | 18.14 |
| 2013-01-31 | 18.05 |
| 2013-02-01 | 17.99 |
| 2013-02-04 | 17.95 |
| 2013-02-05 | 17.84 |
| 2013-02-06 | 17.87 |
| 2013-02-07 | 17.76 |
| 2013-02-08 | 17.63 |
| 2013-02-11 | 17.63 |
| 2013-02-12 | 17.7 |
| 2013-02-13 | 17.85 |
| 2013-02-14 | 17.75 |
| 2013-02-15 | 17.73 |
| 2013-02-18 | 17.8 |
| 2013-02-19 | 18.07 |
| 2013-02-20 | 18.15 |
| 2013-02-21 | 17.84 |
| 2013-02-22 | 17.85 |
| 2013-02-25 | 17.79 |
| 2013-02-26 | 17.5 |
| 2013-02-27 | 17.55 |
| 2013-02-28 | 17.21 |
| 2013-03-01 | 17.3 |
| 2013-03-04 | 17.2 |
| 2013-03-05 | 17.48 |
| 2013-03-06 | 17.6 |
| 2013-03-07 | 17.73 |
| 2013-03-08 | 17.96 |
| 2013-03-11 | 17.92 |
| 2013-03-12 | 17.83 |
| 2013-03-13 | 17.63 |
| 2013-03-14 | 17.79 |
| 2013-03-15 | 17.68 |
| 2013-03-18 | 17.58 |
| 2013-03-19 | 17.33 |
| 2013-03-20 | 17.12 |
| 2013-03-21 | 16.99 |
| 2013-03-22 | 16.96 |
| 2013-03-25 | 16.91 |
| 2013-03-26 | 16.92 |
| 2013-03-28 | 17.09 |
| 2013-04-01 | 17.17 |
| 2013-04-02 | 17.33 |
| 2013-04-03 | 17.14 |
| 2013-04-04 | 16.83 |
| 2013-04-05 | 16.79 |
| 2013-04-08 | 16.77 |
| 2013-04-09 | 16.63 |
| 2013-04-10 | 16.79 |
| 2013-04-11 | 16.87 |
| 2013-04-12 | 16.74 |
| 2013-04-15 | 16.83 |
| 2013-04-16 | 17.14 |
| 2013-04-17 | 17.06 |
| 2013-04-18 | 17.31 |
| 2013-04-22 | 17.49 |
| 2013-04-23 | 17.48 |
| 2013-04-25 | 17.68 |
| 2013-04-26 | 17.46 |
| 2013-04-29 | 17.54 |
| 2013-04-30 | 17.62 |
| 2013-05-02 | 17.8 |
| 2013-05-03 | 17.66 |
| 2013-05-06 | 17.77 |
| 2013-05-07 | 17.97 |
| 2013-05-08 | 18 |
| 2013-05-09 | 17.9 |
| 2013-05-10 | 17.97 |
| 2013-05-11 | 18.01 |
| 2013-05-13 | 17.62 |
| 2013-05-14 | 17.67 |
| 2013-05-15 | 18.08 |
| 2013-05-16 | 18.1 |
| 2013-05-17 | 18.17 |
| 2013-05-20 | 18.18 |
| 2013-05-21 | 18.06 |
| 2013-05-22 | 17.99 |
| 2013-05-23 | 17.63 |
| 2013-05-24 | 17.76 |
| 2013-05-27 | 18.04 |
| 2013-05-28 | 18.1 |
| 2013-05-29 | 18.15 |
| 2013-05-30 | 18.18 |
| 2013-05-31 | 17.82 |
| 2013-06-03 | 17.77 |
| 2013-06-04 | 17.75 |
| 2013-06-05 | 17.76 |
| 2013-06-06 | 17.85 |
| 2013-06-07 | 17.73 |
| 2013-06-10 | 17.79 |
| 2013-06-11 | 17.56 |
| 2013-06-12 | 17.45 |
| 2013-06-13 | 17.32 |
| 2013-06-14 | 17.63 |
| 2013-06-17 | 17.82 |
| 2013-06-18 | 17.57 |
| 2013-06-19 | 17.63 |
| 2013-06-20 | 17.18 |
| 2013-06-21 | 17.12 |
| 2013-06-24 | 16.86 |
| 2013-06-25 | 16.88 |
| 2013-06-26 | 16.82 |
| 2013-06-27 | 17.06 |
| 2013-06-28 | 17.52 |
| 2013-07-01 | 17.77 |
| 2013-07-02 | 17.65 |
| 2013-07-03 | 17.39 |
| 2013-07-04 | 17.56 |
| 2013-07-05 | 17.64 |
| 2013-07-08 | 17.51 |
| 2013-07-09 | 17.66 |
| 2013-07-10 | 17.55 |
| 2013-07-11 | 17.84 |
| 2013-07-12 | 18.02 |
| 2013-07-15 | 18.11 |
| 2013-07-16 | 17.88 |
| 2013-07-17 | 17.87 |
| 2013-07-18 | 18.07 |
| 2013-07-19 | 18.01 |
| 2013-07-22 | 18 |
| 2013-07-23 | 18.09 |
| 2013-07-24 | 17.79 |
| 2013-07-25 | 17.51 |
| 2013-07-26 | 17.39 |
| 2013-07-29 | 17.13 |
| 2013-07-30 | 16.87 |
| 2013-07-31 | 16.8 |
| 2013-08-01 | 16.72 |
| 2013-08-02 | 16.55 |
| 2013-08-05 | 16.61 |
| 2013-08-06 | 16.19 |
| 2013-08-07 | 16.18 |
| 2013-08-08 | 16.32 |
| 2013-08-12 | 16.46 |
| 2013-08-13 | 16.75 |
| 2013-08-14 | 16.86 |
| 2013-08-16 | 16.29 |
| 2013-08-19 | 15.33 |
| 2013-08-20 | 15.43 |
| 2013-08-21 | 15.17 |
| 2013-08-22 | 15.43 |
| 2013-08-23 | 15.6 |
| 2013-08-26 | 15.64 |
| 2013-08-27 | 15.16 |
| 2013-08-28 | 15.11 |
| 2013-08-29 | 15.43 |
| 2013-08-30 | 15.59 |
| 2013-09-02 | 15.81 |
| 2013-09-03 | 15.34 |
| 2013-09-04 | 15.61 |
| 2013-09-05 | 15.98 |
| 2013-09-06 | 16.19 |
| 2013-09-10 | 16.83 |
| 2013-09-11 | 16.92 |
| 2013-09-12 | 16.76 |
| 2013-09-13 | 16.78 |
| 2013-09-16 | 16.74 |
| 2013-09-17 | 16.76 |
| 2013-09-18 | 16.88 |
| 2013-09-19 | 17.45 |
| 2013-09-20 | 17.19 |
| 2013-09-23 | 16.9 |
| 2013-09-24 | 16.9 |
| 2013-09-25 | 16.88 |
| 2013-09-26 | 16.9 |
| 2013-09-27 | 16.68 |
| 2013-09-30 | 16.44 |
| 2013-10-01 | 16.56 |
| 2013-10-03 | 16.9 |
| 2013-10-04 | 16.91 |
| 2013-10-07 | 16.93 |
| 2013-10-08 | 16.99 |
| 2013-10-09 | 17.2 |
| 2013-10-10 | 17.25 |
| 2013-10-11 | 17.42 |
| 2013-10-14 | 17.48 |
| 2013-10-15 | 17.37 |
| 2013-10-17 | 17.19 |
| 2013-10-18 | 17.52 |
| 2013-10-21 | 17.61 |
| 2013-10-22 | 17.59 |
| 2013-10-23 | 17.46 |
| 2013-10-24 | 17.42 |
| 2013-10-25 | 17.32 |
| 2013-10-28 | 17.19 |
| 2013-10-29 | 17.53 |
| 2013-10-30 | 17.61 |
| 2013-10-31 | 17.78 |
| 2013-11-01 | 17.83 |
| 2013-11-03 | 17.9 |
| 2013-11-05 | 17.81 |
| 2013-11-06 | 17.76 |
| 2013-11-07 | 17.6 |
| 2013-11-08 | 17.54 |
| 2013-11-11 | 17.35 |
| 2013-11-12 | 17.19 |
| 2013-11-13 | 17.11 |
| 2013-11-14 | 17.43 |
| 2013-11-18 | 17.74 |
| 2013-11-19 | 17.93 |
| 2013-11-20 | 17.76 |
| 2013-11-21 | 17.43 |
| 2013-11-22 | 17.81 |
| 2013-11-25 | 18.06 |
| 2013-11-26 | 18 |
| 2013-11-27 | 18.08 |
| 2013-11-28 | 18.18 |
| 2013-11-29 | 18.42 |
| 2013-12-02 | 18.55 |
| 2013-12-03 | 18.52 |
| 2013-12-04 | 18.4 |
| 2013-12-05 | 18.59 |
| 2013-12-06 | 18.62 |
| 2013-12-09 | 18.88 |
| 2013-12-10 | 18.79 |
| 2013-12-11 | 18.72 |
| 2013-12-12 | 18.55 |
| 2013-12-13 | 18.34 |
| 2013-12-16 | 18.32 |
| 2013-12-17 | 18.36 |
| 2013-12-18 | 18.59 |
| 2013-12-19 | 18.47 |
| 2013-12-20 | 18.78 |
| 2013-12-23 | 18.85 |
| 2013-12-24 | 18.84 |
| 2013-12-26 | 18.88 |
| 2013-12-27 | 18.98 |
| 2013-12-30 | 18.92 |
| 2013-12-31 | 18.99 |
| 2014-01-01 | 19.02 |
| 2014-01-02 | 18.74 |
| 2014-01-03 | 18.74 |
| 2014-01-06 | 18.72 |
| 2014-01-07 | 18.63 |
| 2014-01-08 | 18.68 |
| 2014-01-09 | 18.63 |
| 2014-01-10 | 18.56 |
| 2014-01-13 | 18.79 |
| 2014-01-14 | 18.71 |
| 2014-01-15 | 18.9 |
| 2014-01-16 | 18.84 |
| 2014-01-17 | 18.63 |
| 2014-01-20 | 18.6 |
| 2014-01-21 | 18.64 |
| 2014-01-22 | 18.69 |
| 2014-01-23 | 18.72 |
| 2014-01-24 | 18.46 |
| 2014-01-27 | 18.02 |
| 2014-01-28 | 18 |
| 2014-01-29 | 17.99 |
| 2014-01-30 | 17.8 |
| 2014-01-31 | 17.89 |
| 2014-02-03 | 17.64 |
| 2014-02-04 | 17.66 |
| 2014-02-05 | 17.73 |
| 2014-02-06 | 17.56 |
| 2014-02-07 | 17.63 |
| 2014-02-10 | 17.64 |
| 2014-02-11 | 17.66 |
| 2014-02-12 | 17.71 |
| 2014-02-13 | 17.47 |
| 2014-02-14 | 17.58 |
| 2014-02-17 | 17.62 |
| 2014-02-18 | 17.91 |
| 2014-02-19 | 17.94 |
| 2014-02-20 | 17.8 |
| 2014-02-21 | 17.5 |
| 2014-02-24 | 17.59 |
| 2014-02-25 | 17.63 |
| 2014-02-26 | 17.71 |
| 2014-02-28 | 17.93 |
| 2014-03-03 | 17.81 |
| 2014-03-04 | 18.02 |
| 2014-03-05 | 18.13 |
| 2014-03-06 | 18.34 |
| 2014-03-07 | 18.62 |
| 2014-03-10 | 18.66 |
| 2014-03-11 | 18.59 |
| 2014-03-12 | 18.6 |
| 2014-03-13 | 18.52 |
| 2014-03-14 | 18.53 |
| 2014-03-18 | 18.62 |
| 2014-03-19 | 18.66 |
| 2014-03-20 | 18.56 |
| 2014-03-21 | 18.62 |
| 2014-03-22 | 18.64 |
| 2014-03-24 | 18.84 |
| 2014-03-25 | 18.89 |
| 2014-03-26 | 18.94 |
| 2014-03-27 | 19.06 |
| 2014-03-28 | 18.9 |
| 2014-03-31 | 18.98 |
| 2014-04-01 | 19.01 |
| 2014-04-02 | 19.16 |
| 2014-04-03 | 19.09 |
| 2014-04-04 | 19.02 |
| 2014-04-07 | 19.03 |
| 2014-04-09 | 19.32 |
| 2014-04-10 | 19.37 |
| 2014-04-11 | 19.33 |
| 2014-04-15 | 19.19 |
| 2014-04-16 | 19.01 |
| 2014-04-17 | 19.28 |
| 2014-04-21 | 19.4 |
| 2014-04-22 | 19.4 |
| 2014-04-23 | 19.46 |
| 2014-04-25 | 19.34 |
| 2014-04-28 | 19.31 |
| 2014-04-29 | 19.2 |
| 2014-04-30 | 19.06 |
| 2014-05-02 | 19.02 |
| 2014-05-05 | 18.93 |
| 2014-05-06 | 19 |
| 2014-05-07 | 18.86 |
| 2014-05-08 | 18.82 |
| 2014-05-09 | 19.34 |
| 2014-05-12 | 19.67 |
| 2014-05-13 | 19.92 |
| 2014-05-14 | 19.96 |
| 2014-05-15 | 19.94 |
| 2014-05-16 | 20.21 |
| 2014-05-19 | 20.57 |
| 2014-05-20 | 20.68 |
| 2014-05-21 | 20.61 |
| 2014-05-22 | 20.78 |
| 2014-05-23 | 21.07 |
| 2014-05-26 | 20.91 |
| 2014-05-27 | 20.74 |
| 2014-05-28 | 20.8 |
| 2014-05-29 | 20.41 |
| 2014-05-30 | 20.46 |
| 2014-06-02 | 20.84 |
| 2014-06-03 | 20.86 |
| 2014-06-04 | 20.93 |
| 2014-06-05 | 21.15 |
| 2014-06-06 | 21.57 |
| 2014-06-09 | 21.77 |
| 2014-06-10 | 21.79 |
| 2014-06-11 | 21.65 |
| 2014-06-12 | 21.76 |
| 2014-06-13 | 21.39 |
| 2014-06-16 | 21.4 |
| 2014-06-17 | 21.67 |
| 2014-06-18 | 21.47 |
| 2014-06-19 | 21.4 |
| 2014-06-20 | 21.25 |
| 2014-06-23 | 21.26 |
| 2014-06-24 | 21.52 |
| 2014-06-25 | 21.52 |
| 2014-06-26 | 21.35 |
| 2014-06-27 | 21.41 |
| 2014-06-30 | 21.74 |
| 2014-07-01 | 21.84 |
| 2014-07-02 | 22.12 |
| 2014-07-03 | 22.09 |
| 2014-07-04 | 22.16 |
| 2014-07-07 | 22.25 |
| 2014-07-08 | 21.65 |
| 2014-07-09 | 21.48 |
| 2014-07-10 | 21.47 |
| 2014-07-11 | 21.02 |
| 2014-07-14 | 21.05 |
| 2014-07-15 | 21.32 |
| 2014-07-16 | 21.6 |
| 2014-07-17 | 21.69 |
| 2014-07-18 | 21.65 |
| 2014-07-21 | 21.67 |
| 2014-07-22 | 21.81 |
| 2014-07-23 | 21.82 |
| 2014-07-24 | 21.89 |
| 2014-07-25 | 21.7 |
| 2014-07-28 | 21.57 |
| 2014-07-30 | 21.68 |
| 2014-07-31 | 21.47 |
| 2014-08-01 | 21.04 |
| 2014-08-04 | 21.25 |
| 2014-08-05 | 21.42 |
| 2014-08-06 | 21.21 |
| 2014-08-07 | 21.15 |
| 2014-08-08 | 20.81 |
| 2014-08-11 | 20.9 |
| 2014-08-12 | 20.94 |
| 2014-08-13 | 20.86 |
| 2014-08-14 | 20.92 |
| 2014-08-18 | 21.05 |
| 2014-08-19 | 21.16 |
| 2014-08-20 | 21.15 |
| 2014-08-21 | 21.28 |
| 2014-08-22 | 21.33 |
| 2014-08-25 | 21.24 |
| 2014-08-26 | 21.24 |
| 2014-08-27 | 21.33 |
| 2014-08-28 | 21.34 |
| 2014-09-01 | 21.61 |
| 2014-09-02 | 21.76 |
| 2014-09-03 | 21.88 |
| 2014-09-04 | 21.83 |
| 2014-09-05 | 21.82 |
| 2014-09-08 | 22.34 |
| 2014-09-09 | 22.34 |
| 2014-09-10 | 22.21 |
| 2014-09-11 | 22.26 |
| 2014-09-12 | 22.32 |
| 2014-09-15 | 22.21 |
| 2014-09-16 | 21.78 |
| 2014-09-17 | 21.88 |
| 2014-09-18 | 22.28 |
| 2014-09-19 | 21.84 |
| 2014-09-22 | 21.9 |
| 2014-09-23 | 21.52 |
| 2014-09-24 | 21.43 |
| 2014-09-25 | 21.11 |
| 2014-09-26 | 21.29 |
| 2014-09-29 | 21.34 |
| 2014-09-30 | 21.37 |
| 2014-10-01 | 21.31 |
| 2014-10-07 | 21.06 |
| 2014-10-08 | 21.04 |
| 2014-10-09 | 21.37 |
| 2014-10-10 | 21.08 |
| 2014-10-13 | 21.05 |
| 2014-10-14 | 21.01 |
| 2014-10-16 | 20.63 |
| 2014-10-17 | 20.72 |
| 2014-10-20 | 20.99 |
| 2014-10-21 | 21.08 |
| 2014-10-22 | 21.23 |
| 2014-10-23 | 21.32 |
| 2014-10-27 | 21.24 |
| 2014-10-28 | 21.3 |
| 2014-10-29 | 21.46 |
| 2014-10-30 | 21.61 |
| 2014-10-31 | 22 |
| 2014-11-03 | 22.04 |
| 2014-11-05 | 22.02 |
| 2014-11-07 | 21.86 |
| 2014-11-10 | 21.81 |
| 2014-11-11 | 21.87 |
| 2014-11-12 | 21.91 |
| 2014-11-13 | 21.83 |
| 2014-11-14 | 21.92 |
| 2014-11-17 | 22.04 |
| 2014-11-18 | 22.09 |
| 2014-11-19 | 21.94 |
| 2014-11-20 | 22.08 |
| 2014-11-21 | 22.17 |
| 2014-11-24 | 22.25 |
| 2014-11-25 | 22 |
| 2014-11-26 | 22.05 |
| 2014-11-27 | 22.12 |
| 2014-11-28 | 22.34 |
| 2014-12-01 | 22.27 |
| 2014-12-02 | 22.27 |
| 2014-12-03 | 22.4 |
| 2014-12-04 | 22.48 |
| 2014-12-05 | 22.38 |
| 2014-12-08 | 22.13 |
| 2014-12-09 | 21.84 |
| 2014-12-10 | 21.93 |
| 2014-12-11 | 21.77 |
| 2014-12-12 | 21.56 |
| 2014-12-15 | 21.51 |
| 2014-12-16 | 21.13 |
| 2014-12-17 | 21 |
| 2014-12-18 | 21.42 |
| 2014-12-19 | 21.57 |
| 2014-12-22 | 21.86 |
| 2014-12-23 | 21.73 |
| 2014-12-24 | 21.56 |
| 2014-12-26 | 21.63 |
| 2014-12-29 | 21.78 |
| 2014-12-30 | 21.83 |
| 2014-12-31 | 21.96 |
| 2015-01-01 | 22 |
| 2015-01-02 | 22.26 |
| 2015-01-05 | 22.23 |
| 2015-01-06 | 21.58 |
| 2015-01-07 | 21.54 |
| 2015-01-08 | 21.9 |
| 2015-01-09 | 21.99 |
| 2015-01-12 | 22.1 |
| 2015-01-13 | 22.05 |
| 2015-01-14 | 21.99 |
| 2015-01-15 | 22.48 |
| 2015-01-16 | 22.54 |
| 2015-01-19 | 22.61 |
| 2015-01-20 | 22.89 |
| 2015-01-21 | 22.93 |
| 2015-01-22 | 22.96 |
| 2015-01-23 | 23.15 |
| 2015-01-27 | 23.34 |
| 2015-01-28 | 23.37 |
| 2015-01-29 | 23.48 |
| 2015-01-30 | 23.16 |
| 2015-02-02 | 23.23 |
| 2015-02-03 | 23.11 |
| 2015-02-04 | 23.14 |
| 2015-02-05 | 23.39 |
| 2015-02-06 | 23.25 |
| 2015-02-09 | 23.26 |
| 2015-02-10 | 23.39 |
| 2015-02-11 | 23.77 |
| 2015-02-12 | 24.03 |
| 2015-02-13 | 24.25 |
| 2015-02-16 | 24.14 |
| 2015-02-18 | 24.6 |
| 2015-02-19 | 24.95 |
| 2015-02-20 | 24.74 |
| 2015-02-23 | 24.56 |
| 2015-02-24 | 24.56 |
| 2015-02-25 | 24.58 |
| 2015-02-26 | 24.34 |
| 2015-02-27 | 24.79 |
| 2015-02-28 | 24.92 |
| 2015-03-02 | 25.12 |
| 2015-03-03 | 25.28 |
| 2015-03-04 | 25.06 |
| 2015-03-05 | 25.13 |
| 2015-03-09 | 24.79 |
| 2015-03-10 | 24.68 |
| 2015-03-11 | 24.63 |
| 2015-03-12 | 24.9 |
| 2015-03-13 | 24.54 |
| 2015-03-16 | 24.47 |
| 2015-03-17 | 24.73 |
| 2015-03-18 | 24.67 |
| 2015-03-19 | 24.53 |
| 2015-03-20 | 24.29 |
| 2015-03-23 | 24.19 |
| 2015-03-24 | 24.16 |
| 2015-03-25 | 24.12 |
| 2015-03-26 | 23.68 |
| 2015-03-27 | 23.84 |
| 2015-03-30 | 24.27 |
| 2015-03-31 | 24.3 |
| 2015-04-01 | 24.58 |
| 2015-04-06 | 24.84 |
| 2015-04-07 | 24.9 |
| 2015-04-08 | 25.07 |
| 2015-04-09 | 25.21 |
| 2015-04-10 | 25.26 |
| 2015-04-13 | 25.41 |
| 2015-04-15 | 25.19 |
| 2015-04-16 | 25.06 |
| 2015-04-17 | 24.74 |
| 2015-04-20 | 24.28 |
| 2015-04-21 | 24.09 |
| 2015-04-22 | 24.2 |
| 2015-04-23 | 24.15 |
| 2015-04-24 | 23.9 |
| 2015-04-27 | 23.63 |
| 2015-04-28 | 23.88 |
| 2015-04-29 | 23.8 |
| 2015-04-30 | 23.62 |
| 2015-05-04 | 24.04 |
| 2015-05-05 | 24.07 |
| 2015-05-06 | 23.26 |
| 2015-05-07 | 23.03 |
| 2015-05-08 | 23.36 |
| 2015-05-11 | 23.85 |
| 2015-05-12 | 23.37 |
| 2015-05-13 | 23.65 |
| 2015-05-14 | 23.71 |
| 2015-05-15 | 23.82 |
| 2015-05-18 | 24.18 |
| 2015-05-19 | 24.18 |
| 2015-05-20 | 24.29 |
| 2015-05-21 | 24.29 |
| 2015-05-22 | 24.54 |
| 2015-05-25 | 24.28 |
| 2015-05-26 | 24.19 |
| 2015-05-27 | 24.2 |
| 2015-05-28 | 24.03 |
| 2015-05-29 | 24.42 |
| 2015-06-01 | 24.79 |
| 2015-06-02 | 24.26 |
| 2015-06-03 | 23.99 |
| 2015-06-04 | 24.05 |
| 2015-06-05 | 24.08 |
| 2015-06-08 | 23.76 |
| 2015-06-09 | 23.7 |
| 2015-06-10 | 23.98 |
| 2015-06-11 | 23.54 |
| 2015-06-12 | 23.57 |
| 2015-06-15 | 23.59 |
| 2015-06-16 | 23.69 |
| 2015-06-17 | 23.88 |
| 2015-06-18 | 24.11 |
| 2015-06-19 | 24.25 |
| 2015-06-22 | 24.63 |
| 2015-06-23 | 24.71 |
| 2015-06-24 | 24.62 |
| 2015-06-25 | 24.73 |
| 2015-06-26 | 24.7 |
| 2015-06-29 | 24.46 |
| 2015-06-30 | 24.65 |
| 2015-07-01 | 24.92 |
| 2015-07-02 | 24.96 |
| 2015-07-03 | 25.04 |
| 2015-07-06 | 25.18 |
| 2015-07-07 | 25.2 |
| 2015-07-08 | 24.81 |
| 2015-07-09 | 24.72 |
| 2015-07-10 | 24.79 |
| 2015-07-13 | 25.08 |
| 2015-07-14 | 25.1 |
| 2015-07-15 | 25.26 |
| 2015-07-16 | 25.51 |
| 2015-07-17 | 25.55 |
| 2015-07-20 | 25.58 |
| 2015-07-21 | 25.3 |
| 2015-07-22 | 25.58 |
| 2015-07-23 | 25.51 |
| 2015-07-24 | 25.32 |
| 2015-07-27 | 24.89 |
| 2015-07-28 | 24.69 |
| 2015-07-29 | 24.79 |
| 2015-07-30 | 24.93 |
| 2015-07-31 | 25.23 |
| 2015-08-03 | 25.34 |
| 2015-08-04 | 25.35 |
| 2015-08-05 | 25.56 |
| 2015-08-06 | 25.64 |
| 2015-08-07 | 25.56 |
| 2015-08-10 | 25.66 |
| 2015-08-11 | 25.66 |
| 2015-08-12 | 25.29 |
| 2015-08-13 | 25.27 |
| 2015-08-14 | 25.62 |
| 2015-08-17 | 25.68 |
| 2015-08-18 | 25.71 |
| 2015-08-19 | 25.79 |
| 2015-08-20 | 25.39 |
| 2015-08-21 | 25.19 |
| 2015-08-24 | 23.49 |
| 2015-08-25 | 23.78 |
| 2015-08-26 | 23.55 |
| 2015-08-27 | 24.08 |
| 2015-08-28 | 24.21 |
| 2015-08-31 | 24.12 |
| 2015-09-01 | 23.59 |
| 2015-09-02 | 23.42 |
| 2015-09-03 | 23.72 |
| 2015-09-04 | 23.22 |
| 2015-09-07 | 22.81 |
| 2015-09-08 | 23.11 |
| 2015-09-09 | 23.53 |
| 2015-09-10 | 23.46 |
| 2015-09-11 | 23.49 |
| 2015-09-14 | 23.75 |
| 2015-09-15 | 23.6 |
| 2015-09-16 | 23.71 |
| 2015-09-18 | 23.94 |
| 2015-09-21 | 23.97 |
| 2015-09-22 | 23.55 |
| 2015-09-23 | 23.64 |
| 2015-09-24 | 23.71 |
| 2015-09-28 | 23.26 |
| 2015-09-29 | 23.36 |
| 2015-09-30 | 23.69 |
| 2015-10-01 | 23.72 |
| 2015-10-05 | 24.2 |
| 2015-10-06 | 24.31 |
| 2015-10-07 | 24.37 |
| 2015-10-08 | 24.23 |
| 2015-10-09 | 24.35 |
| 2015-10-12 | 24.25 |
| 2015-10-13 | 23.88 |
| 2015-10-14 | 23.81 |
| 2015-10-15 | 23.97 |
| 2015-10-16 | 24.11 |
| 2015-10-19 | 24.2 |
| 2015-10-20 | 24.13 |
| 2015-10-21 | 24.1 |
| 2015-10-23 | 24.11 |
| 2015-10-26 | 24.01 |
| 2015-10-27 | 23.96 |
| 2015-10-28 | 23.8 |
| 2015-10-29 | 23.78 |
| 2015-10-30 | 23.67 |
| 2015-11-02 | 23.53 |
| 2015-11-03 | 23.6 |
| 2015-11-04 | 23.43 |
| 2015-11-05 | 23.1 |
| 2015-11-06 | 23.05 |
| 2015-11-09 | 23.02 |
| 2015-11-10 | 22.66 |
| 2015-11-11 | 22.83 |
| 2015-11-13 | 22.73 |
| 2015-11-16 | 22.88 |
| 2015-11-17 | 23.01 |
| 2015-11-18 | 22.75 |
| 2015-11-19 | 23.05 |
| 2015-11-20 | 23.15 |
| 2015-11-23 | 23.16 |
| 2015-11-24 | 23.13 |
| 2015-11-26 | 23.26 |
| 2015-11-27 | 23.41 |
| 2015-11-30 | 23.4 |
| 2015-12-01 | 23.49 |
| 2015-12-02 | 23.44 |
| 2015-12-03 | 23.27 |
| 2015-12-04 | 23.08 |
| 2015-12-07 | 23.05 |
| 2015-12-08 | 22.83 |
| 2015-12-09 | 22.52 |
| 2015-12-10 | 22.72 |
| 2015-12-11 | 22.52 |
| 2015-12-14 | 22.64 |
| 2015-12-15 | 22.79 |
| 2015-12-16 | 22.91 |
| 2015-12-17 | 23.21 |
| 2015-12-18 | 23.05 |
| 2015-12-21 | 23.25 |
| 2015-12-22 | 23.14 |
| 2015-12-23 | 23.34 |
| 2015-12-24 | 23.36 |
| 2015-12-28 | 23.51 |
| 2015-12-29 | 23.54 |
| 2015-12-30 | 23.47 |
| 2015-12-31 | 23.6 |
| 2016-01-04 | 23.27 |
| 2016-01-05 | 23.3 |
| 2016-01-06 | 23.19 |
| 2016-01-07 | 22.63 |
| 2016-01-08 | 22.78 |
| 2016-01-11 | 22.65 |
| 2016-01-12 | 22.49 |
| 2016-01-13 | 22.53 |
| 2016-01-14 | 22.42 |
| 2016-01-15 | 22.01 |
| 2016-01-18 | 21.6 |
| 2016-01-19 | 21.86 |
| 2016-01-20 | 21.48 |
| 2016-01-21 | 21.4 |
| 2016-01-22 | 21.78 |
| 2016-01-25 | 21.84 |
| 2016-01-27 | 21.88 |
| 2016-01-28 | 21.7 |
| 2016-01-29 | 22.08 |
| 2016-02-01 | 22.06 |
| 2016-02-02 | 21.93 |
| 2016-02-03 | 21.62 |
| 2016-02-04 | 21.66 |
| 2016-02-05 | 21.97 |
| 2016-02-08 | 21.7 |
| 2016-02-09 | 21.41 |
| 2016-02-10 | 20.76 |
| 2016-02-11 | 20.05 |
| 2016-02-12 | 20.02 |
| 2016-02-15 | 21.06 |
| 2016-02-16 | 20.69 |
| 2016-02-17 | 20.86 |
| 2016-02-18 | 21.08 |
| 2016-02-19 | 21.19 |
| 2016-02-22 | 21.27 |
| 2016-02-23 | 20.94 |
| 2016-02-24 | 20.69 |
| 2016-02-25 | 20.54 |
| 2016-02-26 | 20.7 |
| 2016-02-29 | 20.64 |
| 2016-03-01 | 21.31 |
| 2016-03-02 | 21.73 |
| 2016-03-03 | 22.01 |
| 2016-03-04 | 22.09 |
| 2016-03-08 | 22.07 |
| 2016-03-09 | 22.16 |
| 2016-03-10 | 22.05 |
| 2016-03-11 | 22.1 |
| 2016-03-14 | 22.21 |
| 2016-03-15 | 21.99 |
| 2016-03-16 | 22.06 |
| 2016-03-17 | 22.12 |
| 2016-03-18 | 22.35 |
| 2016-03-21 | 22.63 |
| 2016-03-22 | 22.67 |
| 2016-03-23 | 22.69 |
| 2016-03-28 | 22.38 |
| 2016-03-29 | 22.33 |
| 2016-03-30 | 22.74 |
| 2016-03-31 | 22.81 |
| 2016-04-01 | 23.01 |
| 2016-04-04 | 23.11 |
| 2016-04-05 | 22.68 |
| 2016-04-06 | 22.75 |
| 2016-04-07 | 22.57 |
| 2016-04-08 | 22.63 |
| 2016-04-11 | 22.93 |
| 2016-04-12 | 23.07 |
| 2016-04-13 | 23.45 |
| 2016-04-18 | 23.64 |
| 2016-04-20 | 23.6 |
| 2016-04-21 | 23.54 |
| 2016-04-22 | 23.51 |
| 2016-04-25 | 23.38 |
| 2016-04-26 | 23.58 |
| 2016-04-27 | 23.63 |
| 2016-04-28 | 23.27 |
| 2016-04-29 | 23.16 |
| 2016-05-02 | 23.05 |
| 2016-05-03 | 22.88 |
| 2016-05-04 | 22.71 |
| 2016-05-05 | 22.72 |
| 2016-05-06 | 22.71 |
| 2016-05-09 | 23.02 |
| 2016-05-10 | 23.06 |
| 2016-05-11 | 23.02 |
| 2016-05-12 | 23.19 |
| 2016-05-13 | 22.98 |
| 2016-05-16 | 23.34 |
| 2016-05-17 | 23.43 |
| 2016-05-18 | 23.44 |
| 2016-05-19 | 23.16 |
| 2016-05-20 | 23 |
| 2016-05-23 | 22.94 |
| 2016-05-24 | 23.31 |
| 2016-05-25 | 24.11 |
| 2016-05-26 | 24.54 |
| 2016-05-27 | 24.6 |
| 2016-05-30 | 25.03 |
| 2016-05-31 | 24.97 |
| 2016-06-01 | 25.3 |
| 2016-06-02 | 25.65 |
| 2016-06-03 | 25.63 |
| 2016-06-06 | 25.58 |
| 2016-06-07 | 25.55 |
| 2016-06-08 | 25.61 |
| 2016-06-09 | 25.45 |
| 2016-06-10 | 25.35 |
| 2016-06-13 | 25.18 |
| 2016-06-14 | 25.22 |
| 2016-06-15 | 25.48 |
| 2016-06-16 | 25.31 |
| 2016-06-17 | 25.4 |
| 2016-06-20 | 25.58 |
| 2016-06-21 | 25.56 |
| 2016-06-22 | 25.5 |
| 2016-06-23 | 25.65 |
| 2016-06-24 | 25.15 |
| 2016-06-27 | 25.25 |
| 2016-06-28 | 25.36 |
| 2016-06-29 | 25.62 |
| 2016-06-30 | 25.89 |
| 2016-07-01 | 26.07 |
| 2016-07-04 | 26.23 |
| 2016-07-05 | 26.15 |
| 2016-07-07 | 26.15 |
| 2016-07-08 | 26.11 |
| 2016-07-11 | 26.53 |
| 2016-07-12 | 26.66 |
| 2016-07-13 | 26.6 |
| 2016-07-14 | 26.8 |
| 2016-07-15 | 26.72 |
| 2016-07-18 | 26.6 |
| 2016-07-19 | 26.66 |
| 2016-07-20 | 26.82 |
| 2016-07-21 | 26.69 |
| 2016-07-22 | 26.84 |
| 2016-07-25 | 27.14 |
| 2016-07-26 | 27.01 |
| 2016-07-27 | 27.12 |
| 2016-07-28 | 27.19 |
| 2016-07-29 | 27.16 |
| 2016-08-01 | 27.18 |
| 2016-08-02 | 27.09 |
| 2016-08-03 | 26.8 |
| 2016-08-04 | 26.86 |
| 2016-08-05 | 27.29 |
| 2016-08-08 | 27.42 |
| 2016-08-09 | 27.31 |
| 2016-08-10 | 26.97 |
| 2016-08-11 | 27.01 |
| 2016-08-12 | 27.23 |
| 2016-08-16 | 27.2 |
| 2016-08-17 | 27.22 |
| 2016-08-18 | 27.39 |
| 2016-08-19 | 27.42 |
| 2016-08-22 | 27.29 |
| 2016-08-23 | 27.56 |
| 2016-08-24 | 27.66 |
| 2016-08-25 | 27.5 |
| 2016-08-26 | 27.59 |
| 2016-08-29 | 27.7 |
| 2016-08-30 | 28.13 |
| 2016-08-31 | 28.23 |
| 2016-09-01 | 28.17 |
| 2016-09-02 | 28.29 |
| 2016-09-06 | 28.7 |
| 2016-09-07 | 28.68 |
| 2016-09-08 | 28.82 |
| 2016-09-09 | 28.56 |
| 2016-09-12 | 28.01 |
| 2016-09-14 | 28.15 |
| 2016-09-15 | 28.17 |
| 2016-09-16 | 28.27 |
| 2016-09-19 | 28.37 |
| 2016-09-20 | 28.28 |
| 2016-09-21 | 28.31 |
| 2016-09-22 | 28.72 |
| 2016-09-23 | 28.56 |
| 2016-09-26 | 28.25 |
| 2016-09-27 | 28.21 |
| 2016-09-28 | 28.32 |
| 2016-09-29 | 27.6 |
| 2016-09-30 | 27.49 |
| 2016-10-03 | 28.04 |
| 2016-10-04 | 28.17 |
| 2016-10-05 | 27.6 |
| 2016-10-06 | 27.68 |
| 2016-10-07 | 27.64 |
| 2016-10-10 | 27.54 |
| 2016-10-13 | 27.26 |
| 2016-10-14 | 27.12 |
| 2016-10-17 | 27.13 |
| 2016-10-18 | 27.41 |
| 2016-10-19 | 27.57 |
| 2016-10-20 | 27.66 |
| 2016-10-21 | 27.45 |
| 2016-10-24 | 27.46 |
| 2016-10-25 | 27.47 |
| 2016-10-26 | 27.5 |
| 2016-10-27 | 27.39 |
| 2016-10-28 | 27.54 |
| 2016-10-30 | 27.57 |
| 2016-11-01 | 27.58 |
| 2016-11-02 | 27.14 |
| 2016-11-03 | 26.97 |
| 2016-11-04 | 26.65 |
| 2016-11-07 | 26.67 |
| 2016-11-08 | 26.4 |
| 2016-11-09 | 26.16 |
| 2016-11-10 | 26.43 |
| 2016-11-11 | 25.58 |
| 2016-11-15 | 24.73 |
| 2016-11-16 | 25 |
| 2016-11-17 | 24.86 |
| 2016-11-18 | 24.82 |
| 2016-11-21 | 24.37 |
| 2016-11-22 | 24.64 |
| 2016-11-23 | 24.79 |
| 2016-11-24 | 24.55 |
| 2016-11-25 | 24.84 |
| 2016-11-28 | 24.92 |
| 2016-11-29 | 24.86 |
| 2016-11-30 | 25.09 |
| 2016-12-01 | 24.95 |
| 2016-12-02 | 24.58 |
| 2016-12-05 | 24.68 |
| 2016-12-06 | 24.91 |
| 2016-12-07 | 24.63 |
| 2016-12-08 | 25.23 |
| 2016-12-09 | 25.28 |
| 2016-12-12 | 24.86 |
| 2016-12-13 | 25 |
| 2016-12-14 | 24.86 |
| 2016-12-15 | 24.84 |
| 2016-12-16 | 24.8 |
| 2016-12-19 | 24.72 |
| 2016-12-20 | 24.59 |
| 2016-12-21 | 24.53 |
| 2016-12-22 | 24.49 |
| 2016-12-23 | 24.7 |
| 2016-12-26 | 24.54 |
| 2016-12-27 | 24.94 |
| 2016-12-28 | 25 |
| 2016-12-29 | 25.25 |
| 2016-12-30 | 25.3 |
| 2017-01-02 | 25.51 |
| 2017-01-03 | 25.64 |
| 2017-01-04 | 25.5 |
| 2017-01-05 | 25.77 |
| 2017-01-06 | 25.69 |
| 2017-01-09 | 25.69 |
| 2017-01-10 | 26.01 |
| 2017-01-11 | 26.11 |
| 2017-01-12 | 26.17 |
| 2017-01-13 | 26.16 |
| 2017-01-16 | 26.22 |
| 2017-01-17 | 26.13 |
| 2017-01-18 | 26.17 |
| 2017-01-19 | 26.24 |
| 2017-01-20 | 26.07 |
| 2017-01-23 | 26.17 |
| 2017-01-24 | 26.32 |
| 2017-01-25 | 26.66 |
| 2017-01-27 | 26.76 |
| 2017-01-30 | 26.76 |
| 2017-01-31 | 26.57 |
| 2017-02-01 | 27.05 |
| 2017-02-02 | 26.89 |
| 2017-02-03 | 26.77 |
| 2017-02-06 | 26.97 |
| 2017-02-07 | 26.85 |
| 2017-02-08 | 26.86 |
| 2017-02-09 | 26.89 |
| 2017-02-10 | 26.89 |
| 2017-02-13 | 26.52 |
| 2017-02-14 | 26.39 |
| 2017-02-15 | 26.08 |
| 2017-02-16 | 26.43 |
| 2017-02-17 | 26.44 |
| 2017-02-20 | 26.64 |
| 2017-02-21 | 26.76 |
| 2017-02-22 | 26.7 |
| 2017-02-23 | 26.72 |
| 2017-02-27 | 26.61 |
| 2017-02-28 | 26.57 |
| 2017-03-01 | 26.73 |
| 2017-03-02 | 26.46 |
| 2017-03-03 | 26.48 |
| 2017-03-06 | 26.65 |
| 2017-03-07 | 26.62 |
| 2017-03-08 | 26.53 |
| 2017-03-09 | 26.53 |
| 2017-03-10 | 26.45 |
| 2017-03-14 | 26.94 |
| 2017-03-15 | 27.01 |
| 2017-03-16 | 27.21 |
| 2017-03-17 | 27.23 |
| 2017-03-20 | 27.18 |
| 2017-03-21 | 27.14 |
| 2017-03-22 | 26.87 |
| 2017-03-23 | 27.06 |
| 2017-03-24 | 27.13 |
| 2017-03-27 | 26.99 |
| 2017-03-28 | 27.15 |
| 2017-03-29 | 27.27 |
| 2017-03-30 | 27.38 |
| 2017-03-31 | 26.82 |
| 2017-04-03 | 27.02 |
| 2017-04-05 | 27.16 |
| 2017-04-06 | 27.15 |
| 2017-04-07 | 26.99 |
| 2017-04-10 | 27.01 |
| 2017-04-11 | 27.2 |
| 2017-04-12 | 27.1 |
| 2017-04-13 | 26.99 |
| 2017-04-17 | 26.98 |
| 2017-04-18 | 26.85 |
| 2017-04-19 | 26.91 |
| 2017-04-20 | 27.05 |
| 2017-04-21 | 27.03 |
| 2017-04-24 | 27.34 |
| 2017-04-25 | 27.6 |
| 2017-04-26 | 27.64 |
| 2017-04-27 | 27.61 |
| 2017-04-28 | 27.59 |
| 2017-05-02 | 27.64 |
| 2017-05-03 | 27.63 |
| 2017-05-04 | 27.76 |
| 2017-05-05 | 27.52 |
| 2017-05-08 | 27.63 |
| 2017-05-09 | 27.68 |
| 2017-05-10 | 27.94 |
| 2017-05-11 | 28.02 |
| 2017-05-12 | 27.92 |
| 2017-05-15 | 28.12 |
| 2017-05-16 | 28.31 |
| 2017-05-17 | 29.09 |
| 2017-05-18 | 28.68 |
| 2017-05-19 | 28.6 |
| 2017-05-22 | 28.08 |
| 2017-05-23 | 27.81 |
| 2017-05-24 | 27.61 |
| 2017-05-25 | 27.77 |
| 2017-05-26 | 28.01 |
| 2017-05-29 | 27.7 |
| 2017-05-30 | 27.84 |
| 2017-05-31 | 27.92 |
| 2017-06-01 | 27.96 |
| 2017-06-02 | 28.1 |
| 2017-06-05 | 28.16 |
| 2017-06-06 | 28 |
| 2017-06-07 | 28.15 |
| 2017-06-08 | 28.15 |
| 2017-06-09 | 28.14 |
| 2017-06-12 | 27.92 |
| 2017-06-13 | 28.2 |
| 2017-06-14 | 28.24 |
| 2017-06-15 | 28.15 |
| 2017-06-16 | 27.68 |
| 2017-06-19 | 28.12 |
| 2017-06-20 | 28.12 |
| 2017-06-21 | 27.92 |
| 2017-06-22 | 28.02 |
| 2017-06-23 | 27.8 |
| 2017-06-27 | 27.57 |
| 2017-06-28 | 27.55 |
| 2017-06-29 | 27.62 |
| 2017-06-30 | 27.72 |
| 2017-07-03 | 28.01 |
| 2017-07-04 | 27.99 |
| 2017-07-05 | 28.12 |
| 2017-07-06 | 28.22 |
| 2017-07-07 | 28.22 |
| 2017-07-10 | 28.48 |
| 2017-07-11 | 28.44 |
| 2017-07-12 | 28.58 |
| 2017-07-13 | 28.78 |
| 2017-07-14 | 28.73 |
| 2017-07-17 | 28.77 |
| 2017-07-18 | 28.67 |
| 2017-07-19 | 28.91 |
| 2017-07-20 | 28.84 |
| 2017-07-21 | 28.93 |
| 2017-07-24 | 29.04 |
| 2017-07-25 | 29.07 |
| 2017-07-26 | 29.18 |
| 2017-07-27 | 29.12 |
| 2017-07-28 | 29.2 |
| 2017-07-31 | 29.33 |
| 2017-08-01 | 29.42 |
| 2017-08-02 | 29.31 |
| 2017-08-03 | 29.2 |
| 2017-08-04 | 29.32 |
| 2017-08-07 | 29.47 |
| 2017-08-08 | 29.23 |
| 2017-08-09 | 28.93 |
| 2017-08-10 | 28.58 |
| 2017-08-11 | 28.22 |
| 2017-08-14 | 28.6 |
| 2017-08-16 | 28.92 |
| 2017-08-17 | 28.94 |
| 2017-08-18 | 28.8 |
| 2017-08-21 | 28.73 |
| 2017-08-22 | 29.08 |
| 2017-08-23 | 29.2 |
| 2017-08-24 | 29.32 |
| 2017-08-28 | 29.55 |
| 2017-08-29 | 29.21 |
| 2017-08-30 | 29.52 |
| 2017-08-31 | 29.63 |
| 2017-09-01 | 30.19 |
| 2017-09-04 | 29.85 |
| 2017-09-05 | 29.98 |
| 2017-09-06 | 30.09 |
| 2017-09-07 | 30.01 |
| 2017-09-08 | 29.99 |
| 2017-09-11 | 30.22 |
| 2017-09-12 | 30.57 |
| 2017-09-13 | 30.33 |
| 2017-09-14 | 30.39 |
| 2017-09-15 | 30.4 |
| 2017-09-18 | 30.6 |
| 2017-09-19 | 30.62 |
| 2017-09-20 | 30.57 |
| 2017-09-21 | 30.66 |
| 2017-09-22 | 30.08 |
| 2017-09-25 | 29.74 |
| 2017-09-26 | 29.8 |
| 2017-09-27 | 29.42 |
| 2017-09-28 | 29.55 |
| 2017-09-29 | 29.58 |
| 2017-10-03 | 29.8 |
| 2017-10-04 | 29.95 |
| 2017-10-05 | 29.92 |
| 2017-10-06 | 30.2 |
| 2017-10-09 | 30.23 |
| 2017-10-10 | 30.36 |
| 2017-10-11 | 30.22 |
| 2017-10-12 | 30.57 |
| 2017-10-13 | 30.73 |
| 2017-10-16 | 30.9 |
| 2017-10-17 | 30.92 |
| 2017-10-18 | 30.84 |
| 2017-10-19 | 30.68 |
| 2017-10-23 | 30.78 |
| 2017-10-24 | 30.8 |
| 2017-10-25 | 31.01 |
| 2017-10-26 | 31.14 |
| 2017-10-27 | 31.11 |
| 2017-10-30 | 31.37 |
| 2017-10-31 | 31.05 |
| 2017-11-01 | 31.16 |
| 2017-11-02 | 31.34 |
| 2017-11-03 | 31.56 |
| 2017-11-06 | 31.54 |
| 2017-11-07 | 31.2 |
| 2017-11-08 | 30.99 |
| 2017-11-09 | 31.1 |
| 2017-11-10 | 31.24 |
| 2017-11-13 | 30.85 |
| 2017-11-14 | 30.76 |
| 2017-11-15 | 30.5 |
| 2017-11-16 | 30.8 |
| 2017-11-17 | 31.05 |
| 2017-11-20 | 31.14 |
| 2017-11-21 | 31.17 |
| 2017-11-22 | 31.45 |
| 2017-11-23 | 31.52 |
| 2017-11-24 | 31.69 |
| 2017-11-27 | 31.75 |
| 2017-11-28 | 31.78 |
| 2017-11-29 | 31.75 |
| 2017-11-30 | 31.44 |
| 2017-12-01 | 31.11 |
| 2017-12-04 | 31.11 |
| 2017-12-05 | 31.11 |
| 2017-12-06 | 30.88 |
| 2017-12-07 | 31.27 |
| 2017-12-08 | 31.57 |
| 2017-12-11 | 31.74 |
| 2017-12-12 | 31.48 |
| 2017-12-13 | 31.29 |
| 2017-12-14 | 31.4 |
| 2017-12-15 | 31.68 |
| 2017-12-18 | 31.88 |
| 2017-12-19 | 32.19 |
| 2017-12-20 | 32.2 |
| 2017-12-21 | 32.26 |
| 2017-12-22 | 32.4 |
| 2017-12-26 | 32.54 |
| 2017-12-27 | 32.43 |
| 2017-12-28 | 32.42 |
| 2017-12-29 | 32.55 |
| 2018-01-01 | 32.36 |
| 2018-01-02 | 32.3 |
| 2018-01-03 | 32.38 |
| 2018-01-04 | 32.61 |
| 2018-01-05 | 32.84 |
| 2018-01-08 | 33.07 |
| 2018-01-09 | 33.07 |
| 2018-01-10 | 33.05 |
| 2018-01-11 | 33.11 |
| 2018-01-12 | 33.14 |
| 2018-01-15 | 32.93 |
| 2018-01-16 | 32.64 |
| 2018-01-17 | 32.89 |
| 2018-01-18 | 32.74 |
| 2018-01-19 | 32.93 |
| 2018-01-22 | 33.14 |
| 2018-01-23 | 33.23 |
| 2018-01-24 | 32.95 |
| 2018-01-25 | 32.78 |
| 2018-01-29 | 32.81 |
| 2018-01-30 | 32.52 |
| 2018-01-31 | 32.36 |
| 2018-02-01 | 32.47 |
| 2018-02-02 | 30.81 |
| 2018-02-05 | 30.66 |
| 2018-02-06 | 30.15 |
| 2018-02-07 | 30.2 |
| 2018-02-08 | 30.59 |
| 2018-02-09 | 30.45 |
| 2018-02-12 | 30.77 |
| 2018-02-14 | 30.67 |
| 2018-02-15 | 30.63 |
| 2018-02-16 | 30.4 |
| 2018-02-19 | 30.15 |
| 2018-02-20 | 30.13 |
| 2018-02-21 | 30.22 |
| 2018-02-22 | 30.43 |
| 2018-02-23 | 30.88 |
| 2018-02-26 | 31.17 |
| 2018-02-27 | 30.99 |
| 2018-02-28 | 30.75 |
| 2018-03-01 | 30.62 |
| 2018-03-05 | 30.37 |
| 2018-03-06 | 29.96 |
| 2018-03-07 | 29.62 |
| 2018-03-08 | 29.83 |
| 2018-03-09 | 29.79 |
| 2018-03-12 | 30.23 |
| 2018-03-13 | 30.24 |
| 2018-03-14 | 30.27 |
| 2018-03-15 | 30.21 |
| 2018-03-16 | 29.76 |
| 2018-03-19 | 29.5 |
| 2018-03-20 | 29.69 |
| 2018-03-21 | 29.79 |
| 2018-03-22 | 29.62 |
| 2018-03-23 | 29.28 |